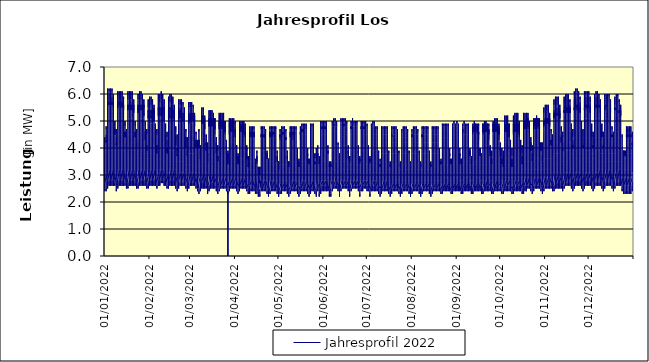
| Category | Jahresprofil 2022 |
|---|---|
| 01/01/2022 | 3 |
| 01/01/2022 | 2.9 |
| 01/01/2022 | 2.7 |
| 01/01/2022 | 2.5 |
| 01/01/2022 | 2.4 |
| 01/01/2022 | 2.4 |
| 01/01/2022 | 2.5 |
| 01/01/2022 | 2.6 |
| 01/01/2022 | 2.7 |
| 01/01/2022 | 2.8 |
| 01/01/2022 | 3.1 |
| 01/01/2022 | 3.4 |
| 01/01/2022 | 3.6 |
| 01/01/2022 | 3.6 |
| 01/01/2022 | 3.6 |
| 01/01/2022 | 3.8 |
| 01/01/2022 | 4 |
| 01/01/2022 | 4.3 |
| 01/01/2022 | 4.4 |
| 01/01/2022 | 4.3 |
| 01/01/2022 | 3.9 |
| 01/01/2022 | 3.6 |
| 01/01/2022 | 3.4 |
| 01/01/2022 | 3.2 |
| 02/01/2022 | 3 |
| 02/01/2022 | 2.7 |
| 02/01/2022 | 2.6 |
| 02/01/2022 | 2.5 |
| 02/01/2022 | 2.4 |
| 02/01/2022 | 2.5 |
| 02/01/2022 | 2.6 |
| 02/01/2022 | 2.8 |
| 02/01/2022 | 3.2 |
| 02/01/2022 | 3.6 |
| 02/01/2022 | 3.9 |
| 02/01/2022 | 4.2 |
| 02/01/2022 | 4.3 |
| 02/01/2022 | 4.2 |
| 02/01/2022 | 4.2 |
| 02/01/2022 | 4.2 |
| 02/01/2022 | 4.5 |
| 02/01/2022 | 4.8 |
| 02/01/2022 | 4.7 |
| 02/01/2022 | 4.6 |
| 02/01/2022 | 4.2 |
| 02/01/2022 | 3.9 |
| 02/01/2022 | 3.8 |
| 02/01/2022 | 3.4 |
| 03/01/2022 | 3 |
| 03/01/2022 | 2.7 |
| 03/01/2022 | 2.6 |
| 03/01/2022 | 2.5 |
| 03/01/2022 | 2.7 |
| 03/01/2022 | 3 |
| 03/01/2022 | 3.8 |
| 03/01/2022 | 4.6 |
| 03/01/2022 | 5 |
| 03/01/2022 | 5.3 |
| 03/01/2022 | 5.5 |
| 03/01/2022 | 5.6 |
| 03/01/2022 | 5.7 |
| 03/01/2022 | 5.6 |
| 03/01/2022 | 5.6 |
| 03/01/2022 | 5.6 |
| 03/01/2022 | 5.9 |
| 03/01/2022 | 6.2 |
| 03/01/2022 | 6.1 |
| 03/01/2022 | 5.8 |
| 03/01/2022 | 5.2 |
| 03/01/2022 | 4.5 |
| 03/01/2022 | 4.1 |
| 03/01/2022 | 3.7 |
| 04/01/2022 | 3.2 |
| 04/01/2022 | 2.8 |
| 04/01/2022 | 2.7 |
| 04/01/2022 | 2.6 |
| 04/01/2022 | 2.8 |
| 04/01/2022 | 3.1 |
| 04/01/2022 | 3.9 |
| 04/01/2022 | 4.7 |
| 04/01/2022 | 5.1 |
| 04/01/2022 | 5.4 |
| 04/01/2022 | 5.6 |
| 04/01/2022 | 5.7 |
| 04/01/2022 | 5.7 |
| 04/01/2022 | 5.7 |
| 04/01/2022 | 5.6 |
| 04/01/2022 | 5.6 |
| 04/01/2022 | 6 |
| 04/01/2022 | 6.2 |
| 04/01/2022 | 6.1 |
| 04/01/2022 | 5.9 |
| 04/01/2022 | 5.2 |
| 04/01/2022 | 4.5 |
| 04/01/2022 | 4.2 |
| 04/01/2022 | 3.7 |
| 05/01/2022 | 3.2 |
| 05/01/2022 | 2.8 |
| 05/01/2022 | 2.7 |
| 05/01/2022 | 2.6 |
| 05/01/2022 | 2.8 |
| 05/01/2022 | 3.1 |
| 05/01/2022 | 3.9 |
| 05/01/2022 | 4.7 |
| 05/01/2022 | 5.1 |
| 05/01/2022 | 5.4 |
| 05/01/2022 | 5.6 |
| 05/01/2022 | 5.7 |
| 05/01/2022 | 5.7 |
| 05/01/2022 | 5.7 |
| 05/01/2022 | 5.6 |
| 05/01/2022 | 5.6 |
| 05/01/2022 | 6 |
| 05/01/2022 | 6.2 |
| 05/01/2022 | 6.1 |
| 05/01/2022 | 5.9 |
| 05/01/2022 | 5.2 |
| 05/01/2022 | 4.5 |
| 05/01/2022 | 4.2 |
| 05/01/2022 | 3.7 |
| 06/01/2022 | 3.2 |
| 06/01/2022 | 2.8 |
| 06/01/2022 | 2.7 |
| 06/01/2022 | 2.6 |
| 06/01/2022 | 2.8 |
| 06/01/2022 | 3.1 |
| 06/01/2022 | 3.9 |
| 06/01/2022 | 4.7 |
| 06/01/2022 | 5.1 |
| 06/01/2022 | 5.4 |
| 06/01/2022 | 5.6 |
| 06/01/2022 | 5.7 |
| 06/01/2022 | 5.7 |
| 06/01/2022 | 5.7 |
| 06/01/2022 | 5.6 |
| 06/01/2022 | 5.6 |
| 06/01/2022 | 5.9 |
| 06/01/2022 | 6.2 |
| 06/01/2022 | 6.1 |
| 06/01/2022 | 5.8 |
| 06/01/2022 | 5.1 |
| 06/01/2022 | 4.5 |
| 06/01/2022 | 4.1 |
| 06/01/2022 | 3.7 |
| 07/01/2022 | 3.2 |
| 07/01/2022 | 2.8 |
| 07/01/2022 | 2.7 |
| 07/01/2022 | 2.6 |
| 07/01/2022 | 2.8 |
| 07/01/2022 | 3.1 |
| 07/01/2022 | 3.8 |
| 07/01/2022 | 4.6 |
| 07/01/2022 | 5.1 |
| 07/01/2022 | 5.4 |
| 07/01/2022 | 5.6 |
| 07/01/2022 | 5.6 |
| 07/01/2022 | 5.7 |
| 07/01/2022 | 5.5 |
| 07/01/2022 | 5.5 |
| 07/01/2022 | 5.5 |
| 07/01/2022 | 5.8 |
| 07/01/2022 | 6 |
| 07/01/2022 | 5.8 |
| 07/01/2022 | 5.5 |
| 07/01/2022 | 4.9 |
| 07/01/2022 | 4.3 |
| 07/01/2022 | 4 |
| 07/01/2022 | 3.6 |
| 08/01/2022 | 3.2 |
| 08/01/2022 | 2.8 |
| 08/01/2022 | 2.7 |
| 08/01/2022 | 2.6 |
| 08/01/2022 | 2.6 |
| 08/01/2022 | 2.7 |
| 08/01/2022 | 2.9 |
| 08/01/2022 | 3.3 |
| 08/01/2022 | 3.7 |
| 08/01/2022 | 4.2 |
| 08/01/2022 | 4.5 |
| 08/01/2022 | 4.7 |
| 08/01/2022 | 4.7 |
| 08/01/2022 | 4.6 |
| 08/01/2022 | 4.5 |
| 08/01/2022 | 4.5 |
| 08/01/2022 | 4.8 |
| 08/01/2022 | 5 |
| 08/01/2022 | 5 |
| 08/01/2022 | 4.8 |
| 08/01/2022 | 4.3 |
| 08/01/2022 | 3.9 |
| 08/01/2022 | 3.7 |
| 08/01/2022 | 3.4 |
| 09/01/2022 | 3 |
| 09/01/2022 | 2.7 |
| 09/01/2022 | 2.6 |
| 09/01/2022 | 2.5 |
| 09/01/2022 | 2.4 |
| 09/01/2022 | 2.5 |
| 09/01/2022 | 2.6 |
| 09/01/2022 | 2.9 |
| 09/01/2022 | 3.2 |
| 09/01/2022 | 3.6 |
| 09/01/2022 | 3.9 |
| 09/01/2022 | 4.1 |
| 09/01/2022 | 4.2 |
| 09/01/2022 | 4.2 |
| 09/01/2022 | 4.1 |
| 09/01/2022 | 4.1 |
| 09/01/2022 | 4.4 |
| 09/01/2022 | 4.7 |
| 09/01/2022 | 4.7 |
| 09/01/2022 | 4.5 |
| 09/01/2022 | 4.2 |
| 09/01/2022 | 3.9 |
| 09/01/2022 | 3.7 |
| 09/01/2022 | 3.4 |
| 10/01/2022 | 3 |
| 10/01/2022 | 2.7 |
| 10/01/2022 | 2.6 |
| 10/01/2022 | 2.5 |
| 10/01/2022 | 2.7 |
| 10/01/2022 | 3 |
| 10/01/2022 | 3.8 |
| 10/01/2022 | 4.6 |
| 10/01/2022 | 5 |
| 10/01/2022 | 5.3 |
| 10/01/2022 | 5.5 |
| 10/01/2022 | 5.6 |
| 10/01/2022 | 5.6 |
| 10/01/2022 | 5.6 |
| 10/01/2022 | 5.5 |
| 10/01/2022 | 5.5 |
| 10/01/2022 | 5.8 |
| 10/01/2022 | 6.1 |
| 10/01/2022 | 6.1 |
| 10/01/2022 | 5.8 |
| 10/01/2022 | 5.1 |
| 10/01/2022 | 4.5 |
| 10/01/2022 | 4.1 |
| 10/01/2022 | 3.6 |
| 11/01/2022 | 3.2 |
| 11/01/2022 | 2.8 |
| 11/01/2022 | 2.7 |
| 11/01/2022 | 2.6 |
| 11/01/2022 | 2.8 |
| 11/01/2022 | 3.1 |
| 11/01/2022 | 3.9 |
| 11/01/2022 | 4.7 |
| 11/01/2022 | 5.1 |
| 11/01/2022 | 5.4 |
| 11/01/2022 | 5.6 |
| 11/01/2022 | 5.7 |
| 11/01/2022 | 5.7 |
| 11/01/2022 | 5.6 |
| 11/01/2022 | 5.6 |
| 11/01/2022 | 5.6 |
| 11/01/2022 | 5.8 |
| 11/01/2022 | 6.1 |
| 11/01/2022 | 6.1 |
| 11/01/2022 | 5.8 |
| 11/01/2022 | 5.2 |
| 11/01/2022 | 4.5 |
| 11/01/2022 | 4.1 |
| 11/01/2022 | 3.7 |
| 12/01/2022 | 3.2 |
| 12/01/2022 | 2.8 |
| 12/01/2022 | 2.7 |
| 12/01/2022 | 2.6 |
| 12/01/2022 | 2.8 |
| 12/01/2022 | 3.1 |
| 12/01/2022 | 3.9 |
| 12/01/2022 | 4.7 |
| 12/01/2022 | 5.1 |
| 12/01/2022 | 5.4 |
| 12/01/2022 | 5.6 |
| 12/01/2022 | 5.6 |
| 12/01/2022 | 5.7 |
| 12/01/2022 | 5.6 |
| 12/01/2022 | 5.5 |
| 12/01/2022 | 5.5 |
| 12/01/2022 | 5.8 |
| 12/01/2022 | 6.1 |
| 12/01/2022 | 6.1 |
| 12/01/2022 | 5.8 |
| 12/01/2022 | 5.2 |
| 12/01/2022 | 4.5 |
| 12/01/2022 | 4.1 |
| 12/01/2022 | 3.7 |
| 13/01/2022 | 3.2 |
| 13/01/2022 | 2.8 |
| 13/01/2022 | 2.7 |
| 13/01/2022 | 2.6 |
| 13/01/2022 | 2.8 |
| 13/01/2022 | 3.1 |
| 13/01/2022 | 3.9 |
| 13/01/2022 | 4.7 |
| 13/01/2022 | 5.1 |
| 13/01/2022 | 5.4 |
| 13/01/2022 | 5.5 |
| 13/01/2022 | 5.6 |
| 13/01/2022 | 5.7 |
| 13/01/2022 | 5.6 |
| 13/01/2022 | 5.5 |
| 13/01/2022 | 5.5 |
| 13/01/2022 | 5.8 |
| 13/01/2022 | 6.1 |
| 13/01/2022 | 6.1 |
| 13/01/2022 | 5.8 |
| 13/01/2022 | 5.1 |
| 13/01/2022 | 4.5 |
| 13/01/2022 | 4.1 |
| 13/01/2022 | 3.7 |
| 14/01/2022 | 3.2 |
| 14/01/2022 | 2.8 |
| 14/01/2022 | 2.7 |
| 14/01/2022 | 2.6 |
| 14/01/2022 | 2.8 |
| 14/01/2022 | 3.1 |
| 14/01/2022 | 3.9 |
| 14/01/2022 | 4.6 |
| 14/01/2022 | 5.1 |
| 14/01/2022 | 5.4 |
| 14/01/2022 | 5.5 |
| 14/01/2022 | 5.6 |
| 14/01/2022 | 5.6 |
| 14/01/2022 | 5.5 |
| 14/01/2022 | 5.4 |
| 14/01/2022 | 5.4 |
| 14/01/2022 | 5.6 |
| 14/01/2022 | 5.9 |
| 14/01/2022 | 5.8 |
| 14/01/2022 | 5.5 |
| 14/01/2022 | 4.9 |
| 14/01/2022 | 4.3 |
| 14/01/2022 | 3.9 |
| 14/01/2022 | 3.6 |
| 15/01/2022 | 3.2 |
| 15/01/2022 | 2.8 |
| 15/01/2022 | 2.7 |
| 15/01/2022 | 2.6 |
| 15/01/2022 | 2.6 |
| 15/01/2022 | 2.7 |
| 15/01/2022 | 2.9 |
| 15/01/2022 | 3.3 |
| 15/01/2022 | 3.7 |
| 15/01/2022 | 4.2 |
| 15/01/2022 | 4.5 |
| 15/01/2022 | 4.6 |
| 15/01/2022 | 4.6 |
| 15/01/2022 | 4.5 |
| 15/01/2022 | 4.4 |
| 15/01/2022 | 4.4 |
| 15/01/2022 | 4.6 |
| 15/01/2022 | 4.9 |
| 15/01/2022 | 5 |
| 15/01/2022 | 4.8 |
| 15/01/2022 | 4.3 |
| 15/01/2022 | 3.9 |
| 15/01/2022 | 3.7 |
| 15/01/2022 | 3.4 |
| 16/01/2022 | 3 |
| 16/01/2022 | 2.7 |
| 16/01/2022 | 2.6 |
| 16/01/2022 | 2.5 |
| 16/01/2022 | 2.5 |
| 16/01/2022 | 2.5 |
| 16/01/2022 | 2.6 |
| 16/01/2022 | 2.9 |
| 16/01/2022 | 3.2 |
| 16/01/2022 | 3.6 |
| 16/01/2022 | 3.9 |
| 16/01/2022 | 4.1 |
| 16/01/2022 | 4.2 |
| 16/01/2022 | 4.1 |
| 16/01/2022 | 4 |
| 16/01/2022 | 4 |
| 16/01/2022 | 4.3 |
| 16/01/2022 | 4.6 |
| 16/01/2022 | 4.7 |
| 16/01/2022 | 4.5 |
| 16/01/2022 | 4.2 |
| 16/01/2022 | 3.8 |
| 16/01/2022 | 3.7 |
| 16/01/2022 | 3.4 |
| 17/01/2022 | 3 |
| 17/01/2022 | 2.7 |
| 17/01/2022 | 2.6 |
| 17/01/2022 | 2.5 |
| 17/01/2022 | 2.7 |
| 17/01/2022 | 3 |
| 17/01/2022 | 3.8 |
| 17/01/2022 | 4.6 |
| 17/01/2022 | 5 |
| 17/01/2022 | 5.3 |
| 17/01/2022 | 5.5 |
| 17/01/2022 | 5.6 |
| 17/01/2022 | 5.6 |
| 17/01/2022 | 5.5 |
| 17/01/2022 | 5.5 |
| 17/01/2022 | 5.4 |
| 17/01/2022 | 5.6 |
| 17/01/2022 | 6 |
| 17/01/2022 | 6.1 |
| 17/01/2022 | 5.8 |
| 17/01/2022 | 5.1 |
| 17/01/2022 | 4.5 |
| 17/01/2022 | 4.1 |
| 17/01/2022 | 3.6 |
| 18/01/2022 | 3.2 |
| 18/01/2022 | 2.8 |
| 18/01/2022 | 2.7 |
| 18/01/2022 | 2.6 |
| 18/01/2022 | 2.8 |
| 18/01/2022 | 3.1 |
| 18/01/2022 | 3.9 |
| 18/01/2022 | 4.7 |
| 18/01/2022 | 5.1 |
| 18/01/2022 | 5.4 |
| 18/01/2022 | 5.5 |
| 18/01/2022 | 5.6 |
| 18/01/2022 | 5.6 |
| 18/01/2022 | 5.6 |
| 18/01/2022 | 5.5 |
| 18/01/2022 | 5.5 |
| 18/01/2022 | 5.7 |
| 18/01/2022 | 6 |
| 18/01/2022 | 6.1 |
| 18/01/2022 | 5.8 |
| 18/01/2022 | 5.1 |
| 18/01/2022 | 4.5 |
| 18/01/2022 | 4.1 |
| 18/01/2022 | 3.7 |
| 19/01/2022 | 3.2 |
| 19/01/2022 | 2.8 |
| 19/01/2022 | 2.7 |
| 19/01/2022 | 2.6 |
| 19/01/2022 | 2.8 |
| 19/01/2022 | 3.1 |
| 19/01/2022 | 3.9 |
| 19/01/2022 | 4.7 |
| 19/01/2022 | 5.1 |
| 19/01/2022 | 5.4 |
| 19/01/2022 | 5.5 |
| 19/01/2022 | 5.6 |
| 19/01/2022 | 5.6 |
| 19/01/2022 | 5.5 |
| 19/01/2022 | 5.5 |
| 19/01/2022 | 5.4 |
| 19/01/2022 | 5.7 |
| 19/01/2022 | 6 |
| 19/01/2022 | 6.1 |
| 19/01/2022 | 5.8 |
| 19/01/2022 | 5.1 |
| 19/01/2022 | 4.5 |
| 19/01/2022 | 4.1 |
| 19/01/2022 | 3.7 |
| 20/01/2022 | 3.2 |
| 20/01/2022 | 2.8 |
| 20/01/2022 | 2.7 |
| 20/01/2022 | 2.6 |
| 20/01/2022 | 2.8 |
| 20/01/2022 | 3.1 |
| 20/01/2022 | 3.9 |
| 20/01/2022 | 4.7 |
| 20/01/2022 | 5.1 |
| 20/01/2022 | 5.4 |
| 20/01/2022 | 5.5 |
| 20/01/2022 | 5.6 |
| 20/01/2022 | 5.6 |
| 20/01/2022 | 5.5 |
| 20/01/2022 | 5.5 |
| 20/01/2022 | 5.4 |
| 20/01/2022 | 5.6 |
| 20/01/2022 | 6 |
| 20/01/2022 | 6.1 |
| 20/01/2022 | 5.8 |
| 20/01/2022 | 5.1 |
| 20/01/2022 | 4.5 |
| 20/01/2022 | 4 |
| 20/01/2022 | 3.6 |
| 21/01/2022 | 3.2 |
| 21/01/2022 | 2.8 |
| 21/01/2022 | 2.7 |
| 21/01/2022 | 2.6 |
| 21/01/2022 | 2.8 |
| 21/01/2022 | 3.1 |
| 21/01/2022 | 3.9 |
| 21/01/2022 | 4.6 |
| 21/01/2022 | 5.1 |
| 21/01/2022 | 5.4 |
| 21/01/2022 | 5.5 |
| 21/01/2022 | 5.6 |
| 21/01/2022 | 5.6 |
| 21/01/2022 | 5.4 |
| 21/01/2022 | 5.3 |
| 21/01/2022 | 5.3 |
| 21/01/2022 | 5.5 |
| 21/01/2022 | 5.8 |
| 21/01/2022 | 5.8 |
| 21/01/2022 | 5.5 |
| 21/01/2022 | 4.8 |
| 21/01/2022 | 4.2 |
| 21/01/2022 | 3.9 |
| 21/01/2022 | 3.5 |
| 22/01/2022 | 3.2 |
| 22/01/2022 | 2.8 |
| 22/01/2022 | 2.7 |
| 22/01/2022 | 2.6 |
| 22/01/2022 | 2.6 |
| 22/01/2022 | 2.7 |
| 22/01/2022 | 2.9 |
| 22/01/2022 | 3.3 |
| 22/01/2022 | 3.7 |
| 22/01/2022 | 4.2 |
| 22/01/2022 | 4.5 |
| 22/01/2022 | 4.6 |
| 22/01/2022 | 4.6 |
| 22/01/2022 | 4.5 |
| 22/01/2022 | 4.4 |
| 22/01/2022 | 4.4 |
| 22/01/2022 | 4.5 |
| 22/01/2022 | 4.9 |
| 22/01/2022 | 5 |
| 22/01/2022 | 4.8 |
| 22/01/2022 | 4.3 |
| 22/01/2022 | 3.9 |
| 22/01/2022 | 3.6 |
| 22/01/2022 | 3.4 |
| 23/01/2022 | 3 |
| 23/01/2022 | 2.7 |
| 23/01/2022 | 2.6 |
| 23/01/2022 | 2.5 |
| 23/01/2022 | 2.5 |
| 23/01/2022 | 2.5 |
| 23/01/2022 | 2.6 |
| 23/01/2022 | 2.9 |
| 23/01/2022 | 3.2 |
| 23/01/2022 | 3.6 |
| 23/01/2022 | 3.9 |
| 23/01/2022 | 4.1 |
| 23/01/2022 | 4.2 |
| 23/01/2022 | 4.1 |
| 23/01/2022 | 4 |
| 23/01/2022 | 4 |
| 23/01/2022 | 4.1 |
| 23/01/2022 | 4.5 |
| 23/01/2022 | 4.7 |
| 23/01/2022 | 4.5 |
| 23/01/2022 | 4.1 |
| 23/01/2022 | 3.8 |
| 23/01/2022 | 3.7 |
| 23/01/2022 | 3.4 |
| 24/01/2022 | 3 |
| 24/01/2022 | 2.7 |
| 24/01/2022 | 2.6 |
| 24/01/2022 | 2.5 |
| 24/01/2022 | 2.7 |
| 24/01/2022 | 3.1 |
| 24/01/2022 | 3.9 |
| 24/01/2022 | 4.6 |
| 24/01/2022 | 5 |
| 24/01/2022 | 5.3 |
| 24/01/2022 | 5.5 |
| 24/01/2022 | 5.5 |
| 24/01/2022 | 5.6 |
| 24/01/2022 | 5.5 |
| 24/01/2022 | 5.4 |
| 24/01/2022 | 5.3 |
| 24/01/2022 | 5.5 |
| 24/01/2022 | 5.9 |
| 24/01/2022 | 6 |
| 24/01/2022 | 5.8 |
| 24/01/2022 | 5.1 |
| 24/01/2022 | 4.4 |
| 24/01/2022 | 4 |
| 24/01/2022 | 3.6 |
| 25/01/2022 | 3.2 |
| 25/01/2022 | 2.8 |
| 25/01/2022 | 2.7 |
| 25/01/2022 | 2.6 |
| 25/01/2022 | 2.8 |
| 25/01/2022 | 3.1 |
| 25/01/2022 | 3.9 |
| 25/01/2022 | 4.7 |
| 25/01/2022 | 5.1 |
| 25/01/2022 | 5.4 |
| 25/01/2022 | 5.5 |
| 25/01/2022 | 5.6 |
| 25/01/2022 | 5.6 |
| 25/01/2022 | 5.5 |
| 25/01/2022 | 5.4 |
| 25/01/2022 | 5.4 |
| 25/01/2022 | 5.6 |
| 25/01/2022 | 6 |
| 25/01/2022 | 6.1 |
| 25/01/2022 | 5.8 |
| 25/01/2022 | 5.1 |
| 25/01/2022 | 4.5 |
| 25/01/2022 | 4 |
| 25/01/2022 | 3.6 |
| 26/01/2022 | 3.2 |
| 26/01/2022 | 2.8 |
| 26/01/2022 | 2.7 |
| 26/01/2022 | 2.6 |
| 26/01/2022 | 2.8 |
| 26/01/2022 | 3.2 |
| 26/01/2022 | 4 |
| 26/01/2022 | 4.7 |
| 26/01/2022 | 5.1 |
| 26/01/2022 | 5.4 |
| 26/01/2022 | 5.5 |
| 26/01/2022 | 5.6 |
| 26/01/2022 | 5.6 |
| 26/01/2022 | 5.5 |
| 26/01/2022 | 5.4 |
| 26/01/2022 | 5.4 |
| 26/01/2022 | 5.5 |
| 26/01/2022 | 6 |
| 26/01/2022 | 6.1 |
| 26/01/2022 | 5.8 |
| 26/01/2022 | 5.1 |
| 26/01/2022 | 4.4 |
| 26/01/2022 | 4 |
| 26/01/2022 | 3.6 |
| 27/01/2022 | 3.2 |
| 27/01/2022 | 2.8 |
| 27/01/2022 | 2.7 |
| 27/01/2022 | 2.6 |
| 27/01/2022 | 2.8 |
| 27/01/2022 | 3.2 |
| 27/01/2022 | 3.9 |
| 27/01/2022 | 4.7 |
| 27/01/2022 | 5.1 |
| 27/01/2022 | 5.4 |
| 27/01/2022 | 5.5 |
| 27/01/2022 | 5.6 |
| 27/01/2022 | 5.6 |
| 27/01/2022 | 5.5 |
| 27/01/2022 | 5.4 |
| 27/01/2022 | 5.4 |
| 27/01/2022 | 5.5 |
| 27/01/2022 | 5.9 |
| 27/01/2022 | 6 |
| 27/01/2022 | 5.7 |
| 27/01/2022 | 5.1 |
| 27/01/2022 | 4.4 |
| 27/01/2022 | 4 |
| 27/01/2022 | 3.6 |
| 28/01/2022 | 3.2 |
| 28/01/2022 | 2.8 |
| 28/01/2022 | 2.7 |
| 28/01/2022 | 2.6 |
| 28/01/2022 | 2.8 |
| 28/01/2022 | 3.1 |
| 28/01/2022 | 3.9 |
| 28/01/2022 | 4.6 |
| 28/01/2022 | 5.1 |
| 28/01/2022 | 5.4 |
| 28/01/2022 | 5.5 |
| 28/01/2022 | 5.6 |
| 28/01/2022 | 5.5 |
| 28/01/2022 | 5.4 |
| 28/01/2022 | 5.3 |
| 28/01/2022 | 5.2 |
| 28/01/2022 | 5.3 |
| 28/01/2022 | 5.7 |
| 28/01/2022 | 5.8 |
| 28/01/2022 | 5.5 |
| 28/01/2022 | 4.8 |
| 28/01/2022 | 4.2 |
| 28/01/2022 | 3.8 |
| 28/01/2022 | 3.5 |
| 29/01/2022 | 3.2 |
| 29/01/2022 | 2.9 |
| 29/01/2022 | 2.7 |
| 29/01/2022 | 2.6 |
| 29/01/2022 | 2.6 |
| 29/01/2022 | 2.7 |
| 29/01/2022 | 2.9 |
| 29/01/2022 | 3.3 |
| 29/01/2022 | 3.7 |
| 29/01/2022 | 4.2 |
| 29/01/2022 | 4.5 |
| 29/01/2022 | 4.6 |
| 29/01/2022 | 4.6 |
| 29/01/2022 | 4.4 |
| 29/01/2022 | 4.3 |
| 29/01/2022 | 4.3 |
| 29/01/2022 | 4.4 |
| 29/01/2022 | 4.8 |
| 29/01/2022 | 5 |
| 29/01/2022 | 4.8 |
| 29/01/2022 | 4.3 |
| 29/01/2022 | 3.8 |
| 29/01/2022 | 3.6 |
| 29/01/2022 | 3.3 |
| 30/01/2022 | 3 |
| 30/01/2022 | 2.7 |
| 30/01/2022 | 2.6 |
| 30/01/2022 | 2.5 |
| 30/01/2022 | 2.5 |
| 30/01/2022 | 2.5 |
| 30/01/2022 | 2.6 |
| 30/01/2022 | 2.9 |
| 30/01/2022 | 3.2 |
| 30/01/2022 | 3.6 |
| 30/01/2022 | 3.9 |
| 30/01/2022 | 4.1 |
| 30/01/2022 | 4.1 |
| 30/01/2022 | 4 |
| 30/01/2022 | 3.9 |
| 30/01/2022 | 3.9 |
| 30/01/2022 | 4 |
| 30/01/2022 | 4.5 |
| 30/01/2022 | 4.7 |
| 30/01/2022 | 4.5 |
| 30/01/2022 | 4.1 |
| 30/01/2022 | 3.8 |
| 30/01/2022 | 3.6 |
| 30/01/2022 | 3.4 |
| 31/01/2022 | 3 |
| 31/01/2022 | 2.7 |
| 31/01/2022 | 2.5 |
| 31/01/2022 | 2.5 |
| 31/01/2022 | 2.7 |
| 31/01/2022 | 3 |
| 31/01/2022 | 3.7 |
| 31/01/2022 | 4.4 |
| 31/01/2022 | 4.9 |
| 31/01/2022 | 5.1 |
| 31/01/2022 | 5.3 |
| 31/01/2022 | 5.4 |
| 31/01/2022 | 5.4 |
| 31/01/2022 | 5.3 |
| 31/01/2022 | 5.2 |
| 31/01/2022 | 5.1 |
| 31/01/2022 | 5.2 |
| 31/01/2022 | 5.7 |
| 31/01/2022 | 5.8 |
| 31/01/2022 | 5.5 |
| 31/01/2022 | 4.9 |
| 31/01/2022 | 4.3 |
| 31/01/2022 | 3.9 |
| 31/01/2022 | 3.6 |
| 01/02/2022 | 3.2 |
| 01/02/2022 | 2.8 |
| 01/02/2022 | 2.6 |
| 01/02/2022 | 2.6 |
| 01/02/2022 | 2.8 |
| 01/02/2022 | 3.1 |
| 01/02/2022 | 3.8 |
| 01/02/2022 | 4.5 |
| 01/02/2022 | 5 |
| 01/02/2022 | 5.2 |
| 01/02/2022 | 5.4 |
| 01/02/2022 | 5.4 |
| 01/02/2022 | 5.4 |
| 01/02/2022 | 5.3 |
| 01/02/2022 | 5.2 |
| 01/02/2022 | 5.1 |
| 01/02/2022 | 5.3 |
| 01/02/2022 | 5.7 |
| 01/02/2022 | 5.9 |
| 01/02/2022 | 5.5 |
| 01/02/2022 | 4.9 |
| 01/02/2022 | 4.3 |
| 01/02/2022 | 4 |
| 01/02/2022 | 3.6 |
| 02/02/2022 | 3.2 |
| 02/02/2022 | 2.8 |
| 02/02/2022 | 2.7 |
| 02/02/2022 | 2.6 |
| 02/02/2022 | 2.8 |
| 02/02/2022 | 3.1 |
| 02/02/2022 | 3.8 |
| 02/02/2022 | 4.5 |
| 02/02/2022 | 4.9 |
| 02/02/2022 | 5.2 |
| 02/02/2022 | 5.4 |
| 02/02/2022 | 5.4 |
| 02/02/2022 | 5.4 |
| 02/02/2022 | 5.3 |
| 02/02/2022 | 5.2 |
| 02/02/2022 | 5.1 |
| 02/02/2022 | 5.2 |
| 02/02/2022 | 5.7 |
| 02/02/2022 | 5.9 |
| 02/02/2022 | 5.6 |
| 02/02/2022 | 4.9 |
| 02/02/2022 | 4.3 |
| 02/02/2022 | 3.9 |
| 02/02/2022 | 3.6 |
| 03/02/2022 | 3.2 |
| 03/02/2022 | 2.8 |
| 03/02/2022 | 2.7 |
| 03/02/2022 | 2.6 |
| 03/02/2022 | 2.8 |
| 03/02/2022 | 3.1 |
| 03/02/2022 | 3.8 |
| 03/02/2022 | 4.5 |
| 03/02/2022 | 4.9 |
| 03/02/2022 | 5.2 |
| 03/02/2022 | 5.4 |
| 03/02/2022 | 5.4 |
| 03/02/2022 | 5.4 |
| 03/02/2022 | 5.3 |
| 03/02/2022 | 5.2 |
| 03/02/2022 | 5.1 |
| 03/02/2022 | 5.2 |
| 03/02/2022 | 5.7 |
| 03/02/2022 | 5.8 |
| 03/02/2022 | 5.5 |
| 03/02/2022 | 4.9 |
| 03/02/2022 | 4.3 |
| 03/02/2022 | 3.9 |
| 03/02/2022 | 3.6 |
| 04/02/2022 | 3.2 |
| 04/02/2022 | 2.8 |
| 04/02/2022 | 2.7 |
| 04/02/2022 | 2.6 |
| 04/02/2022 | 2.8 |
| 04/02/2022 | 3.1 |
| 04/02/2022 | 3.8 |
| 04/02/2022 | 4.4 |
| 04/02/2022 | 4.9 |
| 04/02/2022 | 5.2 |
| 04/02/2022 | 5.4 |
| 04/02/2022 | 5.4 |
| 04/02/2022 | 5.4 |
| 04/02/2022 | 5.2 |
| 04/02/2022 | 5.1 |
| 04/02/2022 | 5 |
| 04/02/2022 | 5 |
| 04/02/2022 | 5.5 |
| 04/02/2022 | 5.6 |
| 04/02/2022 | 5.2 |
| 04/02/2022 | 4.7 |
| 04/02/2022 | 4.1 |
| 04/02/2022 | 3.7 |
| 04/02/2022 | 3.5 |
| 05/02/2022 | 3.2 |
| 05/02/2022 | 2.9 |
| 05/02/2022 | 2.7 |
| 05/02/2022 | 2.6 |
| 05/02/2022 | 2.6 |
| 05/02/2022 | 2.7 |
| 05/02/2022 | 2.9 |
| 05/02/2022 | 3.3 |
| 05/02/2022 | 3.7 |
| 05/02/2022 | 4.2 |
| 05/02/2022 | 4.5 |
| 05/02/2022 | 4.6 |
| 05/02/2022 | 4.5 |
| 05/02/2022 | 4.4 |
| 05/02/2022 | 4.3 |
| 05/02/2022 | 4.2 |
| 05/02/2022 | 4.3 |
| 05/02/2022 | 4.7 |
| 05/02/2022 | 4.9 |
| 05/02/2022 | 4.7 |
| 05/02/2022 | 4.3 |
| 05/02/2022 | 3.8 |
| 05/02/2022 | 3.6 |
| 05/02/2022 | 3.3 |
| 06/02/2022 | 3 |
| 06/02/2022 | 2.7 |
| 06/02/2022 | 2.6 |
| 06/02/2022 | 2.5 |
| 06/02/2022 | 2.5 |
| 06/02/2022 | 2.5 |
| 06/02/2022 | 2.6 |
| 06/02/2022 | 2.9 |
| 06/02/2022 | 3.2 |
| 06/02/2022 | 3.6 |
| 06/02/2022 | 3.9 |
| 06/02/2022 | 4 |
| 06/02/2022 | 4.1 |
| 06/02/2022 | 4 |
| 06/02/2022 | 3.9 |
| 06/02/2022 | 3.8 |
| 06/02/2022 | 3.9 |
| 06/02/2022 | 4.4 |
| 06/02/2022 | 4.7 |
| 06/02/2022 | 4.5 |
| 06/02/2022 | 4.1 |
| 06/02/2022 | 3.8 |
| 06/02/2022 | 3.6 |
| 06/02/2022 | 3.4 |
| 07/02/2022 | 3 |
| 07/02/2022 | 2.7 |
| 07/02/2022 | 2.6 |
| 07/02/2022 | 2.6 |
| 07/02/2022 | 2.7 |
| 07/02/2022 | 3.1 |
| 07/02/2022 | 3.9 |
| 07/02/2022 | 4.6 |
| 07/02/2022 | 5.1 |
| 07/02/2022 | 5.3 |
| 07/02/2022 | 5.4 |
| 07/02/2022 | 5.5 |
| 07/02/2022 | 5.5 |
| 07/02/2022 | 5.4 |
| 07/02/2022 | 5.3 |
| 07/02/2022 | 5.2 |
| 07/02/2022 | 5.2 |
| 07/02/2022 | 5.7 |
| 07/02/2022 | 6 |
| 07/02/2022 | 5.7 |
| 07/02/2022 | 5 |
| 07/02/2022 | 4.4 |
| 07/02/2022 | 3.9 |
| 07/02/2022 | 3.6 |
| 08/02/2022 | 3.2 |
| 08/02/2022 | 2.8 |
| 08/02/2022 | 2.7 |
| 08/02/2022 | 2.6 |
| 08/02/2022 | 2.8 |
| 08/02/2022 | 3.2 |
| 08/02/2022 | 4 |
| 08/02/2022 | 4.7 |
| 08/02/2022 | 5.2 |
| 08/02/2022 | 5.4 |
| 08/02/2022 | 5.5 |
| 08/02/2022 | 5.5 |
| 08/02/2022 | 5.5 |
| 08/02/2022 | 5.4 |
| 08/02/2022 | 5.3 |
| 08/02/2022 | 5.2 |
| 08/02/2022 | 5.3 |
| 08/02/2022 | 5.8 |
| 08/02/2022 | 6 |
| 08/02/2022 | 5.7 |
| 08/02/2022 | 5.1 |
| 08/02/2022 | 4.4 |
| 08/02/2022 | 4 |
| 08/02/2022 | 3.6 |
| 09/02/2022 | 3.2 |
| 09/02/2022 | 2.8 |
| 09/02/2022 | 2.7 |
| 09/02/2022 | 2.7 |
| 09/02/2022 | 2.8 |
| 09/02/2022 | 3.2 |
| 09/02/2022 | 4 |
| 09/02/2022 | 4.7 |
| 09/02/2022 | 5.2 |
| 09/02/2022 | 5.4 |
| 09/02/2022 | 5.5 |
| 09/02/2022 | 5.5 |
| 09/02/2022 | 5.5 |
| 09/02/2022 | 5.4 |
| 09/02/2022 | 5.3 |
| 09/02/2022 | 5.2 |
| 09/02/2022 | 5.3 |
| 09/02/2022 | 5.8 |
| 09/02/2022 | 6.1 |
| 09/02/2022 | 5.8 |
| 09/02/2022 | 5.1 |
| 09/02/2022 | 4.4 |
| 09/02/2022 | 4 |
| 09/02/2022 | 3.6 |
| 10/02/2022 | 3.2 |
| 10/02/2022 | 2.8 |
| 10/02/2022 | 2.7 |
| 10/02/2022 | 2.7 |
| 10/02/2022 | 2.8 |
| 10/02/2022 | 3.2 |
| 10/02/2022 | 4 |
| 10/02/2022 | 4.7 |
| 10/02/2022 | 5.2 |
| 10/02/2022 | 5.4 |
| 10/02/2022 | 5.5 |
| 10/02/2022 | 5.5 |
| 10/02/2022 | 5.5 |
| 10/02/2022 | 5.4 |
| 10/02/2022 | 5.3 |
| 10/02/2022 | 5.2 |
| 10/02/2022 | 5.2 |
| 10/02/2022 | 5.7 |
| 10/02/2022 | 6 |
| 10/02/2022 | 5.7 |
| 10/02/2022 | 5 |
| 10/02/2022 | 4.4 |
| 10/02/2022 | 3.9 |
| 10/02/2022 | 3.6 |
| 11/02/2022 | 3.2 |
| 11/02/2022 | 2.8 |
| 11/02/2022 | 2.7 |
| 11/02/2022 | 2.6 |
| 11/02/2022 | 2.8 |
| 11/02/2022 | 3.1 |
| 11/02/2022 | 3.9 |
| 11/02/2022 | 4.7 |
| 11/02/2022 | 5.1 |
| 11/02/2022 | 5.3 |
| 11/02/2022 | 5.5 |
| 11/02/2022 | 5.5 |
| 11/02/2022 | 5.4 |
| 11/02/2022 | 5.3 |
| 11/02/2022 | 5.1 |
| 11/02/2022 | 5 |
| 11/02/2022 | 5.1 |
| 11/02/2022 | 5.5 |
| 11/02/2022 | 5.8 |
| 11/02/2022 | 5.4 |
| 11/02/2022 | 4.8 |
| 11/02/2022 | 4.2 |
| 11/02/2022 | 3.8 |
| 11/02/2022 | 3.5 |
| 12/02/2022 | 3.1 |
| 12/02/2022 | 2.8 |
| 12/02/2022 | 2.7 |
| 12/02/2022 | 2.6 |
| 12/02/2022 | 2.6 |
| 12/02/2022 | 2.7 |
| 12/02/2022 | 2.9 |
| 12/02/2022 | 3.3 |
| 12/02/2022 | 3.7 |
| 12/02/2022 | 4.2 |
| 12/02/2022 | 4.4 |
| 12/02/2022 | 4.5 |
| 12/02/2022 | 4.5 |
| 12/02/2022 | 4.3 |
| 12/02/2022 | 4.2 |
| 12/02/2022 | 4.1 |
| 12/02/2022 | 4.2 |
| 12/02/2022 | 4.6 |
| 12/02/2022 | 4.9 |
| 12/02/2022 | 4.7 |
| 12/02/2022 | 4.2 |
| 12/02/2022 | 3.8 |
| 12/02/2022 | 3.5 |
| 12/02/2022 | 3.3 |
| 13/02/2022 | 3 |
| 13/02/2022 | 2.7 |
| 13/02/2022 | 2.6 |
| 13/02/2022 | 2.5 |
| 13/02/2022 | 2.5 |
| 13/02/2022 | 2.5 |
| 13/02/2022 | 2.6 |
| 13/02/2022 | 2.9 |
| 13/02/2022 | 3.2 |
| 13/02/2022 | 3.6 |
| 13/02/2022 | 3.8 |
| 13/02/2022 | 4 |
| 13/02/2022 | 4 |
| 13/02/2022 | 3.9 |
| 13/02/2022 | 3.8 |
| 13/02/2022 | 3.8 |
| 13/02/2022 | 3.8 |
| 13/02/2022 | 4.3 |
| 13/02/2022 | 4.6 |
| 13/02/2022 | 4.4 |
| 13/02/2022 | 4.1 |
| 13/02/2022 | 3.7 |
| 13/02/2022 | 3.6 |
| 13/02/2022 | 3.3 |
| 14/02/2022 | 3 |
| 14/02/2022 | 2.7 |
| 14/02/2022 | 2.6 |
| 14/02/2022 | 2.5 |
| 14/02/2022 | 2.7 |
| 14/02/2022 | 3.1 |
| 14/02/2022 | 3.9 |
| 14/02/2022 | 4.6 |
| 14/02/2022 | 5 |
| 14/02/2022 | 5.3 |
| 14/02/2022 | 5.4 |
| 14/02/2022 | 5.4 |
| 14/02/2022 | 5.4 |
| 14/02/2022 | 5.3 |
| 14/02/2022 | 5.2 |
| 14/02/2022 | 5.1 |
| 14/02/2022 | 5.1 |
| 14/02/2022 | 5.6 |
| 14/02/2022 | 5.9 |
| 14/02/2022 | 5.7 |
| 14/02/2022 | 5 |
| 14/02/2022 | 4.3 |
| 14/02/2022 | 3.9 |
| 14/02/2022 | 3.5 |
| 15/02/2022 | 3.1 |
| 15/02/2022 | 2.8 |
| 15/02/2022 | 2.6 |
| 15/02/2022 | 2.6 |
| 15/02/2022 | 2.8 |
| 15/02/2022 | 3.1 |
| 15/02/2022 | 3.9 |
| 15/02/2022 | 4.7 |
| 15/02/2022 | 5.1 |
| 15/02/2022 | 5.3 |
| 15/02/2022 | 5.4 |
| 15/02/2022 | 5.5 |
| 15/02/2022 | 5.4 |
| 15/02/2022 | 5.3 |
| 15/02/2022 | 5.2 |
| 15/02/2022 | 5.1 |
| 15/02/2022 | 5.2 |
| 15/02/2022 | 5.6 |
| 15/02/2022 | 6 |
| 15/02/2022 | 5.7 |
| 15/02/2022 | 5 |
| 15/02/2022 | 4.4 |
| 15/02/2022 | 3.9 |
| 15/02/2022 | 3.6 |
| 16/02/2022 | 3.2 |
| 16/02/2022 | 2.8 |
| 16/02/2022 | 2.7 |
| 16/02/2022 | 2.6 |
| 16/02/2022 | 2.8 |
| 16/02/2022 | 3.1 |
| 16/02/2022 | 4 |
| 16/02/2022 | 4.7 |
| 16/02/2022 | 5.1 |
| 16/02/2022 | 5.3 |
| 16/02/2022 | 5.4 |
| 16/02/2022 | 5.4 |
| 16/02/2022 | 5.4 |
| 16/02/2022 | 5.3 |
| 16/02/2022 | 5.2 |
| 16/02/2022 | 5.1 |
| 16/02/2022 | 5.2 |
| 16/02/2022 | 5.6 |
| 16/02/2022 | 6 |
| 16/02/2022 | 5.7 |
| 16/02/2022 | 5 |
| 16/02/2022 | 4.3 |
| 16/02/2022 | 3.9 |
| 16/02/2022 | 3.5 |
| 17/02/2022 | 3.2 |
| 17/02/2022 | 2.8 |
| 17/02/2022 | 2.7 |
| 17/02/2022 | 2.6 |
| 17/02/2022 | 2.8 |
| 17/02/2022 | 3.1 |
| 17/02/2022 | 3.9 |
| 17/02/2022 | 4.7 |
| 17/02/2022 | 5.1 |
| 17/02/2022 | 5.3 |
| 17/02/2022 | 5.4 |
| 17/02/2022 | 5.4 |
| 17/02/2022 | 5.4 |
| 17/02/2022 | 5.3 |
| 17/02/2022 | 5.2 |
| 17/02/2022 | 5.1 |
| 17/02/2022 | 5.1 |
| 17/02/2022 | 5.6 |
| 17/02/2022 | 5.9 |
| 17/02/2022 | 5.6 |
| 17/02/2022 | 5 |
| 17/02/2022 | 4.3 |
| 17/02/2022 | 3.9 |
| 17/02/2022 | 3.5 |
| 18/02/2022 | 3.2 |
| 18/02/2022 | 2.8 |
| 18/02/2022 | 2.6 |
| 18/02/2022 | 2.6 |
| 18/02/2022 | 2.8 |
| 18/02/2022 | 3.1 |
| 18/02/2022 | 3.9 |
| 18/02/2022 | 4.6 |
| 18/02/2022 | 5 |
| 18/02/2022 | 5.3 |
| 18/02/2022 | 5.4 |
| 18/02/2022 | 5.4 |
| 18/02/2022 | 5.3 |
| 18/02/2022 | 5.2 |
| 18/02/2022 | 5.1 |
| 18/02/2022 | 5 |
| 18/02/2022 | 5 |
| 18/02/2022 | 5.4 |
| 18/02/2022 | 5.6 |
| 18/02/2022 | 5.4 |
| 18/02/2022 | 4.7 |
| 18/02/2022 | 4.1 |
| 18/02/2022 | 3.7 |
| 18/02/2022 | 3.4 |
| 19/02/2022 | 3.1 |
| 19/02/2022 | 2.8 |
| 19/02/2022 | 2.6 |
| 19/02/2022 | 2.6 |
| 19/02/2022 | 2.5 |
| 19/02/2022 | 2.6 |
| 19/02/2022 | 2.9 |
| 19/02/2022 | 3.2 |
| 19/02/2022 | 3.7 |
| 19/02/2022 | 4.1 |
| 19/02/2022 | 4.4 |
| 19/02/2022 | 4.4 |
| 19/02/2022 | 4.4 |
| 19/02/2022 | 4.3 |
| 19/02/2022 | 4.2 |
| 19/02/2022 | 4.1 |
| 19/02/2022 | 4.1 |
| 19/02/2022 | 4.5 |
| 19/02/2022 | 4.8 |
| 19/02/2022 | 4.6 |
| 19/02/2022 | 4.2 |
| 19/02/2022 | 3.7 |
| 19/02/2022 | 3.5 |
| 19/02/2022 | 3.2 |
| 20/02/2022 | 3 |
| 20/02/2022 | 2.7 |
| 20/02/2022 | 2.5 |
| 20/02/2022 | 2.5 |
| 20/02/2022 | 2.4 |
| 20/02/2022 | 2.5 |
| 20/02/2022 | 2.6 |
| 20/02/2022 | 2.8 |
| 20/02/2022 | 3.2 |
| 20/02/2022 | 3.5 |
| 20/02/2022 | 3.8 |
| 20/02/2022 | 3.9 |
| 20/02/2022 | 4 |
| 20/02/2022 | 3.9 |
| 20/02/2022 | 3.8 |
| 20/02/2022 | 3.7 |
| 20/02/2022 | 3.8 |
| 20/02/2022 | 4.2 |
| 20/02/2022 | 4.5 |
| 20/02/2022 | 4.4 |
| 20/02/2022 | 4 |
| 20/02/2022 | 3.7 |
| 20/02/2022 | 3.5 |
| 20/02/2022 | 3.3 |
| 21/02/2022 | 3 |
| 21/02/2022 | 2.6 |
| 21/02/2022 | 2.5 |
| 21/02/2022 | 2.5 |
| 21/02/2022 | 2.7 |
| 21/02/2022 | 3 |
| 21/02/2022 | 3.8 |
| 21/02/2022 | 4.5 |
| 21/02/2022 | 5 |
| 21/02/2022 | 5.2 |
| 21/02/2022 | 5.3 |
| 21/02/2022 | 5.3 |
| 21/02/2022 | 5.3 |
| 21/02/2022 | 5.2 |
| 21/02/2022 | 5.1 |
| 21/02/2022 | 5 |
| 21/02/2022 | 5 |
| 21/02/2022 | 5.5 |
| 21/02/2022 | 5.8 |
| 21/02/2022 | 5.6 |
| 21/02/2022 | 4.9 |
| 21/02/2022 | 4.3 |
| 21/02/2022 | 3.8 |
| 21/02/2022 | 3.5 |
| 22/02/2022 | 3.1 |
| 22/02/2022 | 2.8 |
| 22/02/2022 | 2.6 |
| 22/02/2022 | 2.6 |
| 22/02/2022 | 2.7 |
| 22/02/2022 | 3.1 |
| 22/02/2022 | 3.9 |
| 22/02/2022 | 4.6 |
| 22/02/2022 | 5 |
| 22/02/2022 | 5.2 |
| 22/02/2022 | 5.3 |
| 22/02/2022 | 5.4 |
| 22/02/2022 | 5.4 |
| 22/02/2022 | 5.3 |
| 22/02/2022 | 5.2 |
| 22/02/2022 | 5.1 |
| 22/02/2022 | 5.1 |
| 22/02/2022 | 5.5 |
| 22/02/2022 | 5.8 |
| 22/02/2022 | 5.6 |
| 22/02/2022 | 5 |
| 22/02/2022 | 4.3 |
| 22/02/2022 | 3.9 |
| 22/02/2022 | 3.5 |
| 23/02/2022 | 3.1 |
| 23/02/2022 | 2.8 |
| 23/02/2022 | 2.6 |
| 23/02/2022 | 2.6 |
| 23/02/2022 | 2.7 |
| 23/02/2022 | 3.1 |
| 23/02/2022 | 3.9 |
| 23/02/2022 | 4.6 |
| 23/02/2022 | 5 |
| 23/02/2022 | 5.2 |
| 23/02/2022 | 5.3 |
| 23/02/2022 | 5.4 |
| 23/02/2022 | 5.3 |
| 23/02/2022 | 5.2 |
| 23/02/2022 | 5.1 |
| 23/02/2022 | 5 |
| 23/02/2022 | 5.1 |
| 23/02/2022 | 5.5 |
| 23/02/2022 | 5.8 |
| 23/02/2022 | 5.6 |
| 23/02/2022 | 5 |
| 23/02/2022 | 4.3 |
| 23/02/2022 | 3.8 |
| 23/02/2022 | 3.5 |
| 24/02/2022 | 3.1 |
| 24/02/2022 | 2.8 |
| 24/02/2022 | 2.6 |
| 24/02/2022 | 2.6 |
| 24/02/2022 | 2.7 |
| 24/02/2022 | 3.1 |
| 24/02/2022 | 3.9 |
| 24/02/2022 | 4.6 |
| 24/02/2022 | 5 |
| 24/02/2022 | 5.2 |
| 24/02/2022 | 5.3 |
| 24/02/2022 | 5.3 |
| 24/02/2022 | 5.3 |
| 24/02/2022 | 5.2 |
| 24/02/2022 | 5.1 |
| 24/02/2022 | 5 |
| 24/02/2022 | 5.1 |
| 24/02/2022 | 5.4 |
| 24/02/2022 | 5.7 |
| 24/02/2022 | 5.6 |
| 24/02/2022 | 4.9 |
| 24/02/2022 | 4.3 |
| 24/02/2022 | 3.8 |
| 24/02/2022 | 3.5 |
| 25/02/2022 | 3.1 |
| 25/02/2022 | 2.8 |
| 25/02/2022 | 2.6 |
| 25/02/2022 | 2.6 |
| 25/02/2022 | 2.7 |
| 25/02/2022 | 3.1 |
| 25/02/2022 | 3.8 |
| 25/02/2022 | 4.5 |
| 25/02/2022 | 5 |
| 25/02/2022 | 5.2 |
| 25/02/2022 | 5.3 |
| 25/02/2022 | 5.3 |
| 25/02/2022 | 5.3 |
| 25/02/2022 | 5.1 |
| 25/02/2022 | 5 |
| 25/02/2022 | 4.9 |
| 25/02/2022 | 4.9 |
| 25/02/2022 | 5.2 |
| 25/02/2022 | 5.5 |
| 25/02/2022 | 5.3 |
| 25/02/2022 | 4.7 |
| 25/02/2022 | 4.1 |
| 25/02/2022 | 3.6 |
| 25/02/2022 | 3.4 |
| 26/02/2022 | 3.1 |
| 26/02/2022 | 2.8 |
| 26/02/2022 | 2.6 |
| 26/02/2022 | 2.5 |
| 26/02/2022 | 2.5 |
| 26/02/2022 | 2.6 |
| 26/02/2022 | 2.9 |
| 26/02/2022 | 3.2 |
| 26/02/2022 | 3.6 |
| 26/02/2022 | 4 |
| 26/02/2022 | 4.3 |
| 26/02/2022 | 4.4 |
| 26/02/2022 | 4.3 |
| 26/02/2022 | 4.2 |
| 26/02/2022 | 4.1 |
| 26/02/2022 | 4 |
| 26/02/2022 | 4 |
| 26/02/2022 | 4.3 |
| 26/02/2022 | 4.7 |
| 26/02/2022 | 4.6 |
| 26/02/2022 | 4.1 |
| 26/02/2022 | 3.7 |
| 26/02/2022 | 3.4 |
| 26/02/2022 | 3.2 |
| 27/02/2022 | 2.9 |
| 27/02/2022 | 2.7 |
| 27/02/2022 | 2.5 |
| 27/02/2022 | 2.4 |
| 27/02/2022 | 2.4 |
| 27/02/2022 | 2.4 |
| 27/02/2022 | 2.6 |
| 27/02/2022 | 2.8 |
| 27/02/2022 | 3.1 |
| 27/02/2022 | 3.5 |
| 27/02/2022 | 3.7 |
| 27/02/2022 | 3.9 |
| 27/02/2022 | 3.9 |
| 27/02/2022 | 3.8 |
| 27/02/2022 | 3.7 |
| 27/02/2022 | 3.7 |
| 27/02/2022 | 3.7 |
| 27/02/2022 | 4 |
| 27/02/2022 | 4.4 |
| 27/02/2022 | 4.3 |
| 27/02/2022 | 4 |
| 27/02/2022 | 3.6 |
| 27/02/2022 | 3.4 |
| 27/02/2022 | 3.2 |
| 28/02/2022 | 2.9 |
| 28/02/2022 | 2.6 |
| 28/02/2022 | 2.5 |
| 28/02/2022 | 2.5 |
| 28/02/2022 | 2.6 |
| 28/02/2022 | 3 |
| 28/02/2022 | 3.8 |
| 28/02/2022 | 4.5 |
| 28/02/2022 | 4.9 |
| 28/02/2022 | 5.1 |
| 28/02/2022 | 5.2 |
| 28/02/2022 | 5.2 |
| 28/02/2022 | 5.2 |
| 28/02/2022 | 5.2 |
| 28/02/2022 | 5.1 |
| 28/02/2022 | 4.9 |
| 28/02/2022 | 4.9 |
| 28/02/2022 | 5.3 |
| 28/02/2022 | 5.7 |
| 28/02/2022 | 5.5 |
| 28/02/2022 | 4.9 |
| 28/02/2022 | 4.2 |
| 28/02/2022 | 3.8 |
| 28/02/2022 | 3.4 |
| 01/03/2022 | 3.1 |
| 01/03/2022 | 2.7 |
| 01/03/2022 | 2.6 |
| 01/03/2022 | 2.6 |
| 01/03/2022 | 2.7 |
| 01/03/2022 | 3.1 |
| 01/03/2022 | 3.8 |
| 01/03/2022 | 4.5 |
| 01/03/2022 | 5 |
| 01/03/2022 | 5.2 |
| 01/03/2022 | 5.3 |
| 01/03/2022 | 5.3 |
| 01/03/2022 | 5.3 |
| 01/03/2022 | 5.2 |
| 01/03/2022 | 5.1 |
| 01/03/2022 | 5 |
| 01/03/2022 | 5 |
| 01/03/2022 | 5.3 |
| 01/03/2022 | 5.7 |
| 01/03/2022 | 5.5 |
| 01/03/2022 | 4.9 |
| 01/03/2022 | 4.3 |
| 01/03/2022 | 3.8 |
| 01/03/2022 | 3.4 |
| 02/03/2022 | 3.1 |
| 02/03/2022 | 2.7 |
| 02/03/2022 | 2.6 |
| 02/03/2022 | 2.6 |
| 02/03/2022 | 2.7 |
| 02/03/2022 | 3.1 |
| 02/03/2022 | 3.8 |
| 02/03/2022 | 4.5 |
| 02/03/2022 | 4.9 |
| 02/03/2022 | 5.1 |
| 02/03/2022 | 5.2 |
| 02/03/2022 | 5.3 |
| 02/03/2022 | 5.2 |
| 02/03/2022 | 5.2 |
| 02/03/2022 | 5.1 |
| 02/03/2022 | 5 |
| 02/03/2022 | 5 |
| 02/03/2022 | 5.3 |
| 02/03/2022 | 5.7 |
| 02/03/2022 | 5.6 |
| 02/03/2022 | 4.9 |
| 02/03/2022 | 4.2 |
| 02/03/2022 | 3.8 |
| 02/03/2022 | 3.4 |
| 03/03/2022 | 3.1 |
| 03/03/2022 | 2.7 |
| 03/03/2022 | 2.6 |
| 03/03/2022 | 2.6 |
| 03/03/2022 | 2.7 |
| 03/03/2022 | 3.1 |
| 03/03/2022 | 3.8 |
| 03/03/2022 | 4.5 |
| 03/03/2022 | 4.9 |
| 03/03/2022 | 5.1 |
| 03/03/2022 | 5.2 |
| 03/03/2022 | 5.3 |
| 03/03/2022 | 5.2 |
| 03/03/2022 | 5.2 |
| 03/03/2022 | 5.1 |
| 03/03/2022 | 5 |
| 03/03/2022 | 5 |
| 03/03/2022 | 5.3 |
| 03/03/2022 | 5.6 |
| 03/03/2022 | 5.5 |
| 03/03/2022 | 4.9 |
| 03/03/2022 | 4.2 |
| 03/03/2022 | 3.8 |
| 03/03/2022 | 3.4 |
| 04/03/2022 | 3.1 |
| 04/03/2022 | 2.7 |
| 04/03/2022 | 2.6 |
| 04/03/2022 | 2.6 |
| 04/03/2022 | 2.7 |
| 04/03/2022 | 3 |
| 04/03/2022 | 3.8 |
| 04/03/2022 | 4.4 |
| 04/03/2022 | 4.9 |
| 04/03/2022 | 5.1 |
| 04/03/2022 | 5.2 |
| 04/03/2022 | 5.2 |
| 04/03/2022 | 5.2 |
| 04/03/2022 | 5 |
| 04/03/2022 | 4.9 |
| 04/03/2022 | 4.8 |
| 04/03/2022 | 4.8 |
| 04/03/2022 | 5.1 |
| 04/03/2022 | 5.3 |
| 04/03/2022 | 5.2 |
| 04/03/2022 | 4.6 |
| 04/03/2022 | 4 |
| 04/03/2022 | 3.6 |
| 04/03/2022 | 3.3 |
| 05/03/2022 | 3 |
| 05/03/2022 | 2.7 |
| 05/03/2022 | 2.6 |
| 05/03/2022 | 2.5 |
| 05/03/2022 | 2.5 |
| 05/03/2022 | 2.6 |
| 05/03/2022 | 2.8 |
| 05/03/2022 | 3.1 |
| 05/03/2022 | 3.6 |
| 05/03/2022 | 4 |
| 05/03/2022 | 4.2 |
| 05/03/2022 | 4.3 |
| 05/03/2022 | 4.3 |
| 05/03/2022 | 4.1 |
| 05/03/2022 | 4 |
| 05/03/2022 | 4 |
| 05/03/2022 | 4 |
| 05/03/2022 | 4.2 |
| 05/03/2022 | 4.6 |
| 05/03/2022 | 4.5 |
| 05/03/2022 | 4.1 |
| 05/03/2022 | 3.7 |
| 05/03/2022 | 3.4 |
| 05/03/2022 | 3.1 |
| 06/03/2022 | 2.9 |
| 06/03/2022 | 2.6 |
| 06/03/2022 | 2.5 |
| 06/03/2022 | 2.4 |
| 06/03/2022 | 2.4 |
| 06/03/2022 | 2.4 |
| 06/03/2022 | 2.5 |
| 06/03/2022 | 2.7 |
| 06/03/2022 | 3.1 |
| 06/03/2022 | 3.4 |
| 06/03/2022 | 3.6 |
| 06/03/2022 | 3.8 |
| 06/03/2022 | 3.8 |
| 06/03/2022 | 3.8 |
| 06/03/2022 | 3.7 |
| 06/03/2022 | 3.6 |
| 06/03/2022 | 3.6 |
| 06/03/2022 | 3.9 |
| 06/03/2022 | 4.3 |
| 06/03/2022 | 4.3 |
| 06/03/2022 | 3.9 |
| 06/03/2022 | 3.6 |
| 06/03/2022 | 3.4 |
| 06/03/2022 | 3.2 |
| 07/03/2022 | 2.8 |
| 07/03/2022 | 2.5 |
| 07/03/2022 | 2.4 |
| 07/03/2022 | 2.3 |
| 07/03/2022 | 2.4 |
| 07/03/2022 | 2.6 |
| 07/03/2022 | 3 |
| 07/03/2022 | 3.3 |
| 07/03/2022 | 3.7 |
| 07/03/2022 | 4 |
| 07/03/2022 | 4.2 |
| 07/03/2022 | 4.3 |
| 07/03/2022 | 4.3 |
| 07/03/2022 | 4.2 |
| 07/03/2022 | 4.1 |
| 07/03/2022 | 4 |
| 07/03/2022 | 4 |
| 07/03/2022 | 4.3 |
| 07/03/2022 | 4.7 |
| 07/03/2022 | 4.6 |
| 07/03/2022 | 4.2 |
| 07/03/2022 | 3.7 |
| 07/03/2022 | 3.3 |
| 07/03/2022 | 3.1 |
| 08/03/2022 | 2.9 |
| 08/03/2022 | 2.7 |
| 08/03/2022 | 2.5 |
| 08/03/2022 | 2.4 |
| 08/03/2022 | 2.4 |
| 08/03/2022 | 2.5 |
| 08/03/2022 | 2.6 |
| 08/03/2022 | 2.9 |
| 08/03/2022 | 3.3 |
| 08/03/2022 | 3.6 |
| 08/03/2022 | 3.8 |
| 08/03/2022 | 3.9 |
| 08/03/2022 | 3.9 |
| 08/03/2022 | 3.8 |
| 08/03/2022 | 3.7 |
| 08/03/2022 | 3.6 |
| 08/03/2022 | 3.6 |
| 08/03/2022 | 3.8 |
| 08/03/2022 | 4.1 |
| 08/03/2022 | 4.1 |
| 08/03/2022 | 3.8 |
| 08/03/2022 | 3.5 |
| 08/03/2022 | 3.3 |
| 08/03/2022 | 3 |
| 09/03/2022 | 3 |
| 09/03/2022 | 2.7 |
| 09/03/2022 | 2.6 |
| 09/03/2022 | 2.5 |
| 09/03/2022 | 2.7 |
| 09/03/2022 | 3 |
| 09/03/2022 | 3.8 |
| 09/03/2022 | 4.4 |
| 09/03/2022 | 4.9 |
| 09/03/2022 | 5.1 |
| 09/03/2022 | 5.2 |
| 09/03/2022 | 5.2 |
| 09/03/2022 | 5.2 |
| 09/03/2022 | 5.1 |
| 09/03/2022 | 5 |
| 09/03/2022 | 4.9 |
| 09/03/2022 | 4.9 |
| 09/03/2022 | 5.2 |
| 09/03/2022 | 5.5 |
| 09/03/2022 | 5.5 |
| 09/03/2022 | 4.9 |
| 09/03/2022 | 4.2 |
| 09/03/2022 | 3.7 |
| 09/03/2022 | 3.4 |
| 10/03/2022 | 3 |
| 10/03/2022 | 2.7 |
| 10/03/2022 | 2.6 |
| 10/03/2022 | 2.5 |
| 10/03/2022 | 2.7 |
| 10/03/2022 | 3 |
| 10/03/2022 | 3.8 |
| 10/03/2022 | 4.4 |
| 10/03/2022 | 4.9 |
| 10/03/2022 | 5 |
| 10/03/2022 | 5.2 |
| 10/03/2022 | 5.2 |
| 10/03/2022 | 5.2 |
| 10/03/2022 | 5.1 |
| 10/03/2022 | 5 |
| 10/03/2022 | 4.9 |
| 10/03/2022 | 4.9 |
| 10/03/2022 | 5.1 |
| 10/03/2022 | 5.5 |
| 10/03/2022 | 5.4 |
| 10/03/2022 | 4.8 |
| 10/03/2022 | 4.2 |
| 10/03/2022 | 3.7 |
| 10/03/2022 | 3.4 |
| 11/03/2022 | 3 |
| 11/03/2022 | 2.7 |
| 11/03/2022 | 2.6 |
| 11/03/2022 | 2.5 |
| 11/03/2022 | 2.7 |
| 11/03/2022 | 3 |
| 11/03/2022 | 3.7 |
| 11/03/2022 | 4.4 |
| 11/03/2022 | 4.8 |
| 11/03/2022 | 5 |
| 11/03/2022 | 5.1 |
| 11/03/2022 | 5.1 |
| 11/03/2022 | 5.1 |
| 11/03/2022 | 5 |
| 11/03/2022 | 4.9 |
| 11/03/2022 | 4.8 |
| 11/03/2022 | 4.7 |
| 11/03/2022 | 4.9 |
| 11/03/2022 | 5.2 |
| 11/03/2022 | 5.1 |
| 11/03/2022 | 4.6 |
| 11/03/2022 | 4 |
| 11/03/2022 | 3.5 |
| 11/03/2022 | 3.3 |
| 12/03/2022 | 3 |
| 12/03/2022 | 2.7 |
| 12/03/2022 | 2.6 |
| 12/03/2022 | 2.5 |
| 12/03/2022 | 2.5 |
| 12/03/2022 | 2.6 |
| 12/03/2022 | 2.8 |
| 12/03/2022 | 3.1 |
| 12/03/2022 | 3.5 |
| 12/03/2022 | 3.9 |
| 12/03/2022 | 4.1 |
| 12/03/2022 | 4.2 |
| 12/03/2022 | 4.2 |
| 12/03/2022 | 4.1 |
| 12/03/2022 | 4 |
| 12/03/2022 | 3.9 |
| 12/03/2022 | 3.9 |
| 12/03/2022 | 4.1 |
| 12/03/2022 | 4.4 |
| 12/03/2022 | 4.5 |
| 12/03/2022 | 4.1 |
| 12/03/2022 | 3.6 |
| 12/03/2022 | 3.3 |
| 12/03/2022 | 3.1 |
| 13/03/2022 | 2.8 |
| 13/03/2022 | 2.6 |
| 13/03/2022 | 2.5 |
| 13/03/2022 | 2.4 |
| 13/03/2022 | 2.3 |
| 13/03/2022 | 2.4 |
| 13/03/2022 | 2.5 |
| 13/03/2022 | 2.7 |
| 13/03/2022 | 3 |
| 13/03/2022 | 3.3 |
| 13/03/2022 | 3.6 |
| 13/03/2022 | 3.7 |
| 13/03/2022 | 3.8 |
| 13/03/2022 | 3.7 |
| 13/03/2022 | 3.6 |
| 13/03/2022 | 3.5 |
| 13/03/2022 | 3.6 |
| 13/03/2022 | 3.8 |
| 13/03/2022 | 4.2 |
| 13/03/2022 | 4.2 |
| 13/03/2022 | 3.9 |
| 13/03/2022 | 3.6 |
| 13/03/2022 | 3.3 |
| 13/03/2022 | 3.1 |
| 14/03/2022 | 2.8 |
| 14/03/2022 | 2.6 |
| 14/03/2022 | 2.4 |
| 14/03/2022 | 2.4 |
| 14/03/2022 | 2.6 |
| 14/03/2022 | 2.9 |
| 14/03/2022 | 3.7 |
| 14/03/2022 | 4.3 |
| 14/03/2022 | 4.7 |
| 14/03/2022 | 4.9 |
| 14/03/2022 | 5.1 |
| 14/03/2022 | 5.1 |
| 14/03/2022 | 5.1 |
| 14/03/2022 | 5 |
| 14/03/2022 | 4.9 |
| 14/03/2022 | 4.8 |
| 14/03/2022 | 4.8 |
| 14/03/2022 | 5 |
| 14/03/2022 | 5.4 |
| 14/03/2022 | 5.4 |
| 14/03/2022 | 4.8 |
| 14/03/2022 | 4.1 |
| 14/03/2022 | 3.7 |
| 14/03/2022 | 3.3 |
| 15/03/2022 | 3 |
| 15/03/2022 | 2.7 |
| 15/03/2022 | 2.5 |
| 15/03/2022 | 2.5 |
| 15/03/2022 | 2.6 |
| 15/03/2022 | 3 |
| 15/03/2022 | 3.7 |
| 15/03/2022 | 4.4 |
| 15/03/2022 | 4.8 |
| 15/03/2022 | 5 |
| 15/03/2022 | 5.1 |
| 15/03/2022 | 5.1 |
| 15/03/2022 | 5.1 |
| 15/03/2022 | 5 |
| 15/03/2022 | 4.9 |
| 15/03/2022 | 4.9 |
| 15/03/2022 | 4.8 |
| 15/03/2022 | 5 |
| 15/03/2022 | 5.4 |
| 15/03/2022 | 5.4 |
| 15/03/2022 | 4.8 |
| 15/03/2022 | 4.2 |
| 15/03/2022 | 3.7 |
| 15/03/2022 | 3.3 |
| 16/03/2022 | 3 |
| 16/03/2022 | 2.7 |
| 16/03/2022 | 2.5 |
| 16/03/2022 | 2.5 |
| 16/03/2022 | 2.7 |
| 16/03/2022 | 3 |
| 16/03/2022 | 3.7 |
| 16/03/2022 | 4.4 |
| 16/03/2022 | 4.8 |
| 16/03/2022 | 5 |
| 16/03/2022 | 5.1 |
| 16/03/2022 | 5.1 |
| 16/03/2022 | 5.1 |
| 16/03/2022 | 5 |
| 16/03/2022 | 4.9 |
| 16/03/2022 | 4.8 |
| 16/03/2022 | 4.8 |
| 16/03/2022 | 5 |
| 16/03/2022 | 5.4 |
| 16/03/2022 | 5.4 |
| 16/03/2022 | 4.8 |
| 16/03/2022 | 4.2 |
| 16/03/2022 | 3.7 |
| 16/03/2022 | 3.3 |
| 17/03/2022 | 3 |
| 17/03/2022 | 2.7 |
| 17/03/2022 | 2.5 |
| 17/03/2022 | 2.5 |
| 17/03/2022 | 2.6 |
| 17/03/2022 | 3 |
| 17/03/2022 | 3.7 |
| 17/03/2022 | 4.4 |
| 17/03/2022 | 4.8 |
| 17/03/2022 | 5 |
| 17/03/2022 | 5.1 |
| 17/03/2022 | 5.1 |
| 17/03/2022 | 5.1 |
| 17/03/2022 | 5 |
| 17/03/2022 | 4.9 |
| 17/03/2022 | 4.8 |
| 17/03/2022 | 4.8 |
| 17/03/2022 | 5 |
| 17/03/2022 | 5.3 |
| 17/03/2022 | 5.3 |
| 17/03/2022 | 4.8 |
| 17/03/2022 | 4.1 |
| 17/03/2022 | 3.6 |
| 17/03/2022 | 3.3 |
| 18/03/2022 | 3 |
| 18/03/2022 | 2.7 |
| 18/03/2022 | 2.5 |
| 18/03/2022 | 2.5 |
| 18/03/2022 | 2.6 |
| 18/03/2022 | 3 |
| 18/03/2022 | 3.7 |
| 18/03/2022 | 4.3 |
| 18/03/2022 | 4.7 |
| 18/03/2022 | 4.9 |
| 18/03/2022 | 5.1 |
| 18/03/2022 | 5.1 |
| 18/03/2022 | 5 |
| 18/03/2022 | 4.9 |
| 18/03/2022 | 4.8 |
| 18/03/2022 | 4.7 |
| 18/03/2022 | 4.7 |
| 18/03/2022 | 4.8 |
| 18/03/2022 | 5.1 |
| 18/03/2022 | 5.1 |
| 18/03/2022 | 4.5 |
| 18/03/2022 | 3.9 |
| 18/03/2022 | 3.5 |
| 18/03/2022 | 3.2 |
| 19/03/2022 | 2.9 |
| 19/03/2022 | 2.7 |
| 19/03/2022 | 2.5 |
| 19/03/2022 | 2.4 |
| 19/03/2022 | 2.4 |
| 19/03/2022 | 2.5 |
| 19/03/2022 | 2.7 |
| 19/03/2022 | 3 |
| 19/03/2022 | 3.5 |
| 19/03/2022 | 3.8 |
| 19/03/2022 | 4.1 |
| 19/03/2022 | 4.2 |
| 19/03/2022 | 4.1 |
| 19/03/2022 | 4 |
| 19/03/2022 | 3.9 |
| 19/03/2022 | 3.8 |
| 19/03/2022 | 3.8 |
| 19/03/2022 | 4 |
| 19/03/2022 | 4.3 |
| 19/03/2022 | 4.4 |
| 19/03/2022 | 4 |
| 19/03/2022 | 3.6 |
| 19/03/2022 | 3.2 |
| 19/03/2022 | 3 |
| 20/03/2022 | 2.8 |
| 20/03/2022 | 2.6 |
| 20/03/2022 | 2.4 |
| 20/03/2022 | 2.3 |
| 20/03/2022 | 2.3 |
| 20/03/2022 | 2.4 |
| 20/03/2022 | 2.4 |
| 20/03/2022 | 2.6 |
| 20/03/2022 | 3 |
| 20/03/2022 | 3.3 |
| 20/03/2022 | 3.5 |
| 20/03/2022 | 3.7 |
| 20/03/2022 | 3.7 |
| 20/03/2022 | 3.6 |
| 20/03/2022 | 3.6 |
| 20/03/2022 | 3.5 |
| 20/03/2022 | 3.5 |
| 20/03/2022 | 3.7 |
| 20/03/2022 | 4.1 |
| 20/03/2022 | 4.1 |
| 20/03/2022 | 3.9 |
| 20/03/2022 | 3.5 |
| 20/03/2022 | 3.3 |
| 20/03/2022 | 3.1 |
| 21/03/2022 | 2.8 |
| 21/03/2022 | 2.5 |
| 21/03/2022 | 2.4 |
| 21/03/2022 | 2.4 |
| 21/03/2022 | 2.5 |
| 21/03/2022 | 2.9 |
| 21/03/2022 | 3.6 |
| 21/03/2022 | 4.2 |
| 21/03/2022 | 4.7 |
| 21/03/2022 | 4.9 |
| 21/03/2022 | 5 |
| 21/03/2022 | 5 |
| 21/03/2022 | 5 |
| 21/03/2022 | 4.9 |
| 21/03/2022 | 4.8 |
| 21/03/2022 | 4.7 |
| 21/03/2022 | 4.7 |
| 21/03/2022 | 4.9 |
| 21/03/2022 | 5.3 |
| 21/03/2022 | 5.3 |
| 21/03/2022 | 4.8 |
| 21/03/2022 | 4.1 |
| 21/03/2022 | 3.6 |
| 21/03/2022 | 3.3 |
| 22/03/2022 | 2.9 |
| 22/03/2022 | 2.6 |
| 22/03/2022 | 2.5 |
| 22/03/2022 | 2.5 |
| 22/03/2022 | 2.6 |
| 22/03/2022 | 3 |
| 22/03/2022 | 3.7 |
| 22/03/2022 | 4.3 |
| 22/03/2022 | 4.7 |
| 22/03/2022 | 4.9 |
| 22/03/2022 | 5 |
| 22/03/2022 | 5 |
| 22/03/2022 | 5 |
| 22/03/2022 | 5 |
| 22/03/2022 | 4.9 |
| 22/03/2022 | 4.8 |
| 22/03/2022 | 4.8 |
| 22/03/2022 | 4.9 |
| 22/03/2022 | 5.3 |
| 22/03/2022 | 5.3 |
| 22/03/2022 | 4.8 |
| 22/03/2022 | 4.1 |
| 22/03/2022 | 3.6 |
| 22/03/2022 | 3.3 |
| 23/03/2022 | 2.9 |
| 23/03/2022 | 2.6 |
| 23/03/2022 | 2.5 |
| 23/03/2022 | 2.5 |
| 23/03/2022 | 2.6 |
| 23/03/2022 | 3 |
| 23/03/2022 | 3.7 |
| 23/03/2022 | 4.3 |
| 23/03/2022 | 4.7 |
| 23/03/2022 | 4.9 |
| 23/03/2022 | 5 |
| 23/03/2022 | 5 |
| 23/03/2022 | 5 |
| 23/03/2022 | 4.9 |
| 23/03/2022 | 4.9 |
| 23/03/2022 | 4.8 |
| 23/03/2022 | 4.7 |
| 23/03/2022 | 4.9 |
| 23/03/2022 | 5.3 |
| 23/03/2022 | 5.3 |
| 23/03/2022 | 4.8 |
| 23/03/2022 | 4.1 |
| 23/03/2022 | 3.6 |
| 23/03/2022 | 3.3 |
| 24/03/2022 | 2.9 |
| 24/03/2022 | 2.6 |
| 24/03/2022 | 2.5 |
| 24/03/2022 | 2.5 |
| 24/03/2022 | 2.6 |
| 24/03/2022 | 3 |
| 24/03/2022 | 3.7 |
| 24/03/2022 | 4.3 |
| 24/03/2022 | 4.7 |
| 24/03/2022 | 4.9 |
| 24/03/2022 | 5 |
| 24/03/2022 | 5 |
| 24/03/2022 | 5 |
| 24/03/2022 | 4.9 |
| 24/03/2022 | 4.9 |
| 24/03/2022 | 4.8 |
| 24/03/2022 | 4.7 |
| 24/03/2022 | 4.8 |
| 24/03/2022 | 5.2 |
| 24/03/2022 | 5.3 |
| 24/03/2022 | 4.7 |
| 24/03/2022 | 4.1 |
| 24/03/2022 | 3.6 |
| 24/03/2022 | 3.2 |
| 25/03/2022 | 2.9 |
| 25/03/2022 | 2.6 |
| 25/03/2022 | 2.5 |
| 25/03/2022 | 2.5 |
| 25/03/2022 | 2.6 |
| 25/03/2022 | 2.9 |
| 25/03/2022 | 3.6 |
| 25/03/2022 | 4.2 |
| 25/03/2022 | 4.7 |
| 25/03/2022 | 4.9 |
| 25/03/2022 | 5 |
| 25/03/2022 | 5 |
| 25/03/2022 | 4.9 |
| 25/03/2022 | 4.8 |
| 25/03/2022 | 4.7 |
| 25/03/2022 | 4.6 |
| 25/03/2022 | 4.6 |
| 25/03/2022 | 4.7 |
| 25/03/2022 | 5 |
| 25/03/2022 | 5 |
| 25/03/2022 | 4.5 |
| 25/03/2022 | 3.9 |
| 25/03/2022 | 3.4 |
| 25/03/2022 | 3.1 |
| 26/03/2022 | 2.9 |
| 26/03/2022 | 2.7 |
| 26/03/2022 | 2.5 |
| 26/03/2022 | 2.4 |
| 26/03/2022 | 2.4 |
| 26/03/2022 | 2.5 |
| 26/03/2022 | 2.7 |
| 26/03/2022 | 3 |
| 26/03/2022 | 3.4 |
| 26/03/2022 | 3.8 |
| 26/03/2022 | 4 |
| 26/03/2022 | 4.1 |
| 26/03/2022 | 4.1 |
| 26/03/2022 | 4 |
| 26/03/2022 | 3.9 |
| 26/03/2022 | 3.8 |
| 26/03/2022 | 3.8 |
| 26/03/2022 | 3.9 |
| 26/03/2022 | 4.2 |
| 26/03/2022 | 4.3 |
| 26/03/2022 | 4 |
| 26/03/2022 | 3.5 |
| 26/03/2022 | 3.2 |
| 26/03/2022 | 3 |
| 27/03/2022 | 2.8 |
| 27/03/2022 | 2.6 |
| 27/03/2022 | 0 |
| 27/03/2022 | 2.4 |
| 27/03/2022 | 2.3 |
| 27/03/2022 | 2.4 |
| 27/03/2022 | 2.5 |
| 27/03/2022 | 2.6 |
| 27/03/2022 | 3 |
| 27/03/2022 | 3.3 |
| 27/03/2022 | 3.5 |
| 27/03/2022 | 3.7 |
| 27/03/2022 | 3.8 |
| 27/03/2022 | 3.7 |
| 27/03/2022 | 3.5 |
| 27/03/2022 | 3.5 |
| 27/03/2022 | 3.4 |
| 27/03/2022 | 3.4 |
| 27/03/2022 | 3.7 |
| 27/03/2022 | 3.9 |
| 27/03/2022 | 3.9 |
| 27/03/2022 | 3.6 |
| 27/03/2022 | 3.3 |
| 27/03/2022 | 3.1 |
| 28/03/2022 | 2.8 |
| 28/03/2022 | 2.5 |
| 28/03/2022 | 2.4 |
| 28/03/2022 | 2.4 |
| 28/03/2022 | 2.6 |
| 28/03/2022 | 2.9 |
| 28/03/2022 | 3.6 |
| 28/03/2022 | 4.3 |
| 28/03/2022 | 4.7 |
| 28/03/2022 | 4.9 |
| 28/03/2022 | 5 |
| 28/03/2022 | 5 |
| 28/03/2022 | 5.1 |
| 28/03/2022 | 5 |
| 28/03/2022 | 4.8 |
| 28/03/2022 | 4.7 |
| 28/03/2022 | 4.6 |
| 28/03/2022 | 4.5 |
| 28/03/2022 | 4.9 |
| 28/03/2022 | 5 |
| 28/03/2022 | 4.8 |
| 28/03/2022 | 4.2 |
| 28/03/2022 | 3.7 |
| 28/03/2022 | 3.3 |
| 29/03/2022 | 2.9 |
| 29/03/2022 | 2.6 |
| 29/03/2022 | 2.5 |
| 29/03/2022 | 2.5 |
| 29/03/2022 | 2.6 |
| 29/03/2022 | 3 |
| 29/03/2022 | 3.7 |
| 29/03/2022 | 4.3 |
| 29/03/2022 | 4.8 |
| 29/03/2022 | 4.9 |
| 29/03/2022 | 5 |
| 29/03/2022 | 5.1 |
| 29/03/2022 | 5.1 |
| 29/03/2022 | 5 |
| 29/03/2022 | 4.9 |
| 29/03/2022 | 4.7 |
| 29/03/2022 | 4.6 |
| 29/03/2022 | 4.6 |
| 29/03/2022 | 4.9 |
| 29/03/2022 | 5 |
| 29/03/2022 | 4.8 |
| 29/03/2022 | 4.2 |
| 29/03/2022 | 3.7 |
| 29/03/2022 | 3.3 |
| 30/03/2022 | 2.9 |
| 30/03/2022 | 2.6 |
| 30/03/2022 | 2.5 |
| 30/03/2022 | 2.5 |
| 30/03/2022 | 2.6 |
| 30/03/2022 | 3 |
| 30/03/2022 | 3.7 |
| 30/03/2022 | 4.3 |
| 30/03/2022 | 4.7 |
| 30/03/2022 | 4.9 |
| 30/03/2022 | 5 |
| 30/03/2022 | 5.1 |
| 30/03/2022 | 5.1 |
| 30/03/2022 | 5 |
| 30/03/2022 | 4.8 |
| 30/03/2022 | 4.7 |
| 30/03/2022 | 4.6 |
| 30/03/2022 | 4.6 |
| 30/03/2022 | 4.9 |
| 30/03/2022 | 5 |
| 30/03/2022 | 4.8 |
| 30/03/2022 | 4.2 |
| 30/03/2022 | 3.7 |
| 30/03/2022 | 3.3 |
| 31/03/2022 | 2.9 |
| 31/03/2022 | 2.6 |
| 31/03/2022 | 2.5 |
| 31/03/2022 | 2.5 |
| 31/03/2022 | 2.6 |
| 31/03/2022 | 3 |
| 31/03/2022 | 3.7 |
| 31/03/2022 | 4.3 |
| 31/03/2022 | 4.7 |
| 31/03/2022 | 4.9 |
| 31/03/2022 | 5 |
| 31/03/2022 | 5 |
| 31/03/2022 | 5.1 |
| 31/03/2022 | 5 |
| 31/03/2022 | 4.8 |
| 31/03/2022 | 4.7 |
| 31/03/2022 | 4.6 |
| 31/03/2022 | 4.6 |
| 31/03/2022 | 4.8 |
| 31/03/2022 | 5 |
| 31/03/2022 | 4.8 |
| 31/03/2022 | 4.2 |
| 31/03/2022 | 3.6 |
| 31/03/2022 | 3.3 |
| 01/04/2022 | 2.9 |
| 01/04/2022 | 2.6 |
| 01/04/2022 | 2.5 |
| 01/04/2022 | 2.5 |
| 01/04/2022 | 2.6 |
| 01/04/2022 | 3 |
| 01/04/2022 | 3.6 |
| 01/04/2022 | 4.2 |
| 01/04/2022 | 4.7 |
| 01/04/2022 | 4.9 |
| 01/04/2022 | 5 |
| 01/04/2022 | 5 |
| 01/04/2022 | 5 |
| 01/04/2022 | 4.9 |
| 01/04/2022 | 4.7 |
| 01/04/2022 | 4.6 |
| 01/04/2022 | 4.5 |
| 01/04/2022 | 4.4 |
| 01/04/2022 | 4.6 |
| 01/04/2022 | 4.7 |
| 01/04/2022 | 4.5 |
| 01/04/2022 | 4 |
| 01/04/2022 | 3.5 |
| 01/04/2022 | 3.2 |
| 02/04/2022 | 2.9 |
| 02/04/2022 | 2.7 |
| 02/04/2022 | 2.5 |
| 02/04/2022 | 2.4 |
| 02/04/2022 | 2.4 |
| 02/04/2022 | 2.5 |
| 02/04/2022 | 2.7 |
| 02/04/2022 | 3 |
| 02/04/2022 | 3.4 |
| 02/04/2022 | 3.8 |
| 02/04/2022 | 4 |
| 02/04/2022 | 4.1 |
| 02/04/2022 | 4.1 |
| 02/04/2022 | 4 |
| 02/04/2022 | 3.8 |
| 02/04/2022 | 3.8 |
| 02/04/2022 | 3.7 |
| 02/04/2022 | 3.6 |
| 02/04/2022 | 3.9 |
| 02/04/2022 | 4.1 |
| 02/04/2022 | 4 |
| 02/04/2022 | 3.6 |
| 02/04/2022 | 3.3 |
| 02/04/2022 | 3 |
| 03/04/2022 | 2.8 |
| 03/04/2022 | 2.6 |
| 03/04/2022 | 2.4 |
| 03/04/2022 | 2.3 |
| 03/04/2022 | 2.3 |
| 03/04/2022 | 2.3 |
| 03/04/2022 | 2.4 |
| 03/04/2022 | 2.6 |
| 03/04/2022 | 2.9 |
| 03/04/2022 | 3.2 |
| 03/04/2022 | 3.5 |
| 03/04/2022 | 3.6 |
| 03/04/2022 | 3.7 |
| 03/04/2022 | 3.6 |
| 03/04/2022 | 3.5 |
| 03/04/2022 | 3.4 |
| 03/04/2022 | 3.4 |
| 03/04/2022 | 3.4 |
| 03/04/2022 | 3.7 |
| 03/04/2022 | 3.8 |
| 03/04/2022 | 3.8 |
| 03/04/2022 | 3.5 |
| 03/04/2022 | 3.3 |
| 03/04/2022 | 3 |
| 04/04/2022 | 2.7 |
| 04/04/2022 | 2.5 |
| 04/04/2022 | 2.4 |
| 04/04/2022 | 2.4 |
| 04/04/2022 | 2.5 |
| 04/04/2022 | 2.9 |
| 04/04/2022 | 3.6 |
| 04/04/2022 | 4.2 |
| 04/04/2022 | 4.6 |
| 04/04/2022 | 4.8 |
| 04/04/2022 | 4.9 |
| 04/04/2022 | 5 |
| 04/04/2022 | 5 |
| 04/04/2022 | 4.9 |
| 04/04/2022 | 4.8 |
| 04/04/2022 | 4.6 |
| 04/04/2022 | 4.5 |
| 04/04/2022 | 4.5 |
| 04/04/2022 | 4.8 |
| 04/04/2022 | 4.9 |
| 04/04/2022 | 4.7 |
| 04/04/2022 | 4.1 |
| 04/04/2022 | 3.6 |
| 04/04/2022 | 3.2 |
| 05/04/2022 | 2.9 |
| 05/04/2022 | 2.6 |
| 05/04/2022 | 2.5 |
| 05/04/2022 | 2.5 |
| 05/04/2022 | 2.6 |
| 05/04/2022 | 3 |
| 05/04/2022 | 3.6 |
| 05/04/2022 | 4.3 |
| 05/04/2022 | 4.7 |
| 05/04/2022 | 4.9 |
| 05/04/2022 | 5 |
| 05/04/2022 | 5 |
| 05/04/2022 | 5 |
| 05/04/2022 | 4.9 |
| 05/04/2022 | 4.8 |
| 05/04/2022 | 4.7 |
| 05/04/2022 | 4.6 |
| 05/04/2022 | 4.6 |
| 05/04/2022 | 4.8 |
| 05/04/2022 | 4.9 |
| 05/04/2022 | 4.7 |
| 05/04/2022 | 4.2 |
| 05/04/2022 | 3.6 |
| 05/04/2022 | 3.3 |
| 06/04/2022 | 2.9 |
| 06/04/2022 | 2.6 |
| 06/04/2022 | 2.5 |
| 06/04/2022 | 2.5 |
| 06/04/2022 | 2.6 |
| 06/04/2022 | 3 |
| 06/04/2022 | 3.6 |
| 06/04/2022 | 4.3 |
| 06/04/2022 | 4.7 |
| 06/04/2022 | 4.9 |
| 06/04/2022 | 5 |
| 06/04/2022 | 5 |
| 06/04/2022 | 5 |
| 06/04/2022 | 4.9 |
| 06/04/2022 | 4.8 |
| 06/04/2022 | 4.7 |
| 06/04/2022 | 4.6 |
| 06/04/2022 | 4.6 |
| 06/04/2022 | 4.8 |
| 06/04/2022 | 4.9 |
| 06/04/2022 | 4.7 |
| 06/04/2022 | 4.1 |
| 06/04/2022 | 3.6 |
| 06/04/2022 | 3.3 |
| 07/04/2022 | 2.9 |
| 07/04/2022 | 2.6 |
| 07/04/2022 | 2.5 |
| 07/04/2022 | 2.5 |
| 07/04/2022 | 2.6 |
| 07/04/2022 | 2.9 |
| 07/04/2022 | 3.6 |
| 07/04/2022 | 4.2 |
| 07/04/2022 | 4.7 |
| 07/04/2022 | 4.8 |
| 07/04/2022 | 5 |
| 07/04/2022 | 5 |
| 07/04/2022 | 5 |
| 07/04/2022 | 4.9 |
| 07/04/2022 | 4.8 |
| 07/04/2022 | 4.7 |
| 07/04/2022 | 4.6 |
| 07/04/2022 | 4.5 |
| 07/04/2022 | 4.8 |
| 07/04/2022 | 4.9 |
| 07/04/2022 | 4.7 |
| 07/04/2022 | 4.1 |
| 07/04/2022 | 3.6 |
| 07/04/2022 | 3.2 |
| 08/04/2022 | 2.9 |
| 08/04/2022 | 2.6 |
| 08/04/2022 | 2.5 |
| 08/04/2022 | 2.5 |
| 08/04/2022 | 2.6 |
| 08/04/2022 | 2.9 |
| 08/04/2022 | 3.6 |
| 08/04/2022 | 4.2 |
| 08/04/2022 | 4.6 |
| 08/04/2022 | 4.8 |
| 08/04/2022 | 4.9 |
| 08/04/2022 | 4.9 |
| 08/04/2022 | 4.9 |
| 08/04/2022 | 4.8 |
| 08/04/2022 | 4.7 |
| 08/04/2022 | 4.5 |
| 08/04/2022 | 4.4 |
| 08/04/2022 | 4.4 |
| 08/04/2022 | 4.5 |
| 08/04/2022 | 4.6 |
| 08/04/2022 | 4.4 |
| 08/04/2022 | 3.9 |
| 08/04/2022 | 3.4 |
| 08/04/2022 | 3.1 |
| 09/04/2022 | 2.8 |
| 09/04/2022 | 2.6 |
| 09/04/2022 | 2.5 |
| 09/04/2022 | 2.4 |
| 09/04/2022 | 2.4 |
| 09/04/2022 | 2.5 |
| 09/04/2022 | 2.6 |
| 09/04/2022 | 2.9 |
| 09/04/2022 | 3.4 |
| 09/04/2022 | 3.7 |
| 09/04/2022 | 4 |
| 09/04/2022 | 4.1 |
| 09/04/2022 | 4.1 |
| 09/04/2022 | 3.9 |
| 09/04/2022 | 3.8 |
| 09/04/2022 | 3.7 |
| 09/04/2022 | 3.6 |
| 09/04/2022 | 3.6 |
| 09/04/2022 | 3.8 |
| 09/04/2022 | 4 |
| 09/04/2022 | 3.9 |
| 09/04/2022 | 3.6 |
| 09/04/2022 | 3.2 |
| 09/04/2022 | 3 |
| 10/04/2022 | 2.7 |
| 10/04/2022 | 2.5 |
| 10/04/2022 | 2.4 |
| 10/04/2022 | 2.3 |
| 10/04/2022 | 2.3 |
| 10/04/2022 | 2.3 |
| 10/04/2022 | 2.4 |
| 10/04/2022 | 2.6 |
| 10/04/2022 | 2.9 |
| 10/04/2022 | 3.2 |
| 10/04/2022 | 3.4 |
| 10/04/2022 | 3.6 |
| 10/04/2022 | 3.7 |
| 10/04/2022 | 3.6 |
| 10/04/2022 | 3.4 |
| 10/04/2022 | 3.4 |
| 10/04/2022 | 3.3 |
| 10/04/2022 | 3.4 |
| 10/04/2022 | 3.6 |
| 10/04/2022 | 3.7 |
| 10/04/2022 | 3.7 |
| 10/04/2022 | 3.5 |
| 10/04/2022 | 3.2 |
| 10/04/2022 | 3 |
| 10/04/2022 | 2.7 |
| 11/04/2022 | 2.5 |
| 11/04/2022 | 2.4 |
| 11/04/2022 | 2.3 |
| 11/04/2022 | 2.5 |
| 11/04/2022 | 2.8 |
| 11/04/2022 | 3.3 |
| 11/04/2022 | 3.9 |
| 11/04/2022 | 4.4 |
| 11/04/2022 | 4.6 |
| 11/04/2022 | 4.7 |
| 11/04/2022 | 4.8 |
| 11/04/2022 | 4.8 |
| 11/04/2022 | 4.7 |
| 11/04/2022 | 4.6 |
| 11/04/2022 | 4.5 |
| 11/04/2022 | 4.4 |
| 11/04/2022 | 4.4 |
| 11/04/2022 | 4.6 |
| 11/04/2022 | 4.6 |
| 11/04/2022 | 4.5 |
| 11/04/2022 | 4 |
| 11/04/2022 | 3.5 |
| 11/04/2022 | 3.2 |
| 11/04/2022 | 2.8 |
| 12/04/2022 | 2.6 |
| 12/04/2022 | 2.4 |
| 12/04/2022 | 2.4 |
| 12/04/2022 | 2.5 |
| 12/04/2022 | 2.9 |
| 12/04/2022 | 3.4 |
| 12/04/2022 | 4 |
| 12/04/2022 | 4.4 |
| 12/04/2022 | 4.6 |
| 12/04/2022 | 4.8 |
| 12/04/2022 | 4.8 |
| 12/04/2022 | 4.8 |
| 12/04/2022 | 4.8 |
| 12/04/2022 | 4.6 |
| 12/04/2022 | 4.5 |
| 12/04/2022 | 4.4 |
| 12/04/2022 | 4.4 |
| 12/04/2022 | 4.6 |
| 12/04/2022 | 4.6 |
| 12/04/2022 | 4.5 |
| 12/04/2022 | 4 |
| 12/04/2022 | 3.5 |
| 12/04/2022 | 3.2 |
| 12/04/2022 | 2.8 |
| 13/04/2022 | 2.6 |
| 13/04/2022 | 2.4 |
| 13/04/2022 | 2.4 |
| 13/04/2022 | 2.6 |
| 13/04/2022 | 2.9 |
| 13/04/2022 | 3.4 |
| 13/04/2022 | 4 |
| 13/04/2022 | 4.4 |
| 13/04/2022 | 4.6 |
| 13/04/2022 | 4.8 |
| 13/04/2022 | 4.8 |
| 13/04/2022 | 4.8 |
| 13/04/2022 | 4.7 |
| 13/04/2022 | 4.6 |
| 13/04/2022 | 4.5 |
| 13/04/2022 | 4.4 |
| 13/04/2022 | 4.4 |
| 13/04/2022 | 4.6 |
| 13/04/2022 | 4.6 |
| 13/04/2022 | 4.5 |
| 13/04/2022 | 4 |
| 13/04/2022 | 3.5 |
| 13/04/2022 | 3.2 |
| 13/04/2022 | 2.8 |
| 14/04/2022 | 2.6 |
| 14/04/2022 | 2.4 |
| 14/04/2022 | 2.4 |
| 14/04/2022 | 2.5 |
| 14/04/2022 | 2.9 |
| 14/04/2022 | 3.4 |
| 14/04/2022 | 4 |
| 14/04/2022 | 4.4 |
| 14/04/2022 | 4.6 |
| 14/04/2022 | 4.8 |
| 14/04/2022 | 4.8 |
| 14/04/2022 | 4.8 |
| 14/04/2022 | 4.7 |
| 14/04/2022 | 4.6 |
| 14/04/2022 | 4.5 |
| 14/04/2022 | 4.4 |
| 14/04/2022 | 4.4 |
| 14/04/2022 | 4.5 |
| 14/04/2022 | 4.6 |
| 14/04/2022 | 4.4 |
| 14/04/2022 | 4 |
| 14/04/2022 | 3.5 |
| 14/04/2022 | 3.2 |
| 14/04/2022 | 2.7 |
| 15/04/2022 | 2.5 |
| 15/04/2022 | 2.4 |
| 15/04/2022 | 2.3 |
| 15/04/2022 | 2.3 |
| 15/04/2022 | 2.3 |
| 15/04/2022 | 2.3 |
| 15/04/2022 | 2.5 |
| 15/04/2022 | 2.9 |
| 15/04/2022 | 3.3 |
| 15/04/2022 | 3.5 |
| 15/04/2022 | 3.6 |
| 15/04/2022 | 3.6 |
| 15/04/2022 | 3.5 |
| 15/04/2022 | 3.4 |
| 15/04/2022 | 3.2 |
| 15/04/2022 | 3.2 |
| 15/04/2022 | 3.2 |
| 15/04/2022 | 3.3 |
| 15/04/2022 | 3.4 |
| 15/04/2022 | 3.5 |
| 15/04/2022 | 3.3 |
| 15/04/2022 | 3.1 |
| 15/04/2022 | 2.8 |
| 15/04/2022 | 2.8 |
| 16/04/2022 | 2.6 |
| 16/04/2022 | 2.4 |
| 16/04/2022 | 2.4 |
| 16/04/2022 | 2.3 |
| 16/04/2022 | 2.4 |
| 16/04/2022 | 2.5 |
| 16/04/2022 | 2.7 |
| 16/04/2022 | 3.2 |
| 16/04/2022 | 3.6 |
| 16/04/2022 | 3.8 |
| 16/04/2022 | 3.9 |
| 16/04/2022 | 3.9 |
| 16/04/2022 | 3.8 |
| 16/04/2022 | 3.6 |
| 16/04/2022 | 3.6 |
| 16/04/2022 | 3.5 |
| 16/04/2022 | 3.5 |
| 16/04/2022 | 3.6 |
| 16/04/2022 | 3.7 |
| 16/04/2022 | 3.7 |
| 16/04/2022 | 3.4 |
| 16/04/2022 | 3.1 |
| 16/04/2022 | 2.9 |
| 16/04/2022 | 2.5 |
| 17/04/2022 | 2.4 |
| 17/04/2022 | 2.3 |
| 17/04/2022 | 2.2 |
| 17/04/2022 | 2.2 |
| 17/04/2022 | 2.2 |
| 17/04/2022 | 2.3 |
| 17/04/2022 | 2.5 |
| 17/04/2022 | 2.8 |
| 17/04/2022 | 3.1 |
| 17/04/2022 | 3.3 |
| 17/04/2022 | 3.3 |
| 17/04/2022 | 3.3 |
| 17/04/2022 | 3.2 |
| 17/04/2022 | 3.1 |
| 17/04/2022 | 3 |
| 17/04/2022 | 3 |
| 17/04/2022 | 3.1 |
| 17/04/2022 | 3.2 |
| 17/04/2022 | 3.2 |
| 17/04/2022 | 3.3 |
| 17/04/2022 | 3.2 |
| 17/04/2022 | 3 |
| 17/04/2022 | 2.7 |
| 17/04/2022 | 2.5 |
| 18/04/2022 | 2.4 |
| 18/04/2022 | 2.3 |
| 18/04/2022 | 2.2 |
| 18/04/2022 | 2.2 |
| 18/04/2022 | 2.2 |
| 18/04/2022 | 2.3 |
| 18/04/2022 | 2.5 |
| 18/04/2022 | 2.8 |
| 18/04/2022 | 3.1 |
| 18/04/2022 | 3.2 |
| 18/04/2022 | 3.3 |
| 18/04/2022 | 3.3 |
| 18/04/2022 | 3.2 |
| 18/04/2022 | 3.1 |
| 18/04/2022 | 3 |
| 18/04/2022 | 3 |
| 18/04/2022 | 3.1 |
| 18/04/2022 | 3.2 |
| 18/04/2022 | 3.2 |
| 18/04/2022 | 3.3 |
| 18/04/2022 | 3.2 |
| 18/04/2022 | 3 |
| 18/04/2022 | 2.7 |
| 18/04/2022 | 2.8 |
| 19/04/2022 | 2.5 |
| 19/04/2022 | 2.4 |
| 19/04/2022 | 2.4 |
| 19/04/2022 | 2.5 |
| 19/04/2022 | 2.8 |
| 19/04/2022 | 3.4 |
| 19/04/2022 | 3.9 |
| 19/04/2022 | 4.4 |
| 19/04/2022 | 4.6 |
| 19/04/2022 | 4.7 |
| 19/04/2022 | 4.8 |
| 19/04/2022 | 4.8 |
| 19/04/2022 | 4.7 |
| 19/04/2022 | 4.6 |
| 19/04/2022 | 4.4 |
| 19/04/2022 | 4.4 |
| 19/04/2022 | 4.4 |
| 19/04/2022 | 4.5 |
| 19/04/2022 | 4.5 |
| 19/04/2022 | 4.4 |
| 19/04/2022 | 4 |
| 19/04/2022 | 3.5 |
| 19/04/2022 | 3.1 |
| 19/04/2022 | 2.8 |
| 20/04/2022 | 2.5 |
| 20/04/2022 | 2.4 |
| 20/04/2022 | 2.4 |
| 20/04/2022 | 2.5 |
| 20/04/2022 | 2.8 |
| 20/04/2022 | 3.4 |
| 20/04/2022 | 3.9 |
| 20/04/2022 | 4.4 |
| 20/04/2022 | 4.6 |
| 20/04/2022 | 4.7 |
| 20/04/2022 | 4.7 |
| 20/04/2022 | 4.8 |
| 20/04/2022 | 4.7 |
| 20/04/2022 | 4.5 |
| 20/04/2022 | 4.4 |
| 20/04/2022 | 4.4 |
| 20/04/2022 | 4.4 |
| 20/04/2022 | 4.5 |
| 20/04/2022 | 4.5 |
| 20/04/2022 | 4.4 |
| 20/04/2022 | 3.9 |
| 20/04/2022 | 3.5 |
| 20/04/2022 | 3.1 |
| 20/04/2022 | 2.8 |
| 21/04/2022 | 2.5 |
| 21/04/2022 | 2.4 |
| 21/04/2022 | 2.4 |
| 21/04/2022 | 2.5 |
| 21/04/2022 | 2.8 |
| 21/04/2022 | 3.3 |
| 21/04/2022 | 3.9 |
| 21/04/2022 | 4.3 |
| 21/04/2022 | 4.6 |
| 21/04/2022 | 4.7 |
| 21/04/2022 | 4.7 |
| 21/04/2022 | 4.8 |
| 21/04/2022 | 4.7 |
| 21/04/2022 | 4.5 |
| 21/04/2022 | 4.4 |
| 21/04/2022 | 4.4 |
| 21/04/2022 | 4.4 |
| 21/04/2022 | 4.5 |
| 21/04/2022 | 4.4 |
| 21/04/2022 | 4.3 |
| 21/04/2022 | 3.9 |
| 21/04/2022 | 3.4 |
| 21/04/2022 | 3.1 |
| 21/04/2022 | 2.8 |
| 22/04/2022 | 2.5 |
| 22/04/2022 | 2.4 |
| 22/04/2022 | 2.4 |
| 22/04/2022 | 2.5 |
| 22/04/2022 | 2.8 |
| 22/04/2022 | 3.3 |
| 22/04/2022 | 3.9 |
| 22/04/2022 | 4.3 |
| 22/04/2022 | 4.5 |
| 22/04/2022 | 4.7 |
| 22/04/2022 | 4.7 |
| 22/04/2022 | 4.7 |
| 22/04/2022 | 4.6 |
| 22/04/2022 | 4.4 |
| 22/04/2022 | 4.3 |
| 22/04/2022 | 4.2 |
| 22/04/2022 | 4.2 |
| 22/04/2022 | 4.2 |
| 22/04/2022 | 4.2 |
| 22/04/2022 | 4.1 |
| 22/04/2022 | 3.7 |
| 22/04/2022 | 3.3 |
| 22/04/2022 | 3 |
| 22/04/2022 | 2.8 |
| 23/04/2022 | 2.6 |
| 23/04/2022 | 2.4 |
| 23/04/2022 | 2.3 |
| 23/04/2022 | 2.3 |
| 23/04/2022 | 2.4 |
| 23/04/2022 | 2.6 |
| 23/04/2022 | 2.8 |
| 23/04/2022 | 3.2 |
| 23/04/2022 | 3.6 |
| 23/04/2022 | 3.9 |
| 23/04/2022 | 3.9 |
| 23/04/2022 | 3.9 |
| 23/04/2022 | 3.8 |
| 23/04/2022 | 3.7 |
| 23/04/2022 | 3.6 |
| 23/04/2022 | 3.6 |
| 23/04/2022 | 3.6 |
| 23/04/2022 | 3.7 |
| 23/04/2022 | 3.8 |
| 23/04/2022 | 3.7 |
| 23/04/2022 | 3.5 |
| 23/04/2022 | 3.1 |
| 23/04/2022 | 2.9 |
| 23/04/2022 | 2.6 |
| 24/04/2022 | 2.5 |
| 24/04/2022 | 2.3 |
| 24/04/2022 | 2.3 |
| 24/04/2022 | 2.2 |
| 24/04/2022 | 2.2 |
| 24/04/2022 | 2.3 |
| 24/04/2022 | 2.5 |
| 24/04/2022 | 2.8 |
| 24/04/2022 | 3.1 |
| 24/04/2022 | 3.3 |
| 24/04/2022 | 3.5 |
| 24/04/2022 | 3.6 |
| 24/04/2022 | 3.5 |
| 24/04/2022 | 3.4 |
| 24/04/2022 | 3.3 |
| 24/04/2022 | 3.3 |
| 24/04/2022 | 3.4 |
| 24/04/2022 | 3.5 |
| 24/04/2022 | 3.5 |
| 24/04/2022 | 3.6 |
| 24/04/2022 | 3.4 |
| 24/04/2022 | 3.1 |
| 24/04/2022 | 2.9 |
| 24/04/2022 | 2.6 |
| 25/04/2022 | 2.4 |
| 25/04/2022 | 2.3 |
| 25/04/2022 | 2.3 |
| 25/04/2022 | 2.4 |
| 25/04/2022 | 2.7 |
| 25/04/2022 | 3.4 |
| 25/04/2022 | 4 |
| 25/04/2022 | 4.4 |
| 25/04/2022 | 4.6 |
| 25/04/2022 | 4.7 |
| 25/04/2022 | 4.8 |
| 25/04/2022 | 4.8 |
| 25/04/2022 | 4.7 |
| 25/04/2022 | 4.6 |
| 25/04/2022 | 4.5 |
| 25/04/2022 | 4.4 |
| 25/04/2022 | 4.5 |
| 25/04/2022 | 4.6 |
| 25/04/2022 | 4.6 |
| 25/04/2022 | 4.4 |
| 25/04/2022 | 4 |
| 25/04/2022 | 3.5 |
| 25/04/2022 | 3.1 |
| 25/04/2022 | 2.8 |
| 26/04/2022 | 2.5 |
| 26/04/2022 | 2.4 |
| 26/04/2022 | 2.4 |
| 26/04/2022 | 2.5 |
| 26/04/2022 | 2.8 |
| 26/04/2022 | 3.4 |
| 26/04/2022 | 4.1 |
| 26/04/2022 | 4.5 |
| 26/04/2022 | 4.7 |
| 26/04/2022 | 4.8 |
| 26/04/2022 | 4.8 |
| 26/04/2022 | 4.8 |
| 26/04/2022 | 4.7 |
| 26/04/2022 | 4.6 |
| 26/04/2022 | 4.5 |
| 26/04/2022 | 4.5 |
| 26/04/2022 | 4.5 |
| 26/04/2022 | 4.6 |
| 26/04/2022 | 4.6 |
| 26/04/2022 | 4.4 |
| 26/04/2022 | 4 |
| 26/04/2022 | 3.5 |
| 26/04/2022 | 3.1 |
| 26/04/2022 | 2.8 |
| 27/04/2022 | 2.5 |
| 27/04/2022 | 2.4 |
| 27/04/2022 | 2.4 |
| 27/04/2022 | 2.5 |
| 27/04/2022 | 2.8 |
| 27/04/2022 | 3.4 |
| 27/04/2022 | 4.1 |
| 27/04/2022 | 4.5 |
| 27/04/2022 | 4.7 |
| 27/04/2022 | 4.8 |
| 27/04/2022 | 4.8 |
| 27/04/2022 | 4.8 |
| 27/04/2022 | 4.7 |
| 27/04/2022 | 4.6 |
| 27/04/2022 | 4.5 |
| 27/04/2022 | 4.5 |
| 27/04/2022 | 4.5 |
| 27/04/2022 | 4.6 |
| 27/04/2022 | 4.6 |
| 27/04/2022 | 4.4 |
| 27/04/2022 | 4 |
| 27/04/2022 | 3.5 |
| 27/04/2022 | 3.1 |
| 27/04/2022 | 2.8 |
| 28/04/2022 | 2.5 |
| 28/04/2022 | 2.4 |
| 28/04/2022 | 2.4 |
| 28/04/2022 | 2.5 |
| 28/04/2022 | 2.8 |
| 28/04/2022 | 3.4 |
| 28/04/2022 | 4 |
| 28/04/2022 | 4.5 |
| 28/04/2022 | 4.6 |
| 28/04/2022 | 4.8 |
| 28/04/2022 | 4.8 |
| 28/04/2022 | 4.8 |
| 28/04/2022 | 4.7 |
| 28/04/2022 | 4.6 |
| 28/04/2022 | 4.5 |
| 28/04/2022 | 4.5 |
| 28/04/2022 | 4.5 |
| 28/04/2022 | 4.6 |
| 28/04/2022 | 4.5 |
| 28/04/2022 | 4.4 |
| 28/04/2022 | 4 |
| 28/04/2022 | 3.4 |
| 28/04/2022 | 3.1 |
| 28/04/2022 | 2.8 |
| 29/04/2022 | 2.5 |
| 29/04/2022 | 2.4 |
| 29/04/2022 | 2.4 |
| 29/04/2022 | 2.5 |
| 29/04/2022 | 2.8 |
| 29/04/2022 | 3.4 |
| 29/04/2022 | 4 |
| 29/04/2022 | 4.4 |
| 29/04/2022 | 4.6 |
| 29/04/2022 | 4.7 |
| 29/04/2022 | 4.8 |
| 29/04/2022 | 4.7 |
| 29/04/2022 | 4.6 |
| 29/04/2022 | 4.5 |
| 29/04/2022 | 4.4 |
| 29/04/2022 | 4.3 |
| 29/04/2022 | 4.3 |
| 29/04/2022 | 4.3 |
| 29/04/2022 | 4.3 |
| 29/04/2022 | 4.1 |
| 29/04/2022 | 3.8 |
| 29/04/2022 | 3.3 |
| 29/04/2022 | 3 |
| 29/04/2022 | 2.7 |
| 30/04/2022 | 2.5 |
| 30/04/2022 | 2.4 |
| 30/04/2022 | 2.3 |
| 30/04/2022 | 2.3 |
| 30/04/2022 | 2.4 |
| 30/04/2022 | 2.5 |
| 30/04/2022 | 2.8 |
| 30/04/2022 | 3.2 |
| 30/04/2022 | 3.6 |
| 30/04/2022 | 3.8 |
| 30/04/2022 | 3.9 |
| 30/04/2022 | 3.9 |
| 30/04/2022 | 3.8 |
| 30/04/2022 | 3.6 |
| 30/04/2022 | 3.6 |
| 30/04/2022 | 3.5 |
| 30/04/2022 | 3.6 |
| 30/04/2022 | 3.7 |
| 30/04/2022 | 3.7 |
| 30/04/2022 | 3.6 |
| 30/04/2022 | 3.4 |
| 30/04/2022 | 3.1 |
| 30/04/2022 | 2.8 |
| 30/04/2022 | 2.6 |
| 01/05/2022 | 2.4 |
| 01/05/2022 | 2.3 |
| 01/05/2022 | 2.2 |
| 01/05/2022 | 2.2 |
| 01/05/2022 | 2.2 |
| 01/05/2022 | 2.3 |
| 01/05/2022 | 2.4 |
| 01/05/2022 | 2.7 |
| 01/05/2022 | 3.1 |
| 01/05/2022 | 3.3 |
| 01/05/2022 | 3.4 |
| 01/05/2022 | 3.5 |
| 01/05/2022 | 3.4 |
| 01/05/2022 | 3.3 |
| 01/05/2022 | 3.2 |
| 01/05/2022 | 3.2 |
| 01/05/2022 | 3.4 |
| 01/05/2022 | 3.4 |
| 01/05/2022 | 3.4 |
| 01/05/2022 | 3.5 |
| 01/05/2022 | 3.4 |
| 01/05/2022 | 3.1 |
| 01/05/2022 | 2.8 |
| 01/05/2022 | 2.6 |
| 02/05/2022 | 2.4 |
| 02/05/2022 | 2.3 |
| 02/05/2022 | 2.3 |
| 02/05/2022 | 2.4 |
| 02/05/2022 | 2.7 |
| 02/05/2022 | 3.3 |
| 02/05/2022 | 3.9 |
| 02/05/2022 | 4.3 |
| 02/05/2022 | 4.5 |
| 02/05/2022 | 4.7 |
| 02/05/2022 | 4.7 |
| 02/05/2022 | 4.7 |
| 02/05/2022 | 4.6 |
| 02/05/2022 | 4.5 |
| 02/05/2022 | 4.4 |
| 02/05/2022 | 4.4 |
| 02/05/2022 | 4.5 |
| 02/05/2022 | 4.5 |
| 02/05/2022 | 4.5 |
| 02/05/2022 | 4.3 |
| 02/05/2022 | 4 |
| 02/05/2022 | 3.4 |
| 02/05/2022 | 3 |
| 02/05/2022 | 2.7 |
| 03/05/2022 | 2.5 |
| 03/05/2022 | 2.4 |
| 03/05/2022 | 2.3 |
| 03/05/2022 | 2.5 |
| 03/05/2022 | 2.8 |
| 03/05/2022 | 3.4 |
| 03/05/2022 | 4 |
| 03/05/2022 | 4.4 |
| 03/05/2022 | 4.6 |
| 03/05/2022 | 4.7 |
| 03/05/2022 | 4.7 |
| 03/05/2022 | 4.8 |
| 03/05/2022 | 4.7 |
| 03/05/2022 | 4.6 |
| 03/05/2022 | 4.5 |
| 03/05/2022 | 4.4 |
| 03/05/2022 | 4.5 |
| 03/05/2022 | 4.5 |
| 03/05/2022 | 4.5 |
| 03/05/2022 | 4.3 |
| 03/05/2022 | 4 |
| 03/05/2022 | 3.4 |
| 03/05/2022 | 3 |
| 03/05/2022 | 2.7 |
| 04/05/2022 | 2.5 |
| 04/05/2022 | 2.4 |
| 04/05/2022 | 2.4 |
| 04/05/2022 | 2.5 |
| 04/05/2022 | 2.8 |
| 04/05/2022 | 3.4 |
| 04/05/2022 | 4 |
| 04/05/2022 | 4.4 |
| 04/05/2022 | 4.6 |
| 04/05/2022 | 4.7 |
| 04/05/2022 | 4.7 |
| 04/05/2022 | 4.8 |
| 04/05/2022 | 4.7 |
| 04/05/2022 | 4.6 |
| 04/05/2022 | 4.5 |
| 04/05/2022 | 4.5 |
| 04/05/2022 | 4.5 |
| 04/05/2022 | 4.6 |
| 04/05/2022 | 4.5 |
| 04/05/2022 | 4.3 |
| 04/05/2022 | 4 |
| 04/05/2022 | 3.4 |
| 04/05/2022 | 3.1 |
| 04/05/2022 | 2.7 |
| 05/05/2022 | 2.5 |
| 05/05/2022 | 2.4 |
| 05/05/2022 | 2.4 |
| 05/05/2022 | 2.5 |
| 05/05/2022 | 2.8 |
| 05/05/2022 | 3.4 |
| 05/05/2022 | 4 |
| 05/05/2022 | 4.4 |
| 05/05/2022 | 4.6 |
| 05/05/2022 | 4.7 |
| 05/05/2022 | 4.8 |
| 05/05/2022 | 4.8 |
| 05/05/2022 | 4.7 |
| 05/05/2022 | 4.6 |
| 05/05/2022 | 4.5 |
| 05/05/2022 | 4.5 |
| 05/05/2022 | 4.5 |
| 05/05/2022 | 4.5 |
| 05/05/2022 | 4.5 |
| 05/05/2022 | 4.3 |
| 05/05/2022 | 4 |
| 05/05/2022 | 3.4 |
| 05/05/2022 | 3 |
| 05/05/2022 | 2.8 |
| 06/05/2022 | 2.5 |
| 06/05/2022 | 2.4 |
| 06/05/2022 | 2.4 |
| 06/05/2022 | 2.5 |
| 06/05/2022 | 2.8 |
| 06/05/2022 | 3.4 |
| 06/05/2022 | 4 |
| 06/05/2022 | 4.4 |
| 06/05/2022 | 4.6 |
| 06/05/2022 | 4.7 |
| 06/05/2022 | 4.7 |
| 06/05/2022 | 4.7 |
| 06/05/2022 | 4.6 |
| 06/05/2022 | 4.5 |
| 06/05/2022 | 4.4 |
| 06/05/2022 | 4.3 |
| 06/05/2022 | 4.4 |
| 06/05/2022 | 4.3 |
| 06/05/2022 | 4.3 |
| 06/05/2022 | 4.1 |
| 06/05/2022 | 3.8 |
| 06/05/2022 | 3.3 |
| 06/05/2022 | 3 |
| 06/05/2022 | 2.7 |
| 07/05/2022 | 2.5 |
| 07/05/2022 | 2.4 |
| 07/05/2022 | 2.3 |
| 07/05/2022 | 2.3 |
| 07/05/2022 | 2.4 |
| 07/05/2022 | 2.5 |
| 07/05/2022 | 2.8 |
| 07/05/2022 | 3.2 |
| 07/05/2022 | 3.6 |
| 07/05/2022 | 3.8 |
| 07/05/2022 | 3.9 |
| 07/05/2022 | 3.9 |
| 07/05/2022 | 3.8 |
| 07/05/2022 | 3.7 |
| 07/05/2022 | 3.6 |
| 07/05/2022 | 3.6 |
| 07/05/2022 | 3.6 |
| 07/05/2022 | 3.7 |
| 07/05/2022 | 3.7 |
| 07/05/2022 | 3.6 |
| 07/05/2022 | 3.4 |
| 07/05/2022 | 3.1 |
| 07/05/2022 | 2.8 |
| 07/05/2022 | 2.6 |
| 08/05/2022 | 2.4 |
| 08/05/2022 | 2.3 |
| 08/05/2022 | 2.2 |
| 08/05/2022 | 2.2 |
| 08/05/2022 | 2.2 |
| 08/05/2022 | 2.3 |
| 08/05/2022 | 2.4 |
| 08/05/2022 | 2.7 |
| 08/05/2022 | 3.1 |
| 08/05/2022 | 3.3 |
| 08/05/2022 | 3.4 |
| 08/05/2022 | 3.5 |
| 08/05/2022 | 3.4 |
| 08/05/2022 | 3.3 |
| 08/05/2022 | 3.3 |
| 08/05/2022 | 3.3 |
| 08/05/2022 | 3.4 |
| 08/05/2022 | 3.5 |
| 08/05/2022 | 3.5 |
| 08/05/2022 | 3.5 |
| 08/05/2022 | 3.4 |
| 08/05/2022 | 3.1 |
| 08/05/2022 | 2.9 |
| 08/05/2022 | 2.6 |
| 09/05/2022 | 2.4 |
| 09/05/2022 | 2.3 |
| 09/05/2022 | 2.3 |
| 09/05/2022 | 2.4 |
| 09/05/2022 | 2.7 |
| 09/05/2022 | 3.3 |
| 09/05/2022 | 3.9 |
| 09/05/2022 | 4.4 |
| 09/05/2022 | 4.6 |
| 09/05/2022 | 4.7 |
| 09/05/2022 | 4.7 |
| 09/05/2022 | 4.8 |
| 09/05/2022 | 4.7 |
| 09/05/2022 | 4.6 |
| 09/05/2022 | 4.5 |
| 09/05/2022 | 4.4 |
| 09/05/2022 | 4.5 |
| 09/05/2022 | 4.6 |
| 09/05/2022 | 4.5 |
| 09/05/2022 | 4.3 |
| 09/05/2022 | 3.9 |
| 09/05/2022 | 3.4 |
| 09/05/2022 | 3 |
| 09/05/2022 | 2.7 |
| 10/05/2022 | 2.5 |
| 10/05/2022 | 2.4 |
| 10/05/2022 | 2.4 |
| 10/05/2022 | 2.5 |
| 10/05/2022 | 2.8 |
| 10/05/2022 | 3.4 |
| 10/05/2022 | 4 |
| 10/05/2022 | 4.5 |
| 10/05/2022 | 4.6 |
| 10/05/2022 | 4.8 |
| 10/05/2022 | 4.8 |
| 10/05/2022 | 4.8 |
| 10/05/2022 | 4.8 |
| 10/05/2022 | 4.6 |
| 10/05/2022 | 4.6 |
| 10/05/2022 | 4.5 |
| 10/05/2022 | 4.6 |
| 10/05/2022 | 4.6 |
| 10/05/2022 | 4.6 |
| 10/05/2022 | 4.3 |
| 10/05/2022 | 4 |
| 10/05/2022 | 3.5 |
| 10/05/2022 | 3.1 |
| 10/05/2022 | 2.8 |
| 11/05/2022 | 2.5 |
| 11/05/2022 | 2.4 |
| 11/05/2022 | 2.4 |
| 11/05/2022 | 2.5 |
| 11/05/2022 | 2.8 |
| 11/05/2022 | 3.4 |
| 11/05/2022 | 4 |
| 11/05/2022 | 4.5 |
| 11/05/2022 | 4.6 |
| 11/05/2022 | 4.8 |
| 11/05/2022 | 4.8 |
| 11/05/2022 | 4.8 |
| 11/05/2022 | 4.7 |
| 11/05/2022 | 4.6 |
| 11/05/2022 | 4.6 |
| 11/05/2022 | 4.5 |
| 11/05/2022 | 4.6 |
| 11/05/2022 | 4.6 |
| 11/05/2022 | 4.6 |
| 11/05/2022 | 4.3 |
| 11/05/2022 | 4 |
| 11/05/2022 | 3.5 |
| 11/05/2022 | 3.1 |
| 11/05/2022 | 2.8 |
| 12/05/2022 | 2.5 |
| 12/05/2022 | 2.4 |
| 12/05/2022 | 2.4 |
| 12/05/2022 | 2.5 |
| 12/05/2022 | 2.8 |
| 12/05/2022 | 3.4 |
| 12/05/2022 | 4 |
| 12/05/2022 | 4.5 |
| 12/05/2022 | 4.7 |
| 12/05/2022 | 4.8 |
| 12/05/2022 | 4.8 |
| 12/05/2022 | 4.8 |
| 12/05/2022 | 4.8 |
| 12/05/2022 | 4.7 |
| 12/05/2022 | 4.6 |
| 12/05/2022 | 4.5 |
| 12/05/2022 | 4.6 |
| 12/05/2022 | 4.6 |
| 12/05/2022 | 4.5 |
| 12/05/2022 | 4.3 |
| 12/05/2022 | 4 |
| 12/05/2022 | 3.5 |
| 12/05/2022 | 3.1 |
| 12/05/2022 | 2.8 |
| 13/05/2022 | 2.5 |
| 13/05/2022 | 2.4 |
| 13/05/2022 | 2.4 |
| 13/05/2022 | 2.5 |
| 13/05/2022 | 2.8 |
| 13/05/2022 | 3.4 |
| 13/05/2022 | 4 |
| 13/05/2022 | 4.4 |
| 13/05/2022 | 4.6 |
| 13/05/2022 | 4.8 |
| 13/05/2022 | 4.8 |
| 13/05/2022 | 4.8 |
| 13/05/2022 | 4.7 |
| 13/05/2022 | 4.6 |
| 13/05/2022 | 4.5 |
| 13/05/2022 | 4.4 |
| 13/05/2022 | 4.4 |
| 13/05/2022 | 4.4 |
| 13/05/2022 | 4.3 |
| 13/05/2022 | 4.1 |
| 13/05/2022 | 3.8 |
| 13/05/2022 | 3.3 |
| 13/05/2022 | 3 |
| 13/05/2022 | 2.7 |
| 14/05/2022 | 2.6 |
| 14/05/2022 | 2.4 |
| 14/05/2022 | 2.3 |
| 14/05/2022 | 2.3 |
| 14/05/2022 | 2.4 |
| 14/05/2022 | 2.5 |
| 14/05/2022 | 2.8 |
| 14/05/2022 | 3.2 |
| 14/05/2022 | 3.6 |
| 14/05/2022 | 3.9 |
| 14/05/2022 | 3.9 |
| 14/05/2022 | 4 |
| 14/05/2022 | 3.8 |
| 14/05/2022 | 3.7 |
| 14/05/2022 | 3.7 |
| 14/05/2022 | 3.6 |
| 14/05/2022 | 3.7 |
| 14/05/2022 | 3.7 |
| 14/05/2022 | 3.7 |
| 14/05/2022 | 3.6 |
| 14/05/2022 | 3.4 |
| 14/05/2022 | 3.1 |
| 14/05/2022 | 2.8 |
| 14/05/2022 | 2.6 |
| 15/05/2022 | 2.5 |
| 15/05/2022 | 2.3 |
| 15/05/2022 | 2.3 |
| 15/05/2022 | 2.2 |
| 15/05/2022 | 2.2 |
| 15/05/2022 | 2.3 |
| 15/05/2022 | 2.5 |
| 15/05/2022 | 2.8 |
| 15/05/2022 | 3.1 |
| 15/05/2022 | 3.3 |
| 15/05/2022 | 3.5 |
| 15/05/2022 | 3.6 |
| 15/05/2022 | 3.5 |
| 15/05/2022 | 3.4 |
| 15/05/2022 | 3.3 |
| 15/05/2022 | 3.3 |
| 15/05/2022 | 3.4 |
| 15/05/2022 | 3.5 |
| 15/05/2022 | 3.5 |
| 15/05/2022 | 3.5 |
| 15/05/2022 | 3.4 |
| 15/05/2022 | 3.2 |
| 15/05/2022 | 2.9 |
| 15/05/2022 | 2.6 |
| 16/05/2022 | 2.4 |
| 16/05/2022 | 2.3 |
| 16/05/2022 | 2.3 |
| 16/05/2022 | 2.4 |
| 16/05/2022 | 2.7 |
| 16/05/2022 | 3.4 |
| 16/05/2022 | 4 |
| 16/05/2022 | 4.4 |
| 16/05/2022 | 4.6 |
| 16/05/2022 | 4.8 |
| 16/05/2022 | 4.8 |
| 16/05/2022 | 4.8 |
| 16/05/2022 | 4.8 |
| 16/05/2022 | 4.7 |
| 16/05/2022 | 4.6 |
| 16/05/2022 | 4.5 |
| 16/05/2022 | 4.6 |
| 16/05/2022 | 4.6 |
| 16/05/2022 | 4.6 |
| 16/05/2022 | 4.3 |
| 16/05/2022 | 3.9 |
| 16/05/2022 | 3.5 |
| 16/05/2022 | 3.1 |
| 16/05/2022 | 2.8 |
| 17/05/2022 | 2.5 |
| 17/05/2022 | 2.4 |
| 17/05/2022 | 2.4 |
| 17/05/2022 | 2.5 |
| 17/05/2022 | 2.8 |
| 17/05/2022 | 3.4 |
| 17/05/2022 | 4.1 |
| 17/05/2022 | 4.5 |
| 17/05/2022 | 4.7 |
| 17/05/2022 | 4.8 |
| 17/05/2022 | 4.9 |
| 17/05/2022 | 4.9 |
| 17/05/2022 | 4.8 |
| 17/05/2022 | 4.7 |
| 17/05/2022 | 4.6 |
| 17/05/2022 | 4.6 |
| 17/05/2022 | 4.6 |
| 17/05/2022 | 4.7 |
| 17/05/2022 | 4.6 |
| 17/05/2022 | 4.3 |
| 17/05/2022 | 4 |
| 17/05/2022 | 3.5 |
| 17/05/2022 | 3.1 |
| 17/05/2022 | 2.8 |
| 18/05/2022 | 2.5 |
| 18/05/2022 | 2.4 |
| 18/05/2022 | 2.4 |
| 18/05/2022 | 2.5 |
| 18/05/2022 | 2.8 |
| 18/05/2022 | 3.4 |
| 18/05/2022 | 4.1 |
| 18/05/2022 | 4.5 |
| 18/05/2022 | 4.7 |
| 18/05/2022 | 4.8 |
| 18/05/2022 | 4.9 |
| 18/05/2022 | 4.9 |
| 18/05/2022 | 4.8 |
| 18/05/2022 | 4.7 |
| 18/05/2022 | 4.6 |
| 18/05/2022 | 4.6 |
| 18/05/2022 | 4.7 |
| 18/05/2022 | 4.7 |
| 18/05/2022 | 4.6 |
| 18/05/2022 | 4.3 |
| 18/05/2022 | 4 |
| 18/05/2022 | 3.5 |
| 18/05/2022 | 3.1 |
| 18/05/2022 | 2.8 |
| 19/05/2022 | 2.5 |
| 19/05/2022 | 2.4 |
| 19/05/2022 | 2.4 |
| 19/05/2022 | 2.5 |
| 19/05/2022 | 2.8 |
| 19/05/2022 | 3.4 |
| 19/05/2022 | 4.1 |
| 19/05/2022 | 4.5 |
| 19/05/2022 | 4.7 |
| 19/05/2022 | 4.8 |
| 19/05/2022 | 4.9 |
| 19/05/2022 | 4.9 |
| 19/05/2022 | 4.8 |
| 19/05/2022 | 4.7 |
| 19/05/2022 | 4.7 |
| 19/05/2022 | 4.6 |
| 19/05/2022 | 4.6 |
| 19/05/2022 | 4.6 |
| 19/05/2022 | 4.6 |
| 19/05/2022 | 4.3 |
| 19/05/2022 | 4 |
| 19/05/2022 | 3.5 |
| 19/05/2022 | 3.1 |
| 19/05/2022 | 2.8 |
| 20/05/2022 | 2.5 |
| 20/05/2022 | 2.4 |
| 20/05/2022 | 2.4 |
| 20/05/2022 | 2.5 |
| 20/05/2022 | 2.8 |
| 20/05/2022 | 3.4 |
| 20/05/2022 | 4 |
| 20/05/2022 | 4.5 |
| 20/05/2022 | 4.7 |
| 20/05/2022 | 4.8 |
| 20/05/2022 | 4.9 |
| 20/05/2022 | 4.9 |
| 20/05/2022 | 4.7 |
| 20/05/2022 | 4.6 |
| 20/05/2022 | 4.5 |
| 20/05/2022 | 4.5 |
| 20/05/2022 | 4.5 |
| 20/05/2022 | 4.4 |
| 20/05/2022 | 4.4 |
| 20/05/2022 | 4.1 |
| 20/05/2022 | 3.8 |
| 20/05/2022 | 3.4 |
| 20/05/2022 | 3 |
| 20/05/2022 | 2.8 |
| 21/05/2022 | 2.6 |
| 21/05/2022 | 2.4 |
| 21/05/2022 | 2.4 |
| 21/05/2022 | 2.3 |
| 21/05/2022 | 2.4 |
| 21/05/2022 | 2.5 |
| 21/05/2022 | 2.8 |
| 21/05/2022 | 3.2 |
| 21/05/2022 | 3.6 |
| 21/05/2022 | 3.9 |
| 21/05/2022 | 4 |
| 21/05/2022 | 4 |
| 21/05/2022 | 3.9 |
| 21/05/2022 | 3.8 |
| 21/05/2022 | 3.7 |
| 21/05/2022 | 3.7 |
| 21/05/2022 | 3.7 |
| 21/05/2022 | 3.8 |
| 21/05/2022 | 3.8 |
| 21/05/2022 | 3.6 |
| 21/05/2022 | 3.4 |
| 21/05/2022 | 3.1 |
| 21/05/2022 | 2.9 |
| 21/05/2022 | 2.7 |
| 22/05/2022 | 2.5 |
| 22/05/2022 | 2.3 |
| 22/05/2022 | 2.3 |
| 22/05/2022 | 2.2 |
| 22/05/2022 | 2.2 |
| 22/05/2022 | 2.3 |
| 22/05/2022 | 2.5 |
| 22/05/2022 | 2.8 |
| 22/05/2022 | 3.1 |
| 22/05/2022 | 3.4 |
| 22/05/2022 | 3.5 |
| 22/05/2022 | 3.6 |
| 22/05/2022 | 3.5 |
| 22/05/2022 | 3.4 |
| 22/05/2022 | 3.4 |
| 22/05/2022 | 3.4 |
| 22/05/2022 | 3.5 |
| 22/05/2022 | 3.6 |
| 22/05/2022 | 3.5 |
| 22/05/2022 | 3.5 |
| 22/05/2022 | 3.4 |
| 22/05/2022 | 3.2 |
| 22/05/2022 | 2.9 |
| 22/05/2022 | 2.6 |
| 23/05/2022 | 2.4 |
| 23/05/2022 | 2.3 |
| 23/05/2022 | 2.3 |
| 23/05/2022 | 2.5 |
| 23/05/2022 | 2.7 |
| 23/05/2022 | 3.4 |
| 23/05/2022 | 4 |
| 23/05/2022 | 4.4 |
| 23/05/2022 | 4.7 |
| 23/05/2022 | 4.8 |
| 23/05/2022 | 4.8 |
| 23/05/2022 | 4.9 |
| 23/05/2022 | 4.8 |
| 23/05/2022 | 4.7 |
| 23/05/2022 | 4.6 |
| 23/05/2022 | 4.6 |
| 23/05/2022 | 4.7 |
| 23/05/2022 | 4.7 |
| 23/05/2022 | 4.6 |
| 23/05/2022 | 4.3 |
| 23/05/2022 | 3.9 |
| 23/05/2022 | 3.5 |
| 23/05/2022 | 3.1 |
| 23/05/2022 | 2.8 |
| 24/05/2022 | 2.5 |
| 24/05/2022 | 2.4 |
| 24/05/2022 | 2.4 |
| 24/05/2022 | 2.5 |
| 24/05/2022 | 2.8 |
| 24/05/2022 | 3.4 |
| 24/05/2022 | 4.1 |
| 24/05/2022 | 4.5 |
| 24/05/2022 | 4.7 |
| 24/05/2022 | 4.9 |
| 24/05/2022 | 4.9 |
| 24/05/2022 | 4.9 |
| 24/05/2022 | 4.9 |
| 24/05/2022 | 4.8 |
| 24/05/2022 | 4.7 |
| 24/05/2022 | 4.7 |
| 24/05/2022 | 4.7 |
| 24/05/2022 | 4.7 |
| 24/05/2022 | 4.7 |
| 24/05/2022 | 4.4 |
| 24/05/2022 | 4 |
| 24/05/2022 | 3.6 |
| 24/05/2022 | 3.1 |
| 24/05/2022 | 2.8 |
| 25/05/2022 | 2.5 |
| 25/05/2022 | 2.4 |
| 25/05/2022 | 2.4 |
| 25/05/2022 | 2.6 |
| 25/05/2022 | 2.8 |
| 25/05/2022 | 3.5 |
| 25/05/2022 | 4.1 |
| 25/05/2022 | 4.5 |
| 25/05/2022 | 4.7 |
| 25/05/2022 | 4.9 |
| 25/05/2022 | 4.9 |
| 25/05/2022 | 4.9 |
| 25/05/2022 | 4.9 |
| 25/05/2022 | 4.8 |
| 25/05/2022 | 4.7 |
| 25/05/2022 | 4.7 |
| 25/05/2022 | 4.7 |
| 25/05/2022 | 4.7 |
| 25/05/2022 | 4.7 |
| 25/05/2022 | 4.4 |
| 25/05/2022 | 4 |
| 25/05/2022 | 3.6 |
| 25/05/2022 | 3.1 |
| 25/05/2022 | 2.7 |
| 26/05/2022 | 2.5 |
| 26/05/2022 | 2.4 |
| 26/05/2022 | 2.3 |
| 26/05/2022 | 2.3 |
| 26/05/2022 | 2.3 |
| 26/05/2022 | 2.4 |
| 26/05/2022 | 2.6 |
| 26/05/2022 | 3 |
| 26/05/2022 | 3.3 |
| 26/05/2022 | 3.6 |
| 26/05/2022 | 3.7 |
| 26/05/2022 | 3.8 |
| 26/05/2022 | 3.6 |
| 26/05/2022 | 3.5 |
| 26/05/2022 | 3.4 |
| 26/05/2022 | 3.4 |
| 26/05/2022 | 3.4 |
| 26/05/2022 | 3.5 |
| 26/05/2022 | 3.5 |
| 26/05/2022 | 3.4 |
| 26/05/2022 | 3.3 |
| 26/05/2022 | 3.1 |
| 26/05/2022 | 2.8 |
| 26/05/2022 | 2.5 |
| 27/05/2022 | 2.4 |
| 27/05/2022 | 2.2 |
| 27/05/2022 | 2.2 |
| 27/05/2022 | 2.3 |
| 27/05/2022 | 2.4 |
| 27/05/2022 | 2.6 |
| 27/05/2022 | 2.9 |
| 27/05/2022 | 3.3 |
| 27/05/2022 | 3.6 |
| 27/05/2022 | 3.9 |
| 27/05/2022 | 4 |
| 27/05/2022 | 4 |
| 27/05/2022 | 3.9 |
| 27/05/2022 | 3.8 |
| 27/05/2022 | 3.8 |
| 27/05/2022 | 3.7 |
| 27/05/2022 | 3.8 |
| 27/05/2022 | 3.8 |
| 27/05/2022 | 3.8 |
| 27/05/2022 | 3.6 |
| 27/05/2022 | 3.4 |
| 27/05/2022 | 3.1 |
| 27/05/2022 | 2.8 |
| 27/05/2022 | 2.8 |
| 28/05/2022 | 2.6 |
| 28/05/2022 | 2.4 |
| 28/05/2022 | 2.4 |
| 28/05/2022 | 2.4 |
| 28/05/2022 | 2.4 |
| 28/05/2022 | 2.5 |
| 28/05/2022 | 2.8 |
| 28/05/2022 | 3.3 |
| 28/05/2022 | 3.7 |
| 28/05/2022 | 3.9 |
| 28/05/2022 | 4 |
| 28/05/2022 | 4.1 |
| 28/05/2022 | 4 |
| 28/05/2022 | 3.8 |
| 28/05/2022 | 3.8 |
| 28/05/2022 | 3.7 |
| 28/05/2022 | 3.8 |
| 28/05/2022 | 3.8 |
| 28/05/2022 | 3.8 |
| 28/05/2022 | 3.6 |
| 28/05/2022 | 3.4 |
| 28/05/2022 | 3.2 |
| 28/05/2022 | 2.9 |
| 28/05/2022 | 2.7 |
| 29/05/2022 | 2.5 |
| 29/05/2022 | 2.4 |
| 29/05/2022 | 2.3 |
| 29/05/2022 | 2.3 |
| 29/05/2022 | 2.2 |
| 29/05/2022 | 2.3 |
| 29/05/2022 | 2.5 |
| 29/05/2022 | 2.8 |
| 29/05/2022 | 3.1 |
| 29/05/2022 | 3.4 |
| 29/05/2022 | 3.6 |
| 29/05/2022 | 3.7 |
| 29/05/2022 | 3.6 |
| 29/05/2022 | 3.5 |
| 29/05/2022 | 3.5 |
| 29/05/2022 | 3.4 |
| 29/05/2022 | 3.5 |
| 29/05/2022 | 3.6 |
| 29/05/2022 | 3.6 |
| 29/05/2022 | 3.5 |
| 29/05/2022 | 3.4 |
| 29/05/2022 | 3.2 |
| 29/05/2022 | 2.9 |
| 29/05/2022 | 2.7 |
| 30/05/2022 | 2.4 |
| 30/05/2022 | 2.4 |
| 30/05/2022 | 2.3 |
| 30/05/2022 | 2.5 |
| 30/05/2022 | 2.7 |
| 30/05/2022 | 3.4 |
| 30/05/2022 | 4 |
| 30/05/2022 | 4.5 |
| 30/05/2022 | 4.7 |
| 30/05/2022 | 4.9 |
| 30/05/2022 | 4.9 |
| 30/05/2022 | 5 |
| 30/05/2022 | 4.9 |
| 30/05/2022 | 4.8 |
| 30/05/2022 | 4.7 |
| 30/05/2022 | 4.7 |
| 30/05/2022 | 4.7 |
| 30/05/2022 | 4.7 |
| 30/05/2022 | 4.7 |
| 30/05/2022 | 4.3 |
| 30/05/2022 | 3.9 |
| 30/05/2022 | 3.6 |
| 30/05/2022 | 3.1 |
| 30/05/2022 | 2.8 |
| 31/05/2022 | 2.6 |
| 31/05/2022 | 2.5 |
| 31/05/2022 | 2.4 |
| 31/05/2022 | 2.6 |
| 31/05/2022 | 2.8 |
| 31/05/2022 | 3.5 |
| 31/05/2022 | 4.1 |
| 31/05/2022 | 4.5 |
| 31/05/2022 | 4.8 |
| 31/05/2022 | 4.9 |
| 31/05/2022 | 5 |
| 31/05/2022 | 5 |
| 31/05/2022 | 5 |
| 31/05/2022 | 4.9 |
| 31/05/2022 | 4.8 |
| 31/05/2022 | 4.7 |
| 31/05/2022 | 4.8 |
| 31/05/2022 | 4.8 |
| 31/05/2022 | 4.7 |
| 31/05/2022 | 4.4 |
| 31/05/2022 | 4 |
| 31/05/2022 | 3.6 |
| 31/05/2022 | 3.2 |
| 31/05/2022 | 2.8 |
| 01/06/2022 | 2.6 |
| 01/06/2022 | 2.5 |
| 01/06/2022 | 2.4 |
| 01/06/2022 | 2.6 |
| 01/06/2022 | 2.8 |
| 01/06/2022 | 3.5 |
| 01/06/2022 | 4.1 |
| 01/06/2022 | 4.5 |
| 01/06/2022 | 4.8 |
| 01/06/2022 | 4.9 |
| 01/06/2022 | 5 |
| 01/06/2022 | 5 |
| 01/06/2022 | 4.9 |
| 01/06/2022 | 4.9 |
| 01/06/2022 | 4.8 |
| 01/06/2022 | 4.7 |
| 01/06/2022 | 4.8 |
| 01/06/2022 | 4.8 |
| 01/06/2022 | 4.7 |
| 01/06/2022 | 4.4 |
| 01/06/2022 | 4 |
| 01/06/2022 | 3.6 |
| 01/06/2022 | 3.2 |
| 01/06/2022 | 2.8 |
| 02/06/2022 | 2.6 |
| 02/06/2022 | 2.5 |
| 02/06/2022 | 2.4 |
| 02/06/2022 | 2.6 |
| 02/06/2022 | 2.8 |
| 02/06/2022 | 3.5 |
| 02/06/2022 | 4.1 |
| 02/06/2022 | 4.5 |
| 02/06/2022 | 4.8 |
| 02/06/2022 | 4.9 |
| 02/06/2022 | 5 |
| 02/06/2022 | 5 |
| 02/06/2022 | 5 |
| 02/06/2022 | 4.9 |
| 02/06/2022 | 4.8 |
| 02/06/2022 | 4.7 |
| 02/06/2022 | 4.8 |
| 02/06/2022 | 4.8 |
| 02/06/2022 | 4.7 |
| 02/06/2022 | 4.3 |
| 02/06/2022 | 4 |
| 02/06/2022 | 3.6 |
| 02/06/2022 | 3.2 |
| 02/06/2022 | 2.8 |
| 03/06/2022 | 2.6 |
| 03/06/2022 | 2.5 |
| 03/06/2022 | 2.4 |
| 03/06/2022 | 2.6 |
| 03/06/2022 | 2.8 |
| 03/06/2022 | 3.4 |
| 03/06/2022 | 4.1 |
| 03/06/2022 | 4.5 |
| 03/06/2022 | 4.8 |
| 03/06/2022 | 4.9 |
| 03/06/2022 | 5 |
| 03/06/2022 | 5 |
| 03/06/2022 | 4.9 |
| 03/06/2022 | 4.8 |
| 03/06/2022 | 4.7 |
| 03/06/2022 | 4.6 |
| 03/06/2022 | 4.6 |
| 03/06/2022 | 4.6 |
| 03/06/2022 | 4.5 |
| 03/06/2022 | 4.1 |
| 03/06/2022 | 3.8 |
| 03/06/2022 | 3.4 |
| 03/06/2022 | 3.1 |
| 03/06/2022 | 2.8 |
| 04/06/2022 | 2.6 |
| 04/06/2022 | 2.5 |
| 04/06/2022 | 2.4 |
| 04/06/2022 | 2.4 |
| 04/06/2022 | 2.4 |
| 04/06/2022 | 2.6 |
| 04/06/2022 | 2.9 |
| 04/06/2022 | 3.3 |
| 04/06/2022 | 3.7 |
| 04/06/2022 | 4 |
| 04/06/2022 | 4.1 |
| 04/06/2022 | 4.1 |
| 04/06/2022 | 4 |
| 04/06/2022 | 3.9 |
| 04/06/2022 | 3.9 |
| 04/06/2022 | 3.8 |
| 04/06/2022 | 3.8 |
| 04/06/2022 | 3.9 |
| 04/06/2022 | 3.8 |
| 04/06/2022 | 3.6 |
| 04/06/2022 | 3.4 |
| 04/06/2022 | 3.2 |
| 04/06/2022 | 2.9 |
| 04/06/2022 | 2.6 |
| 05/06/2022 | 2.4 |
| 05/06/2022 | 2.3 |
| 05/06/2022 | 2.2 |
| 05/06/2022 | 2.2 |
| 05/06/2022 | 2.2 |
| 05/06/2022 | 2.3 |
| 05/06/2022 | 2.5 |
| 05/06/2022 | 2.8 |
| 05/06/2022 | 3.1 |
| 05/06/2022 | 3.3 |
| 05/06/2022 | 3.4 |
| 05/06/2022 | 3.5 |
| 05/06/2022 | 3.4 |
| 05/06/2022 | 3.3 |
| 05/06/2022 | 3.3 |
| 05/06/2022 | 3.3 |
| 05/06/2022 | 3.3 |
| 05/06/2022 | 3.4 |
| 05/06/2022 | 3.4 |
| 05/06/2022 | 3.3 |
| 05/06/2022 | 3.3 |
| 05/06/2022 | 3.1 |
| 05/06/2022 | 2.9 |
| 05/06/2022 | 2.6 |
| 06/06/2022 | 2.4 |
| 06/06/2022 | 2.3 |
| 06/06/2022 | 2.3 |
| 06/06/2022 | 2.2 |
| 06/06/2022 | 2.2 |
| 06/06/2022 | 2.3 |
| 06/06/2022 | 2.5 |
| 06/06/2022 | 2.8 |
| 06/06/2022 | 3.1 |
| 06/06/2022 | 3.3 |
| 06/06/2022 | 3.4 |
| 06/06/2022 | 3.5 |
| 06/06/2022 | 3.4 |
| 06/06/2022 | 3.3 |
| 06/06/2022 | 3.3 |
| 06/06/2022 | 3.3 |
| 06/06/2022 | 3.3 |
| 06/06/2022 | 3.4 |
| 06/06/2022 | 3.4 |
| 06/06/2022 | 3.3 |
| 06/06/2022 | 3.3 |
| 06/06/2022 | 3.1 |
| 06/06/2022 | 2.9 |
| 06/06/2022 | 2.8 |
| 07/06/2022 | 2.6 |
| 07/06/2022 | 2.5 |
| 07/06/2022 | 2.4 |
| 07/06/2022 | 2.5 |
| 07/06/2022 | 2.8 |
| 07/06/2022 | 3.3 |
| 07/06/2022 | 3.9 |
| 07/06/2022 | 4.4 |
| 07/06/2022 | 4.6 |
| 07/06/2022 | 4.8 |
| 07/06/2022 | 4.9 |
| 07/06/2022 | 5 |
| 07/06/2022 | 4.9 |
| 07/06/2022 | 4.8 |
| 07/06/2022 | 4.7 |
| 07/06/2022 | 4.7 |
| 07/06/2022 | 4.7 |
| 07/06/2022 | 4.7 |
| 07/06/2022 | 4.6 |
| 07/06/2022 | 4.2 |
| 07/06/2022 | 3.9 |
| 07/06/2022 | 3.6 |
| 07/06/2022 | 3.2 |
| 07/06/2022 | 2.8 |
| 08/06/2022 | 2.6 |
| 08/06/2022 | 2.5 |
| 08/06/2022 | 2.5 |
| 08/06/2022 | 2.6 |
| 08/06/2022 | 2.8 |
| 08/06/2022 | 3.5 |
| 08/06/2022 | 4.1 |
| 08/06/2022 | 4.6 |
| 08/06/2022 | 4.8 |
| 08/06/2022 | 5 |
| 08/06/2022 | 5 |
| 08/06/2022 | 5.1 |
| 08/06/2022 | 5 |
| 08/06/2022 | 4.9 |
| 08/06/2022 | 4.9 |
| 08/06/2022 | 4.8 |
| 08/06/2022 | 4.8 |
| 08/06/2022 | 4.9 |
| 08/06/2022 | 4.8 |
| 08/06/2022 | 4.4 |
| 08/06/2022 | 4 |
| 08/06/2022 | 3.6 |
| 08/06/2022 | 3.2 |
| 08/06/2022 | 2.8 |
| 09/06/2022 | 2.6 |
| 09/06/2022 | 2.5 |
| 09/06/2022 | 2.5 |
| 09/06/2022 | 2.6 |
| 09/06/2022 | 2.8 |
| 09/06/2022 | 3.5 |
| 09/06/2022 | 4.1 |
| 09/06/2022 | 4.6 |
| 09/06/2022 | 4.8 |
| 09/06/2022 | 5 |
| 09/06/2022 | 5 |
| 09/06/2022 | 5.1 |
| 09/06/2022 | 5 |
| 09/06/2022 | 5 |
| 09/06/2022 | 4.9 |
| 09/06/2022 | 4.8 |
| 09/06/2022 | 4.8 |
| 09/06/2022 | 4.8 |
| 09/06/2022 | 4.7 |
| 09/06/2022 | 4.3 |
| 09/06/2022 | 4 |
| 09/06/2022 | 3.6 |
| 09/06/2022 | 3.2 |
| 09/06/2022 | 2.9 |
| 10/06/2022 | 2.6 |
| 10/06/2022 | 2.5 |
| 10/06/2022 | 2.5 |
| 10/06/2022 | 2.6 |
| 10/06/2022 | 2.8 |
| 10/06/2022 | 3.5 |
| 10/06/2022 | 4.1 |
| 10/06/2022 | 4.6 |
| 10/06/2022 | 4.8 |
| 10/06/2022 | 5 |
| 10/06/2022 | 5 |
| 10/06/2022 | 5 |
| 10/06/2022 | 5 |
| 10/06/2022 | 4.8 |
| 10/06/2022 | 4.8 |
| 10/06/2022 | 4.7 |
| 10/06/2022 | 4.6 |
| 10/06/2022 | 4.6 |
| 10/06/2022 | 4.5 |
| 10/06/2022 | 4.1 |
| 10/06/2022 | 3.8 |
| 10/06/2022 | 3.5 |
| 10/06/2022 | 3.1 |
| 10/06/2022 | 2.8 |
| 11/06/2022 | 2.6 |
| 11/06/2022 | 2.5 |
| 11/06/2022 | 2.4 |
| 11/06/2022 | 2.4 |
| 11/06/2022 | 2.4 |
| 11/06/2022 | 2.6 |
| 11/06/2022 | 2.9 |
| 11/06/2022 | 3.3 |
| 11/06/2022 | 3.7 |
| 11/06/2022 | 4 |
| 11/06/2022 | 4.1 |
| 11/06/2022 | 4.2 |
| 11/06/2022 | 4.1 |
| 11/06/2022 | 4 |
| 11/06/2022 | 3.9 |
| 11/06/2022 | 3.9 |
| 11/06/2022 | 3.9 |
| 11/06/2022 | 3.9 |
| 11/06/2022 | 3.9 |
| 11/06/2022 | 3.6 |
| 11/06/2022 | 3.4 |
| 11/06/2022 | 3.3 |
| 11/06/2022 | 2.9 |
| 11/06/2022 | 2.7 |
| 12/06/2022 | 2.5 |
| 12/06/2022 | 2.4 |
| 12/06/2022 | 2.3 |
| 12/06/2022 | 2.3 |
| 12/06/2022 | 2.2 |
| 12/06/2022 | 2.3 |
| 12/06/2022 | 2.5 |
| 12/06/2022 | 2.8 |
| 12/06/2022 | 3.2 |
| 12/06/2022 | 3.5 |
| 12/06/2022 | 3.7 |
| 12/06/2022 | 3.8 |
| 12/06/2022 | 3.7 |
| 12/06/2022 | 3.6 |
| 12/06/2022 | 3.6 |
| 12/06/2022 | 3.6 |
| 12/06/2022 | 3.6 |
| 12/06/2022 | 3.7 |
| 12/06/2022 | 3.7 |
| 12/06/2022 | 3.5 |
| 12/06/2022 | 3.4 |
| 12/06/2022 | 3.3 |
| 12/06/2022 | 3 |
| 12/06/2022 | 2.7 |
| 13/06/2022 | 2.5 |
| 13/06/2022 | 2.4 |
| 13/06/2022 | 2.4 |
| 13/06/2022 | 2.5 |
| 13/06/2022 | 2.8 |
| 13/06/2022 | 3.4 |
| 13/06/2022 | 4.1 |
| 13/06/2022 | 4.5 |
| 13/06/2022 | 4.8 |
| 13/06/2022 | 4.9 |
| 13/06/2022 | 5 |
| 13/06/2022 | 5.1 |
| 13/06/2022 | 5 |
| 13/06/2022 | 4.9 |
| 13/06/2022 | 4.9 |
| 13/06/2022 | 4.8 |
| 13/06/2022 | 4.8 |
| 13/06/2022 | 4.8 |
| 13/06/2022 | 4.8 |
| 13/06/2022 | 4.3 |
| 13/06/2022 | 3.9 |
| 13/06/2022 | 3.6 |
| 13/06/2022 | 3.2 |
| 13/06/2022 | 2.8 |
| 14/06/2022 | 2.6 |
| 14/06/2022 | 2.5 |
| 14/06/2022 | 2.5 |
| 14/06/2022 | 2.6 |
| 14/06/2022 | 2.8 |
| 14/06/2022 | 3.5 |
| 14/06/2022 | 4.1 |
| 14/06/2022 | 4.6 |
| 14/06/2022 | 4.8 |
| 14/06/2022 | 5 |
| 14/06/2022 | 5.1 |
| 14/06/2022 | 5.1 |
| 14/06/2022 | 5.1 |
| 14/06/2022 | 5 |
| 14/06/2022 | 4.9 |
| 14/06/2022 | 4.8 |
| 14/06/2022 | 4.8 |
| 14/06/2022 | 4.9 |
| 14/06/2022 | 4.8 |
| 14/06/2022 | 4.4 |
| 14/06/2022 | 4 |
| 14/06/2022 | 3.7 |
| 14/06/2022 | 3.2 |
| 14/06/2022 | 2.8 |
| 15/06/2022 | 2.6 |
| 15/06/2022 | 2.5 |
| 15/06/2022 | 2.5 |
| 15/06/2022 | 2.6 |
| 15/06/2022 | 2.8 |
| 15/06/2022 | 3.5 |
| 15/06/2022 | 4.1 |
| 15/06/2022 | 4.6 |
| 15/06/2022 | 4.8 |
| 15/06/2022 | 5 |
| 15/06/2022 | 5 |
| 15/06/2022 | 5.1 |
| 15/06/2022 | 5 |
| 15/06/2022 | 5 |
| 15/06/2022 | 4.9 |
| 15/06/2022 | 4.8 |
| 15/06/2022 | 4.8 |
| 15/06/2022 | 4.9 |
| 15/06/2022 | 4.8 |
| 15/06/2022 | 4.4 |
| 15/06/2022 | 4 |
| 15/06/2022 | 3.6 |
| 15/06/2022 | 3.2 |
| 15/06/2022 | 2.8 |
| 16/06/2022 | 2.6 |
| 16/06/2022 | 2.5 |
| 16/06/2022 | 2.5 |
| 16/06/2022 | 2.6 |
| 16/06/2022 | 2.8 |
| 16/06/2022 | 3.5 |
| 16/06/2022 | 4.1 |
| 16/06/2022 | 4.6 |
| 16/06/2022 | 4.8 |
| 16/06/2022 | 5 |
| 16/06/2022 | 5 |
| 16/06/2022 | 5.1 |
| 16/06/2022 | 5 |
| 16/06/2022 | 5 |
| 16/06/2022 | 4.9 |
| 16/06/2022 | 4.8 |
| 16/06/2022 | 4.8 |
| 16/06/2022 | 4.8 |
| 16/06/2022 | 4.7 |
| 16/06/2022 | 4.3 |
| 16/06/2022 | 3.9 |
| 16/06/2022 | 3.6 |
| 16/06/2022 | 3.2 |
| 16/06/2022 | 2.8 |
| 17/06/2022 | 2.6 |
| 17/06/2022 | 2.5 |
| 17/06/2022 | 2.5 |
| 17/06/2022 | 2.6 |
| 17/06/2022 | 2.8 |
| 17/06/2022 | 3.4 |
| 17/06/2022 | 4.1 |
| 17/06/2022 | 4.5 |
| 17/06/2022 | 4.8 |
| 17/06/2022 | 5 |
| 17/06/2022 | 5 |
| 17/06/2022 | 5 |
| 17/06/2022 | 4.9 |
| 17/06/2022 | 4.8 |
| 17/06/2022 | 4.8 |
| 17/06/2022 | 4.7 |
| 17/06/2022 | 4.6 |
| 17/06/2022 | 4.6 |
| 17/06/2022 | 4.5 |
| 17/06/2022 | 4.1 |
| 17/06/2022 | 3.8 |
| 17/06/2022 | 3.5 |
| 17/06/2022 | 3.1 |
| 17/06/2022 | 2.8 |
| 18/06/2022 | 2.6 |
| 18/06/2022 | 2.5 |
| 18/06/2022 | 2.4 |
| 18/06/2022 | 2.4 |
| 18/06/2022 | 2.4 |
| 18/06/2022 | 2.6 |
| 18/06/2022 | 2.9 |
| 18/06/2022 | 3.3 |
| 18/06/2022 | 3.7 |
| 18/06/2022 | 4 |
| 18/06/2022 | 4.1 |
| 18/06/2022 | 4.1 |
| 18/06/2022 | 4.1 |
| 18/06/2022 | 4 |
| 18/06/2022 | 3.9 |
| 18/06/2022 | 3.8 |
| 18/06/2022 | 3.8 |
| 18/06/2022 | 3.9 |
| 18/06/2022 | 3.9 |
| 18/06/2022 | 3.6 |
| 18/06/2022 | 3.4 |
| 18/06/2022 | 3.2 |
| 18/06/2022 | 2.9 |
| 18/06/2022 | 2.7 |
| 19/06/2022 | 2.5 |
| 19/06/2022 | 2.4 |
| 19/06/2022 | 2.3 |
| 19/06/2022 | 2.3 |
| 19/06/2022 | 2.2 |
| 19/06/2022 | 2.3 |
| 19/06/2022 | 2.5 |
| 19/06/2022 | 2.8 |
| 19/06/2022 | 3.2 |
| 19/06/2022 | 3.4 |
| 19/06/2022 | 3.6 |
| 19/06/2022 | 3.7 |
| 19/06/2022 | 3.7 |
| 19/06/2022 | 3.6 |
| 19/06/2022 | 3.5 |
| 19/06/2022 | 3.5 |
| 19/06/2022 | 3.6 |
| 19/06/2022 | 3.7 |
| 19/06/2022 | 3.6 |
| 19/06/2022 | 3.5 |
| 19/06/2022 | 3.4 |
| 19/06/2022 | 3.3 |
| 19/06/2022 | 3 |
| 19/06/2022 | 2.7 |
| 20/06/2022 | 2.5 |
| 20/06/2022 | 2.4 |
| 20/06/2022 | 2.4 |
| 20/06/2022 | 2.5 |
| 20/06/2022 | 2.8 |
| 20/06/2022 | 3.4 |
| 20/06/2022 | 4 |
| 20/06/2022 | 4.5 |
| 20/06/2022 | 4.7 |
| 20/06/2022 | 4.9 |
| 20/06/2022 | 5 |
| 20/06/2022 | 5 |
| 20/06/2022 | 5 |
| 20/06/2022 | 4.9 |
| 20/06/2022 | 4.8 |
| 20/06/2022 | 4.7 |
| 20/06/2022 | 4.8 |
| 20/06/2022 | 4.8 |
| 20/06/2022 | 4.7 |
| 20/06/2022 | 4.3 |
| 20/06/2022 | 3.9 |
| 20/06/2022 | 3.6 |
| 20/06/2022 | 3.2 |
| 20/06/2022 | 2.8 |
| 21/06/2022 | 2.6 |
| 21/06/2022 | 2.5 |
| 21/06/2022 | 2.5 |
| 21/06/2022 | 2.6 |
| 21/06/2022 | 2.8 |
| 21/06/2022 | 3.5 |
| 21/06/2022 | 4.1 |
| 21/06/2022 | 4.5 |
| 21/06/2022 | 4.8 |
| 21/06/2022 | 4.9 |
| 21/06/2022 | 5 |
| 21/06/2022 | 5.1 |
| 21/06/2022 | 5 |
| 21/06/2022 | 4.9 |
| 21/06/2022 | 4.9 |
| 21/06/2022 | 4.8 |
| 21/06/2022 | 4.8 |
| 21/06/2022 | 4.8 |
| 21/06/2022 | 4.7 |
| 21/06/2022 | 4.3 |
| 21/06/2022 | 4 |
| 21/06/2022 | 3.6 |
| 21/06/2022 | 3.2 |
| 21/06/2022 | 2.8 |
| 22/06/2022 | 2.6 |
| 22/06/2022 | 2.5 |
| 22/06/2022 | 2.5 |
| 22/06/2022 | 2.6 |
| 22/06/2022 | 2.8 |
| 22/06/2022 | 3.5 |
| 22/06/2022 | 4.1 |
| 22/06/2022 | 4.5 |
| 22/06/2022 | 4.8 |
| 22/06/2022 | 4.9 |
| 22/06/2022 | 5 |
| 22/06/2022 | 5 |
| 22/06/2022 | 5 |
| 22/06/2022 | 4.9 |
| 22/06/2022 | 4.8 |
| 22/06/2022 | 4.8 |
| 22/06/2022 | 4.8 |
| 22/06/2022 | 4.8 |
| 22/06/2022 | 4.7 |
| 22/06/2022 | 4.3 |
| 22/06/2022 | 3.9 |
| 22/06/2022 | 3.6 |
| 22/06/2022 | 3.2 |
| 22/06/2022 | 2.8 |
| 23/06/2022 | 2.6 |
| 23/06/2022 | 2.5 |
| 23/06/2022 | 2.5 |
| 23/06/2022 | 2.6 |
| 23/06/2022 | 2.8 |
| 23/06/2022 | 3.5 |
| 23/06/2022 | 4.1 |
| 23/06/2022 | 4.5 |
| 23/06/2022 | 4.8 |
| 23/06/2022 | 4.9 |
| 23/06/2022 | 5 |
| 23/06/2022 | 5 |
| 23/06/2022 | 5 |
| 23/06/2022 | 4.9 |
| 23/06/2022 | 4.8 |
| 23/06/2022 | 4.8 |
| 23/06/2022 | 4.8 |
| 23/06/2022 | 4.8 |
| 23/06/2022 | 4.7 |
| 23/06/2022 | 4.3 |
| 23/06/2022 | 3.9 |
| 23/06/2022 | 3.6 |
| 23/06/2022 | 3.2 |
| 23/06/2022 | 2.8 |
| 24/06/2022 | 2.6 |
| 24/06/2022 | 2.5 |
| 24/06/2022 | 2.5 |
| 24/06/2022 | 2.6 |
| 24/06/2022 | 2.8 |
| 24/06/2022 | 3.4 |
| 24/06/2022 | 4 |
| 24/06/2022 | 4.5 |
| 24/06/2022 | 4.7 |
| 24/06/2022 | 4.9 |
| 24/06/2022 | 5 |
| 24/06/2022 | 5 |
| 24/06/2022 | 4.9 |
| 24/06/2022 | 4.8 |
| 24/06/2022 | 4.7 |
| 24/06/2022 | 4.6 |
| 24/06/2022 | 4.6 |
| 24/06/2022 | 4.6 |
| 24/06/2022 | 4.4 |
| 24/06/2022 | 4.1 |
| 24/06/2022 | 3.7 |
| 24/06/2022 | 3.4 |
| 24/06/2022 | 3.1 |
| 24/06/2022 | 2.8 |
| 25/06/2022 | 2.6 |
| 25/06/2022 | 2.5 |
| 25/06/2022 | 2.4 |
| 25/06/2022 | 2.4 |
| 25/06/2022 | 2.4 |
| 25/06/2022 | 2.6 |
| 25/06/2022 | 2.8 |
| 25/06/2022 | 3.3 |
| 25/06/2022 | 3.7 |
| 25/06/2022 | 4 |
| 25/06/2022 | 4.1 |
| 25/06/2022 | 4.1 |
| 25/06/2022 | 4 |
| 25/06/2022 | 3.9 |
| 25/06/2022 | 3.9 |
| 25/06/2022 | 3.8 |
| 25/06/2022 | 3.8 |
| 25/06/2022 | 3.9 |
| 25/06/2022 | 3.8 |
| 25/06/2022 | 3.6 |
| 25/06/2022 | 3.4 |
| 25/06/2022 | 3.2 |
| 25/06/2022 | 2.9 |
| 25/06/2022 | 2.7 |
| 26/06/2022 | 2.5 |
| 26/06/2022 | 2.4 |
| 26/06/2022 | 2.3 |
| 26/06/2022 | 2.3 |
| 26/06/2022 | 2.2 |
| 26/06/2022 | 2.3 |
| 26/06/2022 | 2.5 |
| 26/06/2022 | 2.8 |
| 26/06/2022 | 3.1 |
| 26/06/2022 | 3.4 |
| 26/06/2022 | 3.6 |
| 26/06/2022 | 3.7 |
| 26/06/2022 | 3.6 |
| 26/06/2022 | 3.6 |
| 26/06/2022 | 3.5 |
| 26/06/2022 | 3.5 |
| 26/06/2022 | 3.5 |
| 26/06/2022 | 3.6 |
| 26/06/2022 | 3.6 |
| 26/06/2022 | 3.4 |
| 26/06/2022 | 3.4 |
| 26/06/2022 | 3.2 |
| 26/06/2022 | 2.9 |
| 26/06/2022 | 2.7 |
| 27/06/2022 | 2.5 |
| 27/06/2022 | 2.4 |
| 27/06/2022 | 2.4 |
| 27/06/2022 | 2.5 |
| 27/06/2022 | 2.7 |
| 27/06/2022 | 3.4 |
| 27/06/2022 | 4 |
| 27/06/2022 | 4.4 |
| 27/06/2022 | 4.7 |
| 27/06/2022 | 4.9 |
| 27/06/2022 | 4.9 |
| 27/06/2022 | 5 |
| 27/06/2022 | 4.9 |
| 27/06/2022 | 4.9 |
| 27/06/2022 | 4.8 |
| 27/06/2022 | 4.7 |
| 27/06/2022 | 4.7 |
| 27/06/2022 | 4.8 |
| 27/06/2022 | 4.7 |
| 27/06/2022 | 4.3 |
| 27/06/2022 | 3.9 |
| 27/06/2022 | 3.6 |
| 27/06/2022 | 3.1 |
| 27/06/2022 | 2.8 |
| 28/06/2022 | 2.6 |
| 28/06/2022 | 2.5 |
| 28/06/2022 | 2.4 |
| 28/06/2022 | 2.6 |
| 28/06/2022 | 2.8 |
| 28/06/2022 | 3.5 |
| 28/06/2022 | 4.1 |
| 28/06/2022 | 4.5 |
| 28/06/2022 | 4.7 |
| 28/06/2022 | 4.9 |
| 28/06/2022 | 5 |
| 28/06/2022 | 5 |
| 28/06/2022 | 5 |
| 28/06/2022 | 4.9 |
| 28/06/2022 | 4.8 |
| 28/06/2022 | 4.8 |
| 28/06/2022 | 4.8 |
| 28/06/2022 | 4.8 |
| 28/06/2022 | 4.7 |
| 28/06/2022 | 4.3 |
| 28/06/2022 | 3.9 |
| 28/06/2022 | 3.6 |
| 28/06/2022 | 3.1 |
| 28/06/2022 | 2.8 |
| 29/06/2022 | 2.6 |
| 29/06/2022 | 2.5 |
| 29/06/2022 | 2.5 |
| 29/06/2022 | 2.6 |
| 29/06/2022 | 2.8 |
| 29/06/2022 | 3.5 |
| 29/06/2022 | 4.1 |
| 29/06/2022 | 4.5 |
| 29/06/2022 | 4.7 |
| 29/06/2022 | 4.9 |
| 29/06/2022 | 5 |
| 29/06/2022 | 5 |
| 29/06/2022 | 5 |
| 29/06/2022 | 4.9 |
| 29/06/2022 | 4.8 |
| 29/06/2022 | 4.7 |
| 29/06/2022 | 4.8 |
| 29/06/2022 | 4.8 |
| 29/06/2022 | 4.7 |
| 29/06/2022 | 4.3 |
| 29/06/2022 | 3.9 |
| 29/06/2022 | 3.6 |
| 29/06/2022 | 3.1 |
| 29/06/2022 | 2.8 |
| 30/06/2022 | 2.6 |
| 30/06/2022 | 2.5 |
| 30/06/2022 | 2.5 |
| 30/06/2022 | 2.6 |
| 30/06/2022 | 2.8 |
| 30/06/2022 | 3.4 |
| 30/06/2022 | 4.1 |
| 30/06/2022 | 4.5 |
| 30/06/2022 | 4.7 |
| 30/06/2022 | 4.9 |
| 30/06/2022 | 5 |
| 30/06/2022 | 5 |
| 30/06/2022 | 5 |
| 30/06/2022 | 4.9 |
| 30/06/2022 | 4.8 |
| 30/06/2022 | 4.7 |
| 30/06/2022 | 4.7 |
| 30/06/2022 | 4.7 |
| 30/06/2022 | 4.6 |
| 30/06/2022 | 4.2 |
| 30/06/2022 | 3.9 |
| 30/06/2022 | 3.6 |
| 30/06/2022 | 3.1 |
| 30/06/2022 | 2.8 |
| 01/07/2022 | 2.6 |
| 01/07/2022 | 2.5 |
| 01/07/2022 | 2.4 |
| 01/07/2022 | 2.6 |
| 01/07/2022 | 2.8 |
| 01/07/2022 | 3.4 |
| 01/07/2022 | 4 |
| 01/07/2022 | 4.5 |
| 01/07/2022 | 4.7 |
| 01/07/2022 | 4.9 |
| 01/07/2022 | 4.9 |
| 01/07/2022 | 4.9 |
| 01/07/2022 | 4.9 |
| 01/07/2022 | 4.8 |
| 01/07/2022 | 4.7 |
| 01/07/2022 | 4.6 |
| 01/07/2022 | 4.5 |
| 01/07/2022 | 4.5 |
| 01/07/2022 | 4.4 |
| 01/07/2022 | 4 |
| 01/07/2022 | 3.7 |
| 01/07/2022 | 3.4 |
| 01/07/2022 | 3 |
| 01/07/2022 | 2.8 |
| 02/07/2022 | 2.6 |
| 02/07/2022 | 2.5 |
| 02/07/2022 | 2.4 |
| 02/07/2022 | 2.4 |
| 02/07/2022 | 2.4 |
| 02/07/2022 | 2.5 |
| 02/07/2022 | 2.8 |
| 02/07/2022 | 3.2 |
| 02/07/2022 | 3.6 |
| 02/07/2022 | 3.9 |
| 02/07/2022 | 4 |
| 02/07/2022 | 4.1 |
| 02/07/2022 | 4 |
| 02/07/2022 | 3.9 |
| 02/07/2022 | 3.8 |
| 02/07/2022 | 3.8 |
| 02/07/2022 | 3.8 |
| 02/07/2022 | 3.8 |
| 02/07/2022 | 3.8 |
| 02/07/2022 | 3.5 |
| 02/07/2022 | 3.4 |
| 02/07/2022 | 3.2 |
| 02/07/2022 | 2.9 |
| 02/07/2022 | 2.7 |
| 03/07/2022 | 2.5 |
| 03/07/2022 | 2.4 |
| 03/07/2022 | 2.3 |
| 03/07/2022 | 2.3 |
| 03/07/2022 | 2.2 |
| 03/07/2022 | 2.3 |
| 03/07/2022 | 2.5 |
| 03/07/2022 | 2.8 |
| 03/07/2022 | 3.1 |
| 03/07/2022 | 3.4 |
| 03/07/2022 | 3.6 |
| 03/07/2022 | 3.7 |
| 03/07/2022 | 3.6 |
| 03/07/2022 | 3.5 |
| 03/07/2022 | 3.5 |
| 03/07/2022 | 3.5 |
| 03/07/2022 | 3.5 |
| 03/07/2022 | 3.6 |
| 03/07/2022 | 3.6 |
| 03/07/2022 | 3.4 |
| 03/07/2022 | 3.3 |
| 03/07/2022 | 3.2 |
| 03/07/2022 | 2.9 |
| 03/07/2022 | 2.6 |
| 04/07/2022 | 2.4 |
| 04/07/2022 | 2.4 |
| 04/07/2022 | 2.4 |
| 04/07/2022 | 2.5 |
| 04/07/2022 | 2.7 |
| 04/07/2022 | 3.4 |
| 04/07/2022 | 4 |
| 04/07/2022 | 4.4 |
| 04/07/2022 | 4.6 |
| 04/07/2022 | 4.8 |
| 04/07/2022 | 4.9 |
| 04/07/2022 | 4.9 |
| 04/07/2022 | 4.9 |
| 04/07/2022 | 4.8 |
| 04/07/2022 | 4.7 |
| 04/07/2022 | 4.7 |
| 04/07/2022 | 4.7 |
| 04/07/2022 | 4.7 |
| 04/07/2022 | 4.6 |
| 04/07/2022 | 4.2 |
| 04/07/2022 | 3.9 |
| 04/07/2022 | 3.5 |
| 04/07/2022 | 3.1 |
| 04/07/2022 | 2.8 |
| 05/07/2022 | 2.5 |
| 05/07/2022 | 2.4 |
| 05/07/2022 | 2.4 |
| 05/07/2022 | 2.6 |
| 05/07/2022 | 2.8 |
| 05/07/2022 | 3.4 |
| 05/07/2022 | 4 |
| 05/07/2022 | 4.5 |
| 05/07/2022 | 4.7 |
| 05/07/2022 | 4.9 |
| 05/07/2022 | 4.9 |
| 05/07/2022 | 5 |
| 05/07/2022 | 4.9 |
| 05/07/2022 | 4.8 |
| 05/07/2022 | 4.8 |
| 05/07/2022 | 4.7 |
| 05/07/2022 | 4.7 |
| 05/07/2022 | 4.7 |
| 05/07/2022 | 4.7 |
| 05/07/2022 | 4.2 |
| 05/07/2022 | 3.9 |
| 05/07/2022 | 3.6 |
| 05/07/2022 | 3.1 |
| 05/07/2022 | 2.8 |
| 06/07/2022 | 2.6 |
| 06/07/2022 | 2.5 |
| 06/07/2022 | 2.4 |
| 06/07/2022 | 2.6 |
| 06/07/2022 | 2.8 |
| 06/07/2022 | 3.4 |
| 06/07/2022 | 4.1 |
| 06/07/2022 | 4.5 |
| 06/07/2022 | 4.7 |
| 06/07/2022 | 4.8 |
| 06/07/2022 | 4.9 |
| 06/07/2022 | 5 |
| 06/07/2022 | 4.9 |
| 06/07/2022 | 4.8 |
| 06/07/2022 | 4.8 |
| 06/07/2022 | 4.7 |
| 06/07/2022 | 4.7 |
| 06/07/2022 | 4.7 |
| 06/07/2022 | 4.7 |
| 06/07/2022 | 4.2 |
| 06/07/2022 | 3.9 |
| 06/07/2022 | 3.5 |
| 06/07/2022 | 3.1 |
| 06/07/2022 | 2.8 |
| 07/07/2022 | 2.5 |
| 07/07/2022 | 2.4 |
| 07/07/2022 | 2.4 |
| 07/07/2022 | 2.5 |
| 07/07/2022 | 2.8 |
| 07/07/2022 | 3.3 |
| 07/07/2022 | 3.9 |
| 07/07/2022 | 4.3 |
| 07/07/2022 | 4.5 |
| 07/07/2022 | 4.7 |
| 07/07/2022 | 4.8 |
| 07/07/2022 | 4.8 |
| 07/07/2022 | 4.8 |
| 07/07/2022 | 4.7 |
| 07/07/2022 | 4.6 |
| 07/07/2022 | 4.6 |
| 07/07/2022 | 4.5 |
| 07/07/2022 | 4.5 |
| 07/07/2022 | 4.4 |
| 07/07/2022 | 4.1 |
| 07/07/2022 | 3.8 |
| 07/07/2022 | 3.5 |
| 07/07/2022 | 3.1 |
| 07/07/2022 | 2.8 |
| 08/07/2022 | 2.5 |
| 08/07/2022 | 2.4 |
| 08/07/2022 | 2.4 |
| 08/07/2022 | 2.5 |
| 08/07/2022 | 2.7 |
| 08/07/2022 | 3.2 |
| 08/07/2022 | 3.8 |
| 08/07/2022 | 4.2 |
| 08/07/2022 | 4.5 |
| 08/07/2022 | 4.7 |
| 08/07/2022 | 4.8 |
| 08/07/2022 | 4.8 |
| 08/07/2022 | 4.7 |
| 08/07/2022 | 4.6 |
| 08/07/2022 | 4.5 |
| 08/07/2022 | 4.4 |
| 08/07/2022 | 4.4 |
| 08/07/2022 | 4.3 |
| 08/07/2022 | 4.2 |
| 08/07/2022 | 3.9 |
| 08/07/2022 | 3.6 |
| 08/07/2022 | 3.3 |
| 08/07/2022 | 3 |
| 08/07/2022 | 2.7 |
| 09/07/2022 | 2.6 |
| 09/07/2022 | 2.4 |
| 09/07/2022 | 2.4 |
| 09/07/2022 | 2.3 |
| 09/07/2022 | 2.3 |
| 09/07/2022 | 2.4 |
| 09/07/2022 | 2.7 |
| 09/07/2022 | 3.1 |
| 09/07/2022 | 3.5 |
| 09/07/2022 | 3.8 |
| 09/07/2022 | 3.9 |
| 09/07/2022 | 3.9 |
| 09/07/2022 | 3.8 |
| 09/07/2022 | 3.7 |
| 09/07/2022 | 3.7 |
| 09/07/2022 | 3.6 |
| 09/07/2022 | 3.6 |
| 09/07/2022 | 3.6 |
| 09/07/2022 | 3.6 |
| 09/07/2022 | 3.4 |
| 09/07/2022 | 3.3 |
| 09/07/2022 | 3.1 |
| 09/07/2022 | 2.8 |
| 09/07/2022 | 2.6 |
| 10/07/2022 | 2.5 |
| 10/07/2022 | 2.3 |
| 10/07/2022 | 2.3 |
| 10/07/2022 | 2.2 |
| 10/07/2022 | 2.2 |
| 10/07/2022 | 2.2 |
| 10/07/2022 | 2.3 |
| 10/07/2022 | 2.6 |
| 10/07/2022 | 3 |
| 10/07/2022 | 3.3 |
| 10/07/2022 | 3.4 |
| 10/07/2022 | 3.6 |
| 10/07/2022 | 3.5 |
| 10/07/2022 | 3.4 |
| 10/07/2022 | 3.3 |
| 10/07/2022 | 3.3 |
| 10/07/2022 | 3.4 |
| 10/07/2022 | 3.4 |
| 10/07/2022 | 3.4 |
| 10/07/2022 | 3.3 |
| 10/07/2022 | 3.2 |
| 10/07/2022 | 3.1 |
| 10/07/2022 | 2.9 |
| 10/07/2022 | 2.6 |
| 11/07/2022 | 2.4 |
| 11/07/2022 | 2.3 |
| 11/07/2022 | 2.3 |
| 11/07/2022 | 2.5 |
| 11/07/2022 | 2.7 |
| 11/07/2022 | 3.2 |
| 11/07/2022 | 3.8 |
| 11/07/2022 | 4.2 |
| 11/07/2022 | 4.4 |
| 11/07/2022 | 4.6 |
| 11/07/2022 | 4.7 |
| 11/07/2022 | 4.8 |
| 11/07/2022 | 4.7 |
| 11/07/2022 | 4.6 |
| 11/07/2022 | 4.6 |
| 11/07/2022 | 4.5 |
| 11/07/2022 | 4.5 |
| 11/07/2022 | 4.5 |
| 11/07/2022 | 4.4 |
| 11/07/2022 | 4.1 |
| 11/07/2022 | 3.8 |
| 11/07/2022 | 3.4 |
| 11/07/2022 | 3 |
| 11/07/2022 | 2.7 |
| 12/07/2022 | 2.5 |
| 12/07/2022 | 2.4 |
| 12/07/2022 | 2.4 |
| 12/07/2022 | 2.5 |
| 12/07/2022 | 2.8 |
| 12/07/2022 | 3.3 |
| 12/07/2022 | 3.8 |
| 12/07/2022 | 4.3 |
| 12/07/2022 | 4.5 |
| 12/07/2022 | 4.7 |
| 12/07/2022 | 4.8 |
| 12/07/2022 | 4.8 |
| 12/07/2022 | 4.8 |
| 12/07/2022 | 4.7 |
| 12/07/2022 | 4.6 |
| 12/07/2022 | 4.5 |
| 12/07/2022 | 4.5 |
| 12/07/2022 | 4.5 |
| 12/07/2022 | 4.4 |
| 12/07/2022 | 4.1 |
| 12/07/2022 | 3.8 |
| 12/07/2022 | 3.5 |
| 12/07/2022 | 3.1 |
| 12/07/2022 | 2.8 |
| 13/07/2022 | 2.5 |
| 13/07/2022 | 2.4 |
| 13/07/2022 | 2.4 |
| 13/07/2022 | 2.5 |
| 13/07/2022 | 2.8 |
| 13/07/2022 | 3.3 |
| 13/07/2022 | 3.8 |
| 13/07/2022 | 4.2 |
| 13/07/2022 | 4.5 |
| 13/07/2022 | 4.7 |
| 13/07/2022 | 4.8 |
| 13/07/2022 | 4.8 |
| 13/07/2022 | 4.8 |
| 13/07/2022 | 4.7 |
| 13/07/2022 | 4.6 |
| 13/07/2022 | 4.5 |
| 13/07/2022 | 4.5 |
| 13/07/2022 | 4.5 |
| 13/07/2022 | 4.4 |
| 13/07/2022 | 4.1 |
| 13/07/2022 | 3.8 |
| 13/07/2022 | 3.5 |
| 13/07/2022 | 3.1 |
| 13/07/2022 | 2.8 |
| 14/07/2022 | 2.5 |
| 14/07/2022 | 2.4 |
| 14/07/2022 | 2.4 |
| 14/07/2022 | 2.5 |
| 14/07/2022 | 2.8 |
| 14/07/2022 | 3.3 |
| 14/07/2022 | 3.8 |
| 14/07/2022 | 4.2 |
| 14/07/2022 | 4.5 |
| 14/07/2022 | 4.7 |
| 14/07/2022 | 4.8 |
| 14/07/2022 | 4.8 |
| 14/07/2022 | 4.8 |
| 14/07/2022 | 4.7 |
| 14/07/2022 | 4.6 |
| 14/07/2022 | 4.5 |
| 14/07/2022 | 4.5 |
| 14/07/2022 | 4.5 |
| 14/07/2022 | 4.4 |
| 14/07/2022 | 4 |
| 14/07/2022 | 3.8 |
| 14/07/2022 | 3.4 |
| 14/07/2022 | 3 |
| 14/07/2022 | 2.8 |
| 15/07/2022 | 2.5 |
| 15/07/2022 | 2.4 |
| 15/07/2022 | 2.4 |
| 15/07/2022 | 2.5 |
| 15/07/2022 | 2.7 |
| 15/07/2022 | 3.2 |
| 15/07/2022 | 3.8 |
| 15/07/2022 | 4.2 |
| 15/07/2022 | 4.5 |
| 15/07/2022 | 4.7 |
| 15/07/2022 | 4.7 |
| 15/07/2022 | 4.8 |
| 15/07/2022 | 4.7 |
| 15/07/2022 | 4.5 |
| 15/07/2022 | 4.4 |
| 15/07/2022 | 4.4 |
| 15/07/2022 | 4.3 |
| 15/07/2022 | 4.3 |
| 15/07/2022 | 4.1 |
| 15/07/2022 | 3.8 |
| 15/07/2022 | 3.6 |
| 15/07/2022 | 3.3 |
| 15/07/2022 | 3 |
| 15/07/2022 | 2.7 |
| 16/07/2022 | 2.5 |
| 16/07/2022 | 2.4 |
| 16/07/2022 | 2.4 |
| 16/07/2022 | 2.3 |
| 16/07/2022 | 2.3 |
| 16/07/2022 | 2.4 |
| 16/07/2022 | 2.6 |
| 16/07/2022 | 3 |
| 16/07/2022 | 3.4 |
| 16/07/2022 | 3.8 |
| 16/07/2022 | 3.9 |
| 16/07/2022 | 3.9 |
| 16/07/2022 | 3.8 |
| 16/07/2022 | 3.7 |
| 16/07/2022 | 3.6 |
| 16/07/2022 | 3.6 |
| 16/07/2022 | 3.6 |
| 16/07/2022 | 3.6 |
| 16/07/2022 | 3.6 |
| 16/07/2022 | 3.4 |
| 16/07/2022 | 3.3 |
| 16/07/2022 | 3.1 |
| 16/07/2022 | 2.8 |
| 16/07/2022 | 2.6 |
| 17/07/2022 | 2.4 |
| 17/07/2022 | 2.3 |
| 17/07/2022 | 2.3 |
| 17/07/2022 | 2.2 |
| 17/07/2022 | 2.2 |
| 17/07/2022 | 2.2 |
| 17/07/2022 | 2.3 |
| 17/07/2022 | 2.6 |
| 17/07/2022 | 3 |
| 17/07/2022 | 3.2 |
| 17/07/2022 | 3.4 |
| 17/07/2022 | 3.5 |
| 17/07/2022 | 3.5 |
| 17/07/2022 | 3.4 |
| 17/07/2022 | 3.3 |
| 17/07/2022 | 3.3 |
| 17/07/2022 | 3.3 |
| 17/07/2022 | 3.4 |
| 17/07/2022 | 3.3 |
| 17/07/2022 | 3.2 |
| 17/07/2022 | 3.2 |
| 17/07/2022 | 3.1 |
| 17/07/2022 | 2.8 |
| 17/07/2022 | 2.6 |
| 18/07/2022 | 2.4 |
| 18/07/2022 | 2.3 |
| 18/07/2022 | 2.3 |
| 18/07/2022 | 2.5 |
| 18/07/2022 | 2.7 |
| 18/07/2022 | 3.2 |
| 18/07/2022 | 3.7 |
| 18/07/2022 | 4.1 |
| 18/07/2022 | 4.4 |
| 18/07/2022 | 4.6 |
| 18/07/2022 | 4.7 |
| 18/07/2022 | 4.8 |
| 18/07/2022 | 4.7 |
| 18/07/2022 | 4.6 |
| 18/07/2022 | 4.5 |
| 18/07/2022 | 4.4 |
| 18/07/2022 | 4.5 |
| 18/07/2022 | 4.5 |
| 18/07/2022 | 4.4 |
| 18/07/2022 | 4 |
| 18/07/2022 | 3.8 |
| 18/07/2022 | 3.4 |
| 18/07/2022 | 3 |
| 18/07/2022 | 2.7 |
| 19/07/2022 | 2.5 |
| 19/07/2022 | 2.4 |
| 19/07/2022 | 2.4 |
| 19/07/2022 | 2.5 |
| 19/07/2022 | 2.7 |
| 19/07/2022 | 3.3 |
| 19/07/2022 | 3.8 |
| 19/07/2022 | 4.2 |
| 19/07/2022 | 4.5 |
| 19/07/2022 | 4.7 |
| 19/07/2022 | 4.7 |
| 19/07/2022 | 4.8 |
| 19/07/2022 | 4.7 |
| 19/07/2022 | 4.6 |
| 19/07/2022 | 4.5 |
| 19/07/2022 | 4.5 |
| 19/07/2022 | 4.5 |
| 19/07/2022 | 4.5 |
| 19/07/2022 | 4.4 |
| 19/07/2022 | 4 |
| 19/07/2022 | 3.8 |
| 19/07/2022 | 3.4 |
| 19/07/2022 | 3 |
| 19/07/2022 | 2.7 |
| 20/07/2022 | 2.5 |
| 20/07/2022 | 2.4 |
| 20/07/2022 | 2.4 |
| 20/07/2022 | 2.5 |
| 20/07/2022 | 2.8 |
| 20/07/2022 | 3.3 |
| 20/07/2022 | 3.8 |
| 20/07/2022 | 4.2 |
| 20/07/2022 | 4.5 |
| 20/07/2022 | 4.6 |
| 20/07/2022 | 4.7 |
| 20/07/2022 | 4.8 |
| 20/07/2022 | 4.7 |
| 20/07/2022 | 4.6 |
| 20/07/2022 | 4.5 |
| 20/07/2022 | 4.5 |
| 20/07/2022 | 4.5 |
| 20/07/2022 | 4.5 |
| 20/07/2022 | 4.4 |
| 20/07/2022 | 4 |
| 20/07/2022 | 3.8 |
| 20/07/2022 | 3.4 |
| 20/07/2022 | 3 |
| 20/07/2022 | 2.7 |
| 21/07/2022 | 2.5 |
| 21/07/2022 | 2.4 |
| 21/07/2022 | 2.4 |
| 21/07/2022 | 2.5 |
| 21/07/2022 | 2.8 |
| 21/07/2022 | 3.3 |
| 21/07/2022 | 3.8 |
| 21/07/2022 | 4.2 |
| 21/07/2022 | 4.4 |
| 21/07/2022 | 4.6 |
| 21/07/2022 | 4.7 |
| 21/07/2022 | 4.8 |
| 21/07/2022 | 4.7 |
| 21/07/2022 | 4.6 |
| 21/07/2022 | 4.5 |
| 21/07/2022 | 4.5 |
| 21/07/2022 | 4.5 |
| 21/07/2022 | 4.4 |
| 21/07/2022 | 4.3 |
| 21/07/2022 | 4 |
| 21/07/2022 | 3.8 |
| 21/07/2022 | 3.4 |
| 21/07/2022 | 3 |
| 21/07/2022 | 2.7 |
| 22/07/2022 | 2.5 |
| 22/07/2022 | 2.4 |
| 22/07/2022 | 2.4 |
| 22/07/2022 | 2.5 |
| 22/07/2022 | 2.7 |
| 22/07/2022 | 3.2 |
| 22/07/2022 | 3.7 |
| 22/07/2022 | 4.2 |
| 22/07/2022 | 4.4 |
| 22/07/2022 | 4.6 |
| 22/07/2022 | 4.7 |
| 22/07/2022 | 4.7 |
| 22/07/2022 | 4.6 |
| 22/07/2022 | 4.5 |
| 22/07/2022 | 4.4 |
| 22/07/2022 | 4.3 |
| 22/07/2022 | 4.3 |
| 22/07/2022 | 4.2 |
| 22/07/2022 | 4.1 |
| 22/07/2022 | 3.8 |
| 22/07/2022 | 3.6 |
| 22/07/2022 | 3.3 |
| 22/07/2022 | 2.9 |
| 22/07/2022 | 2.7 |
| 23/07/2022 | 2.5 |
| 23/07/2022 | 2.4 |
| 23/07/2022 | 2.4 |
| 23/07/2022 | 2.3 |
| 23/07/2022 | 2.3 |
| 23/07/2022 | 2.4 |
| 23/07/2022 | 2.6 |
| 23/07/2022 | 3 |
| 23/07/2022 | 3.4 |
| 23/07/2022 | 3.7 |
| 23/07/2022 | 3.9 |
| 23/07/2022 | 3.9 |
| 23/07/2022 | 3.8 |
| 23/07/2022 | 3.7 |
| 23/07/2022 | 3.6 |
| 23/07/2022 | 3.6 |
| 23/07/2022 | 3.6 |
| 23/07/2022 | 3.6 |
| 23/07/2022 | 3.5 |
| 23/07/2022 | 3.3 |
| 23/07/2022 | 3.3 |
| 23/07/2022 | 3 |
| 23/07/2022 | 2.8 |
| 23/07/2022 | 2.6 |
| 24/07/2022 | 2.4 |
| 24/07/2022 | 2.3 |
| 24/07/2022 | 2.3 |
| 24/07/2022 | 2.2 |
| 24/07/2022 | 2.2 |
| 24/07/2022 | 2.2 |
| 24/07/2022 | 2.3 |
| 24/07/2022 | 2.6 |
| 24/07/2022 | 2.9 |
| 24/07/2022 | 3.2 |
| 24/07/2022 | 3.4 |
| 24/07/2022 | 3.5 |
| 24/07/2022 | 3.4 |
| 24/07/2022 | 3.3 |
| 24/07/2022 | 3.3 |
| 24/07/2022 | 3.3 |
| 24/07/2022 | 3.3 |
| 24/07/2022 | 3.4 |
| 24/07/2022 | 3.3 |
| 24/07/2022 | 3.2 |
| 24/07/2022 | 3.2 |
| 24/07/2022 | 3.1 |
| 24/07/2022 | 2.8 |
| 24/07/2022 | 2.6 |
| 25/07/2022 | 2.4 |
| 25/07/2022 | 2.3 |
| 25/07/2022 | 2.3 |
| 25/07/2022 | 2.5 |
| 25/07/2022 | 2.7 |
| 25/07/2022 | 3.2 |
| 25/07/2022 | 3.7 |
| 25/07/2022 | 4.1 |
| 25/07/2022 | 4.4 |
| 25/07/2022 | 4.6 |
| 25/07/2022 | 4.7 |
| 25/07/2022 | 4.7 |
| 25/07/2022 | 4.7 |
| 25/07/2022 | 4.6 |
| 25/07/2022 | 4.5 |
| 25/07/2022 | 4.4 |
| 25/07/2022 | 4.4 |
| 25/07/2022 | 4.4 |
| 25/07/2022 | 4.3 |
| 25/07/2022 | 4 |
| 25/07/2022 | 3.8 |
| 25/07/2022 | 3.4 |
| 25/07/2022 | 3 |
| 25/07/2022 | 2.7 |
| 26/07/2022 | 2.5 |
| 26/07/2022 | 2.4 |
| 26/07/2022 | 2.4 |
| 26/07/2022 | 2.5 |
| 26/07/2022 | 2.8 |
| 26/07/2022 | 3.3 |
| 26/07/2022 | 3.8 |
| 26/07/2022 | 4.2 |
| 26/07/2022 | 4.4 |
| 26/07/2022 | 4.6 |
| 26/07/2022 | 4.7 |
| 26/07/2022 | 4.8 |
| 26/07/2022 | 4.7 |
| 26/07/2022 | 4.6 |
| 26/07/2022 | 4.5 |
| 26/07/2022 | 4.5 |
| 26/07/2022 | 4.5 |
| 26/07/2022 | 4.5 |
| 26/07/2022 | 4.4 |
| 26/07/2022 | 4 |
| 26/07/2022 | 3.8 |
| 26/07/2022 | 3.4 |
| 26/07/2022 | 3 |
| 26/07/2022 | 2.7 |
| 27/07/2022 | 2.5 |
| 27/07/2022 | 2.4 |
| 27/07/2022 | 2.4 |
| 27/07/2022 | 2.5 |
| 27/07/2022 | 2.8 |
| 27/07/2022 | 3.3 |
| 27/07/2022 | 3.8 |
| 27/07/2022 | 4.2 |
| 27/07/2022 | 4.4 |
| 27/07/2022 | 4.6 |
| 27/07/2022 | 4.7 |
| 27/07/2022 | 4.8 |
| 27/07/2022 | 4.7 |
| 27/07/2022 | 4.6 |
| 27/07/2022 | 4.5 |
| 27/07/2022 | 4.5 |
| 27/07/2022 | 4.5 |
| 27/07/2022 | 4.5 |
| 27/07/2022 | 4.4 |
| 27/07/2022 | 4 |
| 27/07/2022 | 3.8 |
| 27/07/2022 | 3.4 |
| 27/07/2022 | 3 |
| 27/07/2022 | 2.7 |
| 28/07/2022 | 2.5 |
| 28/07/2022 | 2.4 |
| 28/07/2022 | 2.4 |
| 28/07/2022 | 2.5 |
| 28/07/2022 | 2.8 |
| 28/07/2022 | 3.3 |
| 28/07/2022 | 3.8 |
| 28/07/2022 | 4.2 |
| 28/07/2022 | 4.4 |
| 28/07/2022 | 4.6 |
| 28/07/2022 | 4.7 |
| 28/07/2022 | 4.8 |
| 28/07/2022 | 4.7 |
| 28/07/2022 | 4.6 |
| 28/07/2022 | 4.5 |
| 28/07/2022 | 4.5 |
| 28/07/2022 | 4.5 |
| 28/07/2022 | 4.4 |
| 28/07/2022 | 4.3 |
| 28/07/2022 | 4 |
| 28/07/2022 | 3.8 |
| 28/07/2022 | 3.4 |
| 28/07/2022 | 3 |
| 28/07/2022 | 2.7 |
| 29/07/2022 | 2.5 |
| 29/07/2022 | 2.4 |
| 29/07/2022 | 2.4 |
| 29/07/2022 | 2.5 |
| 29/07/2022 | 2.7 |
| 29/07/2022 | 3.2 |
| 29/07/2022 | 3.7 |
| 29/07/2022 | 4.2 |
| 29/07/2022 | 4.4 |
| 29/07/2022 | 4.6 |
| 29/07/2022 | 4.7 |
| 29/07/2022 | 4.7 |
| 29/07/2022 | 4.6 |
| 29/07/2022 | 4.5 |
| 29/07/2022 | 4.4 |
| 29/07/2022 | 4.3 |
| 29/07/2022 | 4.3 |
| 29/07/2022 | 4.2 |
| 29/07/2022 | 4.1 |
| 29/07/2022 | 3.8 |
| 29/07/2022 | 3.6 |
| 29/07/2022 | 3.2 |
| 29/07/2022 | 2.9 |
| 29/07/2022 | 2.7 |
| 30/07/2022 | 2.5 |
| 30/07/2022 | 2.4 |
| 30/07/2022 | 2.4 |
| 30/07/2022 | 2.3 |
| 30/07/2022 | 2.3 |
| 30/07/2022 | 2.4 |
| 30/07/2022 | 2.6 |
| 30/07/2022 | 3 |
| 30/07/2022 | 3.4 |
| 30/07/2022 | 3.7 |
| 30/07/2022 | 3.9 |
| 30/07/2022 | 3.9 |
| 30/07/2022 | 3.8 |
| 30/07/2022 | 3.7 |
| 30/07/2022 | 3.6 |
| 30/07/2022 | 3.6 |
| 30/07/2022 | 3.6 |
| 30/07/2022 | 3.6 |
| 30/07/2022 | 3.5 |
| 30/07/2022 | 3.4 |
| 30/07/2022 | 3.3 |
| 30/07/2022 | 3 |
| 30/07/2022 | 2.8 |
| 30/07/2022 | 2.6 |
| 31/07/2022 | 2.4 |
| 31/07/2022 | 2.3 |
| 31/07/2022 | 2.3 |
| 31/07/2022 | 2.2 |
| 31/07/2022 | 2.2 |
| 31/07/2022 | 2.2 |
| 31/07/2022 | 2.3 |
| 31/07/2022 | 2.6 |
| 31/07/2022 | 2.9 |
| 31/07/2022 | 3.2 |
| 31/07/2022 | 3.4 |
| 31/07/2022 | 3.5 |
| 31/07/2022 | 3.4 |
| 31/07/2022 | 3.3 |
| 31/07/2022 | 3.3 |
| 31/07/2022 | 3.3 |
| 31/07/2022 | 3.3 |
| 31/07/2022 | 3.4 |
| 31/07/2022 | 3.3 |
| 31/07/2022 | 3.3 |
| 31/07/2022 | 3.2 |
| 31/07/2022 | 3.1 |
| 31/07/2022 | 2.8 |
| 31/07/2022 | 2.6 |
| 01/08/2022 | 2.4 |
| 01/08/2022 | 2.3 |
| 01/08/2022 | 2.3 |
| 01/08/2022 | 2.5 |
| 01/08/2022 | 2.7 |
| 01/08/2022 | 3.2 |
| 01/08/2022 | 3.7 |
| 01/08/2022 | 4.1 |
| 01/08/2022 | 4.4 |
| 01/08/2022 | 4.6 |
| 01/08/2022 | 4.7 |
| 01/08/2022 | 4.7 |
| 01/08/2022 | 4.7 |
| 01/08/2022 | 4.6 |
| 01/08/2022 | 4.5 |
| 01/08/2022 | 4.4 |
| 01/08/2022 | 4.5 |
| 01/08/2022 | 4.4 |
| 01/08/2022 | 4.4 |
| 01/08/2022 | 4.1 |
| 01/08/2022 | 3.8 |
| 01/08/2022 | 3.4 |
| 01/08/2022 | 3 |
| 01/08/2022 | 2.7 |
| 02/08/2022 | 2.5 |
| 02/08/2022 | 2.4 |
| 02/08/2022 | 2.4 |
| 02/08/2022 | 2.5 |
| 02/08/2022 | 2.8 |
| 02/08/2022 | 3.3 |
| 02/08/2022 | 3.8 |
| 02/08/2022 | 4.2 |
| 02/08/2022 | 4.5 |
| 02/08/2022 | 4.7 |
| 02/08/2022 | 4.7 |
| 02/08/2022 | 4.8 |
| 02/08/2022 | 4.7 |
| 02/08/2022 | 4.6 |
| 02/08/2022 | 4.5 |
| 02/08/2022 | 4.5 |
| 02/08/2022 | 4.5 |
| 02/08/2022 | 4.5 |
| 02/08/2022 | 4.4 |
| 02/08/2022 | 4.1 |
| 02/08/2022 | 3.8 |
| 02/08/2022 | 3.4 |
| 02/08/2022 | 3 |
| 02/08/2022 | 2.7 |
| 03/08/2022 | 2.5 |
| 03/08/2022 | 2.4 |
| 03/08/2022 | 2.4 |
| 03/08/2022 | 2.5 |
| 03/08/2022 | 2.8 |
| 03/08/2022 | 3.3 |
| 03/08/2022 | 3.8 |
| 03/08/2022 | 4.2 |
| 03/08/2022 | 4.5 |
| 03/08/2022 | 4.7 |
| 03/08/2022 | 4.7 |
| 03/08/2022 | 4.8 |
| 03/08/2022 | 4.7 |
| 03/08/2022 | 4.6 |
| 03/08/2022 | 4.5 |
| 03/08/2022 | 4.5 |
| 03/08/2022 | 4.5 |
| 03/08/2022 | 4.5 |
| 03/08/2022 | 4.4 |
| 03/08/2022 | 4.1 |
| 03/08/2022 | 3.8 |
| 03/08/2022 | 3.4 |
| 03/08/2022 | 3 |
| 03/08/2022 | 2.7 |
| 04/08/2022 | 2.5 |
| 04/08/2022 | 2.4 |
| 04/08/2022 | 2.4 |
| 04/08/2022 | 2.5 |
| 04/08/2022 | 2.8 |
| 04/08/2022 | 3.3 |
| 04/08/2022 | 3.8 |
| 04/08/2022 | 4.2 |
| 04/08/2022 | 4.5 |
| 04/08/2022 | 4.7 |
| 04/08/2022 | 4.7 |
| 04/08/2022 | 4.8 |
| 04/08/2022 | 4.7 |
| 04/08/2022 | 4.6 |
| 04/08/2022 | 4.6 |
| 04/08/2022 | 4.5 |
| 04/08/2022 | 4.5 |
| 04/08/2022 | 4.4 |
| 04/08/2022 | 4.4 |
| 04/08/2022 | 4.1 |
| 04/08/2022 | 3.8 |
| 04/08/2022 | 3.4 |
| 04/08/2022 | 3 |
| 04/08/2022 | 2.7 |
| 05/08/2022 | 2.5 |
| 05/08/2022 | 2.4 |
| 05/08/2022 | 2.4 |
| 05/08/2022 | 2.5 |
| 05/08/2022 | 2.8 |
| 05/08/2022 | 3.2 |
| 05/08/2022 | 3.7 |
| 05/08/2022 | 4.2 |
| 05/08/2022 | 4.5 |
| 05/08/2022 | 4.7 |
| 05/08/2022 | 4.7 |
| 05/08/2022 | 4.7 |
| 05/08/2022 | 4.6 |
| 05/08/2022 | 4.5 |
| 05/08/2022 | 4.4 |
| 05/08/2022 | 4.4 |
| 05/08/2022 | 4.3 |
| 05/08/2022 | 4.2 |
| 05/08/2022 | 4.1 |
| 05/08/2022 | 3.9 |
| 05/08/2022 | 3.6 |
| 05/08/2022 | 3.2 |
| 05/08/2022 | 2.9 |
| 05/08/2022 | 2.7 |
| 06/08/2022 | 2.5 |
| 06/08/2022 | 2.4 |
| 06/08/2022 | 2.4 |
| 06/08/2022 | 2.3 |
| 06/08/2022 | 2.4 |
| 06/08/2022 | 2.4 |
| 06/08/2022 | 2.6 |
| 06/08/2022 | 3 |
| 06/08/2022 | 3.4 |
| 06/08/2022 | 3.7 |
| 06/08/2022 | 3.9 |
| 06/08/2022 | 3.9 |
| 06/08/2022 | 3.8 |
| 06/08/2022 | 3.7 |
| 06/08/2022 | 3.6 |
| 06/08/2022 | 3.6 |
| 06/08/2022 | 3.6 |
| 06/08/2022 | 3.6 |
| 06/08/2022 | 3.6 |
| 06/08/2022 | 3.4 |
| 06/08/2022 | 3.3 |
| 06/08/2022 | 3 |
| 06/08/2022 | 2.8 |
| 06/08/2022 | 2.6 |
| 07/08/2022 | 2.4 |
| 07/08/2022 | 2.3 |
| 07/08/2022 | 2.3 |
| 07/08/2022 | 2.2 |
| 07/08/2022 | 2.2 |
| 07/08/2022 | 2.2 |
| 07/08/2022 | 2.3 |
| 07/08/2022 | 2.6 |
| 07/08/2022 | 3 |
| 07/08/2022 | 3.2 |
| 07/08/2022 | 3.4 |
| 07/08/2022 | 3.5 |
| 07/08/2022 | 3.5 |
| 07/08/2022 | 3.4 |
| 07/08/2022 | 3.3 |
| 07/08/2022 | 3.3 |
| 07/08/2022 | 3.3 |
| 07/08/2022 | 3.4 |
| 07/08/2022 | 3.4 |
| 07/08/2022 | 3.3 |
| 07/08/2022 | 3.2 |
| 07/08/2022 | 3.1 |
| 07/08/2022 | 2.8 |
| 07/08/2022 | 2.6 |
| 08/08/2022 | 2.4 |
| 08/08/2022 | 2.3 |
| 08/08/2022 | 2.3 |
| 08/08/2022 | 2.5 |
| 08/08/2022 | 2.7 |
| 08/08/2022 | 3.2 |
| 08/08/2022 | 3.7 |
| 08/08/2022 | 4.1 |
| 08/08/2022 | 4.4 |
| 08/08/2022 | 4.6 |
| 08/08/2022 | 4.7 |
| 08/08/2022 | 4.8 |
| 08/08/2022 | 4.7 |
| 08/08/2022 | 4.6 |
| 08/08/2022 | 4.5 |
| 08/08/2022 | 4.4 |
| 08/08/2022 | 4.5 |
| 08/08/2022 | 4.4 |
| 08/08/2022 | 4.4 |
| 08/08/2022 | 4.1 |
| 08/08/2022 | 3.8 |
| 08/08/2022 | 3.4 |
| 08/08/2022 | 3 |
| 08/08/2022 | 2.7 |
| 09/08/2022 | 2.5 |
| 09/08/2022 | 2.4 |
| 09/08/2022 | 2.4 |
| 09/08/2022 | 2.5 |
| 09/08/2022 | 2.8 |
| 09/08/2022 | 3.3 |
| 09/08/2022 | 3.8 |
| 09/08/2022 | 4.2 |
| 09/08/2022 | 4.5 |
| 09/08/2022 | 4.7 |
| 09/08/2022 | 4.8 |
| 09/08/2022 | 4.8 |
| 09/08/2022 | 4.7 |
| 09/08/2022 | 4.6 |
| 09/08/2022 | 4.6 |
| 09/08/2022 | 4.5 |
| 09/08/2022 | 4.5 |
| 09/08/2022 | 4.5 |
| 09/08/2022 | 4.4 |
| 09/08/2022 | 4.2 |
| 09/08/2022 | 3.8 |
| 09/08/2022 | 3.4 |
| 09/08/2022 | 3 |
| 09/08/2022 | 2.7 |
| 10/08/2022 | 2.5 |
| 10/08/2022 | 2.4 |
| 10/08/2022 | 2.4 |
| 10/08/2022 | 2.5 |
| 10/08/2022 | 2.8 |
| 10/08/2022 | 3.3 |
| 10/08/2022 | 3.8 |
| 10/08/2022 | 4.2 |
| 10/08/2022 | 4.5 |
| 10/08/2022 | 4.7 |
| 10/08/2022 | 4.7 |
| 10/08/2022 | 4.8 |
| 10/08/2022 | 4.7 |
| 10/08/2022 | 4.6 |
| 10/08/2022 | 4.6 |
| 10/08/2022 | 4.5 |
| 10/08/2022 | 4.5 |
| 10/08/2022 | 4.5 |
| 10/08/2022 | 4.4 |
| 10/08/2022 | 4.2 |
| 10/08/2022 | 3.8 |
| 10/08/2022 | 3.4 |
| 10/08/2022 | 3 |
| 10/08/2022 | 2.7 |
| 11/08/2022 | 2.5 |
| 11/08/2022 | 2.4 |
| 11/08/2022 | 2.4 |
| 11/08/2022 | 2.5 |
| 11/08/2022 | 2.8 |
| 11/08/2022 | 3.3 |
| 11/08/2022 | 3.8 |
| 11/08/2022 | 4.2 |
| 11/08/2022 | 4.5 |
| 11/08/2022 | 4.7 |
| 11/08/2022 | 4.8 |
| 11/08/2022 | 4.8 |
| 11/08/2022 | 4.7 |
| 11/08/2022 | 4.6 |
| 11/08/2022 | 4.6 |
| 11/08/2022 | 4.5 |
| 11/08/2022 | 4.5 |
| 11/08/2022 | 4.4 |
| 11/08/2022 | 4.4 |
| 11/08/2022 | 4.2 |
| 11/08/2022 | 3.8 |
| 11/08/2022 | 3.4 |
| 11/08/2022 | 3 |
| 11/08/2022 | 2.7 |
| 12/08/2022 | 2.5 |
| 12/08/2022 | 2.4 |
| 12/08/2022 | 2.4 |
| 12/08/2022 | 2.5 |
| 12/08/2022 | 2.8 |
| 12/08/2022 | 3.2 |
| 12/08/2022 | 3.8 |
| 12/08/2022 | 4.2 |
| 12/08/2022 | 4.5 |
| 12/08/2022 | 4.7 |
| 12/08/2022 | 4.7 |
| 12/08/2022 | 4.8 |
| 12/08/2022 | 4.7 |
| 12/08/2022 | 4.5 |
| 12/08/2022 | 4.4 |
| 12/08/2022 | 4.4 |
| 12/08/2022 | 4.3 |
| 12/08/2022 | 4.2 |
| 12/08/2022 | 4.2 |
| 12/08/2022 | 4 |
| 12/08/2022 | 3.6 |
| 12/08/2022 | 3.2 |
| 12/08/2022 | 2.9 |
| 12/08/2022 | 2.7 |
| 13/08/2022 | 2.5 |
| 13/08/2022 | 2.4 |
| 13/08/2022 | 2.4 |
| 13/08/2022 | 2.3 |
| 13/08/2022 | 2.4 |
| 13/08/2022 | 2.4 |
| 13/08/2022 | 2.6 |
| 13/08/2022 | 3 |
| 13/08/2022 | 3.5 |
| 13/08/2022 | 3.8 |
| 13/08/2022 | 3.9 |
| 13/08/2022 | 3.9 |
| 13/08/2022 | 3.8 |
| 13/08/2022 | 3.7 |
| 13/08/2022 | 3.6 |
| 13/08/2022 | 3.6 |
| 13/08/2022 | 3.6 |
| 13/08/2022 | 3.6 |
| 13/08/2022 | 3.6 |
| 13/08/2022 | 3.5 |
| 13/08/2022 | 3.3 |
| 13/08/2022 | 3 |
| 13/08/2022 | 2.8 |
| 13/08/2022 | 2.6 |
| 14/08/2022 | 2.4 |
| 14/08/2022 | 2.3 |
| 14/08/2022 | 2.3 |
| 14/08/2022 | 2.2 |
| 14/08/2022 | 2.2 |
| 14/08/2022 | 2.2 |
| 14/08/2022 | 2.3 |
| 14/08/2022 | 2.6 |
| 14/08/2022 | 3 |
| 14/08/2022 | 3.2 |
| 14/08/2022 | 3.4 |
| 14/08/2022 | 3.5 |
| 14/08/2022 | 3.5 |
| 14/08/2022 | 3.4 |
| 14/08/2022 | 3.3 |
| 14/08/2022 | 3.3 |
| 14/08/2022 | 3.4 |
| 14/08/2022 | 3.4 |
| 14/08/2022 | 3.4 |
| 14/08/2022 | 3.4 |
| 14/08/2022 | 3.3 |
| 14/08/2022 | 3.1 |
| 14/08/2022 | 2.8 |
| 14/08/2022 | 2.6 |
| 15/08/2022 | 2.4 |
| 15/08/2022 | 2.3 |
| 15/08/2022 | 2.3 |
| 15/08/2022 | 2.5 |
| 15/08/2022 | 2.7 |
| 15/08/2022 | 3.2 |
| 15/08/2022 | 3.7 |
| 15/08/2022 | 4.2 |
| 15/08/2022 | 4.4 |
| 15/08/2022 | 4.6 |
| 15/08/2022 | 4.7 |
| 15/08/2022 | 4.8 |
| 15/08/2022 | 4.7 |
| 15/08/2022 | 4.6 |
| 15/08/2022 | 4.5 |
| 15/08/2022 | 4.5 |
| 15/08/2022 | 4.5 |
| 15/08/2022 | 4.5 |
| 15/08/2022 | 4.4 |
| 15/08/2022 | 4.2 |
| 15/08/2022 | 3.8 |
| 15/08/2022 | 3.4 |
| 15/08/2022 | 3 |
| 15/08/2022 | 2.7 |
| 16/08/2022 | 2.5 |
| 16/08/2022 | 2.4 |
| 16/08/2022 | 2.4 |
| 16/08/2022 | 2.5 |
| 16/08/2022 | 2.8 |
| 16/08/2022 | 3.3 |
| 16/08/2022 | 3.8 |
| 16/08/2022 | 4.2 |
| 16/08/2022 | 4.5 |
| 16/08/2022 | 4.7 |
| 16/08/2022 | 4.8 |
| 16/08/2022 | 4.8 |
| 16/08/2022 | 4.8 |
| 16/08/2022 | 4.7 |
| 16/08/2022 | 4.6 |
| 16/08/2022 | 4.5 |
| 16/08/2022 | 4.5 |
| 16/08/2022 | 4.5 |
| 16/08/2022 | 4.4 |
| 16/08/2022 | 4.2 |
| 16/08/2022 | 3.8 |
| 16/08/2022 | 3.4 |
| 16/08/2022 | 3 |
| 16/08/2022 | 2.7 |
| 17/08/2022 | 2.5 |
| 17/08/2022 | 2.4 |
| 17/08/2022 | 2.4 |
| 17/08/2022 | 2.5 |
| 17/08/2022 | 2.8 |
| 17/08/2022 | 3.3 |
| 17/08/2022 | 3.8 |
| 17/08/2022 | 4.2 |
| 17/08/2022 | 4.5 |
| 17/08/2022 | 4.7 |
| 17/08/2022 | 4.8 |
| 17/08/2022 | 4.8 |
| 17/08/2022 | 4.7 |
| 17/08/2022 | 4.6 |
| 17/08/2022 | 4.6 |
| 17/08/2022 | 4.5 |
| 17/08/2022 | 4.5 |
| 17/08/2022 | 4.5 |
| 17/08/2022 | 4.4 |
| 17/08/2022 | 4.2 |
| 17/08/2022 | 3.8 |
| 17/08/2022 | 3.4 |
| 17/08/2022 | 3 |
| 17/08/2022 | 2.7 |
| 18/08/2022 | 2.5 |
| 18/08/2022 | 2.4 |
| 18/08/2022 | 2.4 |
| 18/08/2022 | 2.5 |
| 18/08/2022 | 2.8 |
| 18/08/2022 | 3.3 |
| 18/08/2022 | 3.8 |
| 18/08/2022 | 4.2 |
| 18/08/2022 | 4.5 |
| 18/08/2022 | 4.7 |
| 18/08/2022 | 4.8 |
| 18/08/2022 | 4.8 |
| 18/08/2022 | 4.8 |
| 18/08/2022 | 4.7 |
| 18/08/2022 | 4.6 |
| 18/08/2022 | 4.5 |
| 18/08/2022 | 4.5 |
| 18/08/2022 | 4.5 |
| 18/08/2022 | 4.4 |
| 18/08/2022 | 4.2 |
| 18/08/2022 | 3.8 |
| 18/08/2022 | 3.4 |
| 18/08/2022 | 3 |
| 18/08/2022 | 2.7 |
| 19/08/2022 | 2.5 |
| 19/08/2022 | 2.4 |
| 19/08/2022 | 2.4 |
| 19/08/2022 | 2.5 |
| 19/08/2022 | 2.8 |
| 19/08/2022 | 3.3 |
| 19/08/2022 | 3.8 |
| 19/08/2022 | 4.2 |
| 19/08/2022 | 4.5 |
| 19/08/2022 | 4.7 |
| 19/08/2022 | 4.8 |
| 19/08/2022 | 4.8 |
| 19/08/2022 | 4.7 |
| 19/08/2022 | 4.6 |
| 19/08/2022 | 4.5 |
| 19/08/2022 | 4.4 |
| 19/08/2022 | 4.3 |
| 19/08/2022 | 4.3 |
| 19/08/2022 | 4.2 |
| 19/08/2022 | 4 |
| 19/08/2022 | 3.6 |
| 19/08/2022 | 3.2 |
| 19/08/2022 | 2.9 |
| 19/08/2022 | 2.7 |
| 20/08/2022 | 2.5 |
| 20/08/2022 | 2.4 |
| 20/08/2022 | 2.4 |
| 20/08/2022 | 2.4 |
| 20/08/2022 | 2.4 |
| 20/08/2022 | 2.5 |
| 20/08/2022 | 2.8 |
| 20/08/2022 | 3.2 |
| 20/08/2022 | 3.6 |
| 20/08/2022 | 3.9 |
| 20/08/2022 | 4 |
| 20/08/2022 | 4 |
| 20/08/2022 | 3.9 |
| 20/08/2022 | 3.8 |
| 20/08/2022 | 3.8 |
| 20/08/2022 | 3.7 |
| 20/08/2022 | 3.7 |
| 20/08/2022 | 3.7 |
| 20/08/2022 | 3.8 |
| 20/08/2022 | 3.7 |
| 20/08/2022 | 3.4 |
| 20/08/2022 | 3.1 |
| 20/08/2022 | 2.8 |
| 20/08/2022 | 2.6 |
| 21/08/2022 | 2.4 |
| 21/08/2022 | 2.3 |
| 21/08/2022 | 2.3 |
| 21/08/2022 | 2.3 |
| 21/08/2022 | 2.3 |
| 21/08/2022 | 2.3 |
| 21/08/2022 | 2.4 |
| 21/08/2022 | 2.7 |
| 21/08/2022 | 3.1 |
| 21/08/2022 | 3.3 |
| 21/08/2022 | 3.5 |
| 21/08/2022 | 3.6 |
| 21/08/2022 | 3.6 |
| 21/08/2022 | 3.5 |
| 21/08/2022 | 3.4 |
| 21/08/2022 | 3.4 |
| 21/08/2022 | 3.5 |
| 21/08/2022 | 3.5 |
| 21/08/2022 | 3.5 |
| 21/08/2022 | 3.5 |
| 21/08/2022 | 3.4 |
| 21/08/2022 | 3.1 |
| 21/08/2022 | 2.8 |
| 21/08/2022 | 2.6 |
| 22/08/2022 | 2.4 |
| 22/08/2022 | 2.3 |
| 22/08/2022 | 2.3 |
| 22/08/2022 | 2.5 |
| 22/08/2022 | 2.8 |
| 22/08/2022 | 3.4 |
| 22/08/2022 | 3.9 |
| 22/08/2022 | 4.3 |
| 22/08/2022 | 4.6 |
| 22/08/2022 | 4.8 |
| 22/08/2022 | 4.8 |
| 22/08/2022 | 4.9 |
| 22/08/2022 | 4.9 |
| 22/08/2022 | 4.8 |
| 22/08/2022 | 4.7 |
| 22/08/2022 | 4.6 |
| 22/08/2022 | 4.6 |
| 22/08/2022 | 4.6 |
| 22/08/2022 | 4.6 |
| 22/08/2022 | 4.4 |
| 22/08/2022 | 3.9 |
| 22/08/2022 | 3.4 |
| 22/08/2022 | 3 |
| 22/08/2022 | 2.7 |
| 23/08/2022 | 2.5 |
| 23/08/2022 | 2.4 |
| 23/08/2022 | 2.4 |
| 23/08/2022 | 2.6 |
| 23/08/2022 | 2.9 |
| 23/08/2022 | 3.4 |
| 23/08/2022 | 4 |
| 23/08/2022 | 4.4 |
| 23/08/2022 | 4.7 |
| 23/08/2022 | 4.8 |
| 23/08/2022 | 4.9 |
| 23/08/2022 | 4.9 |
| 23/08/2022 | 4.9 |
| 23/08/2022 | 4.8 |
| 23/08/2022 | 4.7 |
| 23/08/2022 | 4.7 |
| 23/08/2022 | 4.7 |
| 23/08/2022 | 4.7 |
| 23/08/2022 | 4.6 |
| 23/08/2022 | 4.4 |
| 23/08/2022 | 4 |
| 23/08/2022 | 3.4 |
| 23/08/2022 | 3 |
| 23/08/2022 | 2.7 |
| 24/08/2022 | 2.5 |
| 24/08/2022 | 2.4 |
| 24/08/2022 | 2.4 |
| 24/08/2022 | 2.6 |
| 24/08/2022 | 2.9 |
| 24/08/2022 | 3.5 |
| 24/08/2022 | 4 |
| 24/08/2022 | 4.4 |
| 24/08/2022 | 4.7 |
| 24/08/2022 | 4.8 |
| 24/08/2022 | 4.9 |
| 24/08/2022 | 4.9 |
| 24/08/2022 | 4.9 |
| 24/08/2022 | 4.8 |
| 24/08/2022 | 4.7 |
| 24/08/2022 | 4.7 |
| 24/08/2022 | 4.7 |
| 24/08/2022 | 4.7 |
| 24/08/2022 | 4.7 |
| 24/08/2022 | 4.4 |
| 24/08/2022 | 4 |
| 24/08/2022 | 3.4 |
| 24/08/2022 | 3 |
| 24/08/2022 | 2.7 |
| 25/08/2022 | 2.5 |
| 25/08/2022 | 2.4 |
| 25/08/2022 | 2.4 |
| 25/08/2022 | 2.6 |
| 25/08/2022 | 2.9 |
| 25/08/2022 | 3.4 |
| 25/08/2022 | 4 |
| 25/08/2022 | 4.4 |
| 25/08/2022 | 4.7 |
| 25/08/2022 | 4.8 |
| 25/08/2022 | 4.9 |
| 25/08/2022 | 4.9 |
| 25/08/2022 | 4.9 |
| 25/08/2022 | 4.8 |
| 25/08/2022 | 4.7 |
| 25/08/2022 | 4.7 |
| 25/08/2022 | 4.7 |
| 25/08/2022 | 4.6 |
| 25/08/2022 | 4.6 |
| 25/08/2022 | 4.4 |
| 25/08/2022 | 4 |
| 25/08/2022 | 3.4 |
| 25/08/2022 | 3 |
| 25/08/2022 | 2.7 |
| 26/08/2022 | 2.5 |
| 26/08/2022 | 2.4 |
| 26/08/2022 | 2.4 |
| 26/08/2022 | 2.6 |
| 26/08/2022 | 2.9 |
| 26/08/2022 | 3.4 |
| 26/08/2022 | 4 |
| 26/08/2022 | 4.4 |
| 26/08/2022 | 4.6 |
| 26/08/2022 | 4.8 |
| 26/08/2022 | 4.9 |
| 26/08/2022 | 4.9 |
| 26/08/2022 | 4.8 |
| 26/08/2022 | 4.7 |
| 26/08/2022 | 4.6 |
| 26/08/2022 | 4.5 |
| 26/08/2022 | 4.5 |
| 26/08/2022 | 4.4 |
| 26/08/2022 | 4.4 |
| 26/08/2022 | 4.2 |
| 26/08/2022 | 3.8 |
| 26/08/2022 | 3.3 |
| 26/08/2022 | 2.9 |
| 26/08/2022 | 2.7 |
| 27/08/2022 | 2.5 |
| 27/08/2022 | 2.4 |
| 27/08/2022 | 2.4 |
| 27/08/2022 | 2.4 |
| 27/08/2022 | 2.4 |
| 27/08/2022 | 2.5 |
| 27/08/2022 | 2.8 |
| 27/08/2022 | 3.2 |
| 27/08/2022 | 3.6 |
| 27/08/2022 | 3.9 |
| 27/08/2022 | 4 |
| 27/08/2022 | 4 |
| 27/08/2022 | 3.9 |
| 27/08/2022 | 3.8 |
| 27/08/2022 | 3.8 |
| 27/08/2022 | 3.7 |
| 27/08/2022 | 3.7 |
| 27/08/2022 | 3.7 |
| 27/08/2022 | 3.8 |
| 27/08/2022 | 3.7 |
| 27/08/2022 | 3.4 |
| 27/08/2022 | 3.1 |
| 27/08/2022 | 2.8 |
| 27/08/2022 | 2.6 |
| 28/08/2022 | 2.4 |
| 28/08/2022 | 2.3 |
| 28/08/2022 | 2.3 |
| 28/08/2022 | 2.3 |
| 28/08/2022 | 2.3 |
| 28/08/2022 | 2.3 |
| 28/08/2022 | 2.4 |
| 28/08/2022 | 2.7 |
| 28/08/2022 | 3.1 |
| 28/08/2022 | 3.3 |
| 28/08/2022 | 3.5 |
| 28/08/2022 | 3.6 |
| 28/08/2022 | 3.6 |
| 28/08/2022 | 3.5 |
| 28/08/2022 | 3.4 |
| 28/08/2022 | 3.4 |
| 28/08/2022 | 3.5 |
| 28/08/2022 | 3.5 |
| 28/08/2022 | 3.6 |
| 28/08/2022 | 3.6 |
| 28/08/2022 | 3.4 |
| 28/08/2022 | 3.1 |
| 28/08/2022 | 2.8 |
| 28/08/2022 | 2.6 |
| 29/08/2022 | 2.4 |
| 29/08/2022 | 2.3 |
| 29/08/2022 | 2.3 |
| 29/08/2022 | 2.5 |
| 29/08/2022 | 2.8 |
| 29/08/2022 | 3.4 |
| 29/08/2022 | 3.9 |
| 29/08/2022 | 4.4 |
| 29/08/2022 | 4.6 |
| 29/08/2022 | 4.8 |
| 29/08/2022 | 4.9 |
| 29/08/2022 | 4.9 |
| 29/08/2022 | 4.9 |
| 29/08/2022 | 4.8 |
| 29/08/2022 | 4.7 |
| 29/08/2022 | 4.6 |
| 29/08/2022 | 4.6 |
| 29/08/2022 | 4.6 |
| 29/08/2022 | 4.6 |
| 29/08/2022 | 4.5 |
| 29/08/2022 | 4 |
| 29/08/2022 | 3.4 |
| 29/08/2022 | 3 |
| 29/08/2022 | 2.7 |
| 30/08/2022 | 2.5 |
| 30/08/2022 | 2.4 |
| 30/08/2022 | 2.4 |
| 30/08/2022 | 2.6 |
| 30/08/2022 | 2.9 |
| 30/08/2022 | 3.5 |
| 30/08/2022 | 4 |
| 30/08/2022 | 4.4 |
| 30/08/2022 | 4.7 |
| 30/08/2022 | 4.8 |
| 30/08/2022 | 4.9 |
| 30/08/2022 | 5 |
| 30/08/2022 | 4.9 |
| 30/08/2022 | 4.8 |
| 30/08/2022 | 4.7 |
| 30/08/2022 | 4.7 |
| 30/08/2022 | 4.7 |
| 30/08/2022 | 4.7 |
| 30/08/2022 | 4.7 |
| 30/08/2022 | 4.5 |
| 30/08/2022 | 4 |
| 30/08/2022 | 3.4 |
| 30/08/2022 | 3 |
| 30/08/2022 | 2.7 |
| 31/08/2022 | 2.5 |
| 31/08/2022 | 2.4 |
| 31/08/2022 | 2.4 |
| 31/08/2022 | 2.6 |
| 31/08/2022 | 2.9 |
| 31/08/2022 | 3.5 |
| 31/08/2022 | 4 |
| 31/08/2022 | 4.4 |
| 31/08/2022 | 4.7 |
| 31/08/2022 | 4.8 |
| 31/08/2022 | 4.9 |
| 31/08/2022 | 4.9 |
| 31/08/2022 | 4.9 |
| 31/08/2022 | 4.8 |
| 31/08/2022 | 4.7 |
| 31/08/2022 | 4.7 |
| 31/08/2022 | 4.7 |
| 31/08/2022 | 4.7 |
| 31/08/2022 | 4.7 |
| 31/08/2022 | 4.5 |
| 31/08/2022 | 4 |
| 31/08/2022 | 3.4 |
| 31/08/2022 | 3 |
| 31/08/2022 | 2.7 |
| 01/09/2022 | 2.5 |
| 01/09/2022 | 2.4 |
| 01/09/2022 | 2.4 |
| 01/09/2022 | 2.6 |
| 01/09/2022 | 2.9 |
| 01/09/2022 | 3.5 |
| 01/09/2022 | 4 |
| 01/09/2022 | 4.4 |
| 01/09/2022 | 4.7 |
| 01/09/2022 | 4.8 |
| 01/09/2022 | 4.9 |
| 01/09/2022 | 5 |
| 01/09/2022 | 4.9 |
| 01/09/2022 | 4.8 |
| 01/09/2022 | 4.8 |
| 01/09/2022 | 4.7 |
| 01/09/2022 | 4.7 |
| 01/09/2022 | 4.6 |
| 01/09/2022 | 4.6 |
| 01/09/2022 | 4.5 |
| 01/09/2022 | 4 |
| 01/09/2022 | 3.4 |
| 01/09/2022 | 3 |
| 01/09/2022 | 2.7 |
| 02/09/2022 | 2.5 |
| 02/09/2022 | 2.4 |
| 02/09/2022 | 2.4 |
| 02/09/2022 | 2.6 |
| 02/09/2022 | 2.9 |
| 02/09/2022 | 3.4 |
| 02/09/2022 | 4 |
| 02/09/2022 | 4.4 |
| 02/09/2022 | 4.7 |
| 02/09/2022 | 4.8 |
| 02/09/2022 | 4.9 |
| 02/09/2022 | 4.9 |
| 02/09/2022 | 4.8 |
| 02/09/2022 | 4.7 |
| 02/09/2022 | 4.6 |
| 02/09/2022 | 4.5 |
| 02/09/2022 | 4.5 |
| 02/09/2022 | 4.4 |
| 02/09/2022 | 4.4 |
| 02/09/2022 | 4.3 |
| 02/09/2022 | 3.8 |
| 02/09/2022 | 3.3 |
| 02/09/2022 | 2.9 |
| 02/09/2022 | 2.7 |
| 03/09/2022 | 2.5 |
| 03/09/2022 | 2.4 |
| 03/09/2022 | 2.4 |
| 03/09/2022 | 2.4 |
| 03/09/2022 | 2.4 |
| 03/09/2022 | 2.6 |
| 03/09/2022 | 2.8 |
| 03/09/2022 | 3.2 |
| 03/09/2022 | 3.6 |
| 03/09/2022 | 3.9 |
| 03/09/2022 | 4 |
| 03/09/2022 | 4 |
| 03/09/2022 | 3.9 |
| 03/09/2022 | 3.8 |
| 03/09/2022 | 3.8 |
| 03/09/2022 | 3.7 |
| 03/09/2022 | 3.7 |
| 03/09/2022 | 3.8 |
| 03/09/2022 | 3.8 |
| 03/09/2022 | 3.8 |
| 03/09/2022 | 3.4 |
| 03/09/2022 | 3.1 |
| 03/09/2022 | 2.8 |
| 03/09/2022 | 2.6 |
| 04/09/2022 | 2.4 |
| 04/09/2022 | 2.3 |
| 04/09/2022 | 2.3 |
| 04/09/2022 | 2.3 |
| 04/09/2022 | 2.3 |
| 04/09/2022 | 2.3 |
| 04/09/2022 | 2.4 |
| 04/09/2022 | 2.8 |
| 04/09/2022 | 3.1 |
| 04/09/2022 | 3.4 |
| 04/09/2022 | 3.5 |
| 04/09/2022 | 3.6 |
| 04/09/2022 | 3.6 |
| 04/09/2022 | 3.5 |
| 04/09/2022 | 3.4 |
| 04/09/2022 | 3.4 |
| 04/09/2022 | 3.5 |
| 04/09/2022 | 3.6 |
| 04/09/2022 | 3.6 |
| 04/09/2022 | 3.6 |
| 04/09/2022 | 3.4 |
| 04/09/2022 | 3.1 |
| 04/09/2022 | 2.8 |
| 04/09/2022 | 2.6 |
| 05/09/2022 | 2.4 |
| 05/09/2022 | 2.3 |
| 05/09/2022 | 2.3 |
| 05/09/2022 | 2.5 |
| 05/09/2022 | 2.8 |
| 05/09/2022 | 3.4 |
| 05/09/2022 | 4 |
| 05/09/2022 | 4.4 |
| 05/09/2022 | 4.6 |
| 05/09/2022 | 4.8 |
| 05/09/2022 | 4.9 |
| 05/09/2022 | 4.9 |
| 05/09/2022 | 4.9 |
| 05/09/2022 | 4.8 |
| 05/09/2022 | 4.7 |
| 05/09/2022 | 4.6 |
| 05/09/2022 | 4.7 |
| 05/09/2022 | 4.7 |
| 05/09/2022 | 4.7 |
| 05/09/2022 | 4.5 |
| 05/09/2022 | 4 |
| 05/09/2022 | 3.4 |
| 05/09/2022 | 3 |
| 05/09/2022 | 2.7 |
| 06/09/2022 | 2.5 |
| 06/09/2022 | 2.4 |
| 06/09/2022 | 2.4 |
| 06/09/2022 | 2.6 |
| 06/09/2022 | 2.9 |
| 06/09/2022 | 3.5 |
| 06/09/2022 | 4 |
| 06/09/2022 | 4.5 |
| 06/09/2022 | 4.7 |
| 06/09/2022 | 4.8 |
| 06/09/2022 | 4.9 |
| 06/09/2022 | 5 |
| 06/09/2022 | 4.9 |
| 06/09/2022 | 4.8 |
| 06/09/2022 | 4.7 |
| 06/09/2022 | 4.7 |
| 06/09/2022 | 4.7 |
| 06/09/2022 | 4.7 |
| 06/09/2022 | 4.7 |
| 06/09/2022 | 4.5 |
| 06/09/2022 | 4 |
| 06/09/2022 | 3.4 |
| 06/09/2022 | 3 |
| 06/09/2022 | 2.7 |
| 07/09/2022 | 2.5 |
| 07/09/2022 | 2.4 |
| 07/09/2022 | 2.4 |
| 07/09/2022 | 2.6 |
| 07/09/2022 | 2.9 |
| 07/09/2022 | 3.5 |
| 07/09/2022 | 4.1 |
| 07/09/2022 | 4.5 |
| 07/09/2022 | 4.7 |
| 07/09/2022 | 4.8 |
| 07/09/2022 | 4.9 |
| 07/09/2022 | 4.9 |
| 07/09/2022 | 4.9 |
| 07/09/2022 | 4.8 |
| 07/09/2022 | 4.7 |
| 07/09/2022 | 4.7 |
| 07/09/2022 | 4.7 |
| 07/09/2022 | 4.7 |
| 07/09/2022 | 4.8 |
| 07/09/2022 | 4.5 |
| 07/09/2022 | 4 |
| 07/09/2022 | 3.4 |
| 07/09/2022 | 3 |
| 07/09/2022 | 2.7 |
| 08/09/2022 | 2.5 |
| 08/09/2022 | 2.4 |
| 08/09/2022 | 2.4 |
| 08/09/2022 | 2.6 |
| 08/09/2022 | 2.9 |
| 08/09/2022 | 3.5 |
| 08/09/2022 | 4.1 |
| 08/09/2022 | 4.5 |
| 08/09/2022 | 4.7 |
| 08/09/2022 | 4.8 |
| 08/09/2022 | 4.9 |
| 08/09/2022 | 4.9 |
| 08/09/2022 | 4.9 |
| 08/09/2022 | 4.8 |
| 08/09/2022 | 4.7 |
| 08/09/2022 | 4.7 |
| 08/09/2022 | 4.7 |
| 08/09/2022 | 4.7 |
| 08/09/2022 | 4.7 |
| 08/09/2022 | 4.5 |
| 08/09/2022 | 4 |
| 08/09/2022 | 3.4 |
| 08/09/2022 | 3 |
| 08/09/2022 | 2.7 |
| 09/09/2022 | 2.5 |
| 09/09/2022 | 2.4 |
| 09/09/2022 | 2.4 |
| 09/09/2022 | 2.5 |
| 09/09/2022 | 2.9 |
| 09/09/2022 | 3.5 |
| 09/09/2022 | 4 |
| 09/09/2022 | 4.4 |
| 09/09/2022 | 4.7 |
| 09/09/2022 | 4.8 |
| 09/09/2022 | 4.9 |
| 09/09/2022 | 4.9 |
| 09/09/2022 | 4.8 |
| 09/09/2022 | 4.7 |
| 09/09/2022 | 4.6 |
| 09/09/2022 | 4.5 |
| 09/09/2022 | 4.5 |
| 09/09/2022 | 4.5 |
| 09/09/2022 | 4.5 |
| 09/09/2022 | 4.3 |
| 09/09/2022 | 3.8 |
| 09/09/2022 | 3.3 |
| 09/09/2022 | 2.9 |
| 09/09/2022 | 2.7 |
| 10/09/2022 | 2.5 |
| 10/09/2022 | 2.4 |
| 10/09/2022 | 2.4 |
| 10/09/2022 | 2.4 |
| 10/09/2022 | 2.4 |
| 10/09/2022 | 2.6 |
| 10/09/2022 | 2.8 |
| 10/09/2022 | 3.2 |
| 10/09/2022 | 3.6 |
| 10/09/2022 | 3.9 |
| 10/09/2022 | 4 |
| 10/09/2022 | 4 |
| 10/09/2022 | 3.9 |
| 10/09/2022 | 3.8 |
| 10/09/2022 | 3.8 |
| 10/09/2022 | 3.7 |
| 10/09/2022 | 3.7 |
| 10/09/2022 | 3.8 |
| 10/09/2022 | 3.9 |
| 10/09/2022 | 3.8 |
| 10/09/2022 | 3.4 |
| 10/09/2022 | 3.1 |
| 10/09/2022 | 2.8 |
| 10/09/2022 | 2.6 |
| 11/09/2022 | 2.4 |
| 11/09/2022 | 2.3 |
| 11/09/2022 | 2.3 |
| 11/09/2022 | 2.3 |
| 11/09/2022 | 2.3 |
| 11/09/2022 | 2.3 |
| 11/09/2022 | 2.5 |
| 11/09/2022 | 2.8 |
| 11/09/2022 | 3.1 |
| 11/09/2022 | 3.4 |
| 11/09/2022 | 3.5 |
| 11/09/2022 | 3.6 |
| 11/09/2022 | 3.6 |
| 11/09/2022 | 3.5 |
| 11/09/2022 | 3.4 |
| 11/09/2022 | 3.4 |
| 11/09/2022 | 3.5 |
| 11/09/2022 | 3.6 |
| 11/09/2022 | 3.7 |
| 11/09/2022 | 3.7 |
| 11/09/2022 | 3.4 |
| 11/09/2022 | 3.1 |
| 11/09/2022 | 2.8 |
| 11/09/2022 | 2.6 |
| 12/09/2022 | 2.4 |
| 12/09/2022 | 2.3 |
| 12/09/2022 | 2.3 |
| 12/09/2022 | 2.5 |
| 12/09/2022 | 2.8 |
| 12/09/2022 | 3.4 |
| 12/09/2022 | 4 |
| 12/09/2022 | 4.4 |
| 12/09/2022 | 4.6 |
| 12/09/2022 | 4.8 |
| 12/09/2022 | 4.9 |
| 12/09/2022 | 4.9 |
| 12/09/2022 | 4.9 |
| 12/09/2022 | 4.8 |
| 12/09/2022 | 4.7 |
| 12/09/2022 | 4.6 |
| 12/09/2022 | 4.7 |
| 12/09/2022 | 4.8 |
| 12/09/2022 | 4.8 |
| 12/09/2022 | 4.5 |
| 12/09/2022 | 4 |
| 12/09/2022 | 3.4 |
| 12/09/2022 | 3 |
| 12/09/2022 | 2.7 |
| 13/09/2022 | 2.5 |
| 13/09/2022 | 2.4 |
| 13/09/2022 | 2.4 |
| 13/09/2022 | 2.6 |
| 13/09/2022 | 2.9 |
| 13/09/2022 | 3.5 |
| 13/09/2022 | 4.1 |
| 13/09/2022 | 4.5 |
| 13/09/2022 | 4.7 |
| 13/09/2022 | 4.9 |
| 13/09/2022 | 4.9 |
| 13/09/2022 | 5 |
| 13/09/2022 | 4.9 |
| 13/09/2022 | 4.8 |
| 13/09/2022 | 4.7 |
| 13/09/2022 | 4.7 |
| 13/09/2022 | 4.7 |
| 13/09/2022 | 4.8 |
| 13/09/2022 | 4.9 |
| 13/09/2022 | 4.6 |
| 13/09/2022 | 4 |
| 13/09/2022 | 3.4 |
| 13/09/2022 | 3 |
| 13/09/2022 | 2.7 |
| 14/09/2022 | 2.5 |
| 14/09/2022 | 2.4 |
| 14/09/2022 | 2.4 |
| 14/09/2022 | 2.6 |
| 14/09/2022 | 2.9 |
| 14/09/2022 | 3.5 |
| 14/09/2022 | 4.1 |
| 14/09/2022 | 4.5 |
| 14/09/2022 | 4.7 |
| 14/09/2022 | 4.9 |
| 14/09/2022 | 4.9 |
| 14/09/2022 | 4.9 |
| 14/09/2022 | 4.9 |
| 14/09/2022 | 4.8 |
| 14/09/2022 | 4.7 |
| 14/09/2022 | 4.7 |
| 14/09/2022 | 4.7 |
| 14/09/2022 | 4.8 |
| 14/09/2022 | 4.9 |
| 14/09/2022 | 4.6 |
| 14/09/2022 | 4 |
| 14/09/2022 | 3.4 |
| 14/09/2022 | 3 |
| 14/09/2022 | 2.7 |
| 15/09/2022 | 2.5 |
| 15/09/2022 | 2.4 |
| 15/09/2022 | 2.4 |
| 15/09/2022 | 2.6 |
| 15/09/2022 | 2.9 |
| 15/09/2022 | 3.5 |
| 15/09/2022 | 4.1 |
| 15/09/2022 | 4.5 |
| 15/09/2022 | 4.7 |
| 15/09/2022 | 4.9 |
| 15/09/2022 | 4.9 |
| 15/09/2022 | 4.9 |
| 15/09/2022 | 4.9 |
| 15/09/2022 | 4.8 |
| 15/09/2022 | 4.7 |
| 15/09/2022 | 4.6 |
| 15/09/2022 | 4.7 |
| 15/09/2022 | 4.8 |
| 15/09/2022 | 4.8 |
| 15/09/2022 | 4.5 |
| 15/09/2022 | 4 |
| 15/09/2022 | 3.4 |
| 15/09/2022 | 3 |
| 15/09/2022 | 2.7 |
| 16/09/2022 | 2.5 |
| 16/09/2022 | 2.4 |
| 16/09/2022 | 2.4 |
| 16/09/2022 | 2.5 |
| 16/09/2022 | 2.9 |
| 16/09/2022 | 3.5 |
| 16/09/2022 | 4.1 |
| 16/09/2022 | 4.5 |
| 16/09/2022 | 4.7 |
| 16/09/2022 | 4.8 |
| 16/09/2022 | 4.9 |
| 16/09/2022 | 4.9 |
| 16/09/2022 | 4.8 |
| 16/09/2022 | 4.7 |
| 16/09/2022 | 4.6 |
| 16/09/2022 | 4.5 |
| 16/09/2022 | 4.5 |
| 16/09/2022 | 4.6 |
| 16/09/2022 | 4.6 |
| 16/09/2022 | 4.3 |
| 16/09/2022 | 3.8 |
| 16/09/2022 | 3.3 |
| 16/09/2022 | 2.9 |
| 16/09/2022 | 2.7 |
| 17/09/2022 | 2.5 |
| 17/09/2022 | 2.4 |
| 17/09/2022 | 2.4 |
| 17/09/2022 | 2.4 |
| 17/09/2022 | 2.4 |
| 17/09/2022 | 2.6 |
| 17/09/2022 | 2.8 |
| 17/09/2022 | 3.3 |
| 17/09/2022 | 3.6 |
| 17/09/2022 | 3.9 |
| 17/09/2022 | 4 |
| 17/09/2022 | 4 |
| 17/09/2022 | 3.9 |
| 17/09/2022 | 3.8 |
| 17/09/2022 | 3.8 |
| 17/09/2022 | 3.7 |
| 17/09/2022 | 3.8 |
| 17/09/2022 | 3.9 |
| 17/09/2022 | 4 |
| 17/09/2022 | 3.8 |
| 17/09/2022 | 3.4 |
| 17/09/2022 | 3.1 |
| 17/09/2022 | 2.8 |
| 17/09/2022 | 2.6 |
| 18/09/2022 | 2.5 |
| 18/09/2022 | 2.3 |
| 18/09/2022 | 2.3 |
| 18/09/2022 | 2.3 |
| 18/09/2022 | 2.3 |
| 18/09/2022 | 2.3 |
| 18/09/2022 | 2.5 |
| 18/09/2022 | 2.8 |
| 18/09/2022 | 3.1 |
| 18/09/2022 | 3.4 |
| 18/09/2022 | 3.5 |
| 18/09/2022 | 3.6 |
| 18/09/2022 | 3.6 |
| 18/09/2022 | 3.5 |
| 18/09/2022 | 3.4 |
| 18/09/2022 | 3.4 |
| 18/09/2022 | 3.5 |
| 18/09/2022 | 3.7 |
| 18/09/2022 | 3.8 |
| 18/09/2022 | 3.7 |
| 18/09/2022 | 3.4 |
| 18/09/2022 | 3.1 |
| 18/09/2022 | 2.8 |
| 18/09/2022 | 2.6 |
| 19/09/2022 | 2.4 |
| 19/09/2022 | 2.3 |
| 19/09/2022 | 2.3 |
| 19/09/2022 | 2.5 |
| 19/09/2022 | 2.8 |
| 19/09/2022 | 3.5 |
| 19/09/2022 | 4 |
| 19/09/2022 | 4.4 |
| 19/09/2022 | 4.7 |
| 19/09/2022 | 4.8 |
| 19/09/2022 | 4.9 |
| 19/09/2022 | 4.9 |
| 19/09/2022 | 4.8 |
| 19/09/2022 | 4.7 |
| 19/09/2022 | 4.7 |
| 19/09/2022 | 4.6 |
| 19/09/2022 | 4.7 |
| 19/09/2022 | 4.8 |
| 19/09/2022 | 4.9 |
| 19/09/2022 | 4.5 |
| 19/09/2022 | 4 |
| 19/09/2022 | 3.4 |
| 19/09/2022 | 3 |
| 19/09/2022 | 2.7 |
| 20/09/2022 | 2.5 |
| 20/09/2022 | 2.4 |
| 20/09/2022 | 2.4 |
| 20/09/2022 | 2.5 |
| 20/09/2022 | 2.9 |
| 20/09/2022 | 3.5 |
| 20/09/2022 | 4.1 |
| 20/09/2022 | 4.5 |
| 20/09/2022 | 4.7 |
| 20/09/2022 | 4.9 |
| 20/09/2022 | 4.9 |
| 20/09/2022 | 4.9 |
| 20/09/2022 | 4.9 |
| 20/09/2022 | 4.8 |
| 20/09/2022 | 4.7 |
| 20/09/2022 | 4.6 |
| 20/09/2022 | 4.7 |
| 20/09/2022 | 4.9 |
| 20/09/2022 | 5 |
| 20/09/2022 | 4.6 |
| 20/09/2022 | 4 |
| 20/09/2022 | 3.4 |
| 20/09/2022 | 3 |
| 20/09/2022 | 2.8 |
| 21/09/2022 | 2.5 |
| 21/09/2022 | 2.4 |
| 21/09/2022 | 2.4 |
| 21/09/2022 | 2.6 |
| 21/09/2022 | 2.9 |
| 21/09/2022 | 3.6 |
| 21/09/2022 | 4.1 |
| 21/09/2022 | 4.5 |
| 21/09/2022 | 4.7 |
| 21/09/2022 | 4.9 |
| 21/09/2022 | 4.9 |
| 21/09/2022 | 4.9 |
| 21/09/2022 | 4.9 |
| 21/09/2022 | 4.8 |
| 21/09/2022 | 4.7 |
| 21/09/2022 | 4.6 |
| 21/09/2022 | 4.7 |
| 21/09/2022 | 4.9 |
| 21/09/2022 | 5 |
| 21/09/2022 | 4.6 |
| 21/09/2022 | 4 |
| 21/09/2022 | 3.4 |
| 21/09/2022 | 3 |
| 21/09/2022 | 2.8 |
| 22/09/2022 | 2.5 |
| 22/09/2022 | 2.4 |
| 22/09/2022 | 2.4 |
| 22/09/2022 | 2.6 |
| 22/09/2022 | 2.9 |
| 22/09/2022 | 3.6 |
| 22/09/2022 | 4.1 |
| 22/09/2022 | 4.5 |
| 22/09/2022 | 4.7 |
| 22/09/2022 | 4.9 |
| 22/09/2022 | 4.9 |
| 22/09/2022 | 4.9 |
| 22/09/2022 | 4.9 |
| 22/09/2022 | 4.8 |
| 22/09/2022 | 4.7 |
| 22/09/2022 | 4.6 |
| 22/09/2022 | 4.7 |
| 22/09/2022 | 4.9 |
| 22/09/2022 | 4.9 |
| 22/09/2022 | 4.6 |
| 22/09/2022 | 4 |
| 22/09/2022 | 3.4 |
| 22/09/2022 | 3 |
| 22/09/2022 | 2.8 |
| 23/09/2022 | 2.5 |
| 23/09/2022 | 2.4 |
| 23/09/2022 | 2.4 |
| 23/09/2022 | 2.5 |
| 23/09/2022 | 2.9 |
| 23/09/2022 | 3.5 |
| 23/09/2022 | 4.1 |
| 23/09/2022 | 4.5 |
| 23/09/2022 | 4.7 |
| 23/09/2022 | 4.9 |
| 23/09/2022 | 4.9 |
| 23/09/2022 | 4.9 |
| 23/09/2022 | 4.8 |
| 23/09/2022 | 4.7 |
| 23/09/2022 | 4.6 |
| 23/09/2022 | 4.5 |
| 23/09/2022 | 4.5 |
| 23/09/2022 | 4.7 |
| 23/09/2022 | 4.7 |
| 23/09/2022 | 4.3 |
| 23/09/2022 | 3.8 |
| 23/09/2022 | 3.3 |
| 23/09/2022 | 2.9 |
| 23/09/2022 | 2.7 |
| 24/09/2022 | 2.6 |
| 24/09/2022 | 2.4 |
| 24/09/2022 | 2.4 |
| 24/09/2022 | 2.4 |
| 24/09/2022 | 2.4 |
| 24/09/2022 | 2.6 |
| 24/09/2022 | 2.9 |
| 24/09/2022 | 3.3 |
| 24/09/2022 | 3.7 |
| 24/09/2022 | 3.9 |
| 24/09/2022 | 4 |
| 24/09/2022 | 4 |
| 24/09/2022 | 3.9 |
| 24/09/2022 | 3.8 |
| 24/09/2022 | 3.7 |
| 24/09/2022 | 3.7 |
| 24/09/2022 | 3.8 |
| 24/09/2022 | 4 |
| 24/09/2022 | 4.1 |
| 24/09/2022 | 3.8 |
| 24/09/2022 | 3.4 |
| 24/09/2022 | 3 |
| 24/09/2022 | 2.8 |
| 24/09/2022 | 2.6 |
| 25/09/2022 | 2.5 |
| 25/09/2022 | 2.3 |
| 25/09/2022 | 2.3 |
| 25/09/2022 | 2.3 |
| 25/09/2022 | 2.3 |
| 25/09/2022 | 2.4 |
| 25/09/2022 | 2.5 |
| 25/09/2022 | 2.8 |
| 25/09/2022 | 3.1 |
| 25/09/2022 | 3.4 |
| 25/09/2022 | 3.5 |
| 25/09/2022 | 3.6 |
| 25/09/2022 | 3.5 |
| 25/09/2022 | 3.5 |
| 25/09/2022 | 3.4 |
| 25/09/2022 | 3.4 |
| 25/09/2022 | 3.5 |
| 25/09/2022 | 3.8 |
| 25/09/2022 | 3.9 |
| 25/09/2022 | 3.7 |
| 25/09/2022 | 3.4 |
| 25/09/2022 | 3.1 |
| 25/09/2022 | 2.8 |
| 25/09/2022 | 2.6 |
| 26/09/2022 | 2.4 |
| 26/09/2022 | 2.3 |
| 26/09/2022 | 2.3 |
| 26/09/2022 | 2.5 |
| 26/09/2022 | 2.8 |
| 26/09/2022 | 3.5 |
| 26/09/2022 | 4.1 |
| 26/09/2022 | 4.5 |
| 26/09/2022 | 4.7 |
| 26/09/2022 | 4.8 |
| 26/09/2022 | 4.8 |
| 26/09/2022 | 4.9 |
| 26/09/2022 | 4.8 |
| 26/09/2022 | 4.7 |
| 26/09/2022 | 4.6 |
| 26/09/2022 | 4.6 |
| 26/09/2022 | 4.7 |
| 26/09/2022 | 4.9 |
| 26/09/2022 | 5 |
| 26/09/2022 | 4.6 |
| 26/09/2022 | 4 |
| 26/09/2022 | 3.4 |
| 26/09/2022 | 3 |
| 26/09/2022 | 2.7 |
| 27/09/2022 | 2.5 |
| 27/09/2022 | 2.4 |
| 27/09/2022 | 2.4 |
| 27/09/2022 | 2.5 |
| 27/09/2022 | 2.9 |
| 27/09/2022 | 3.6 |
| 27/09/2022 | 4.2 |
| 27/09/2022 | 4.6 |
| 27/09/2022 | 4.7 |
| 27/09/2022 | 4.9 |
| 27/09/2022 | 4.9 |
| 27/09/2022 | 4.9 |
| 27/09/2022 | 4.9 |
| 27/09/2022 | 4.8 |
| 27/09/2022 | 4.7 |
| 27/09/2022 | 4.6 |
| 27/09/2022 | 4.7 |
| 27/09/2022 | 5 |
| 27/09/2022 | 5.1 |
| 27/09/2022 | 4.6 |
| 27/09/2022 | 4 |
| 27/09/2022 | 3.4 |
| 27/09/2022 | 3 |
| 27/09/2022 | 2.8 |
| 28/09/2022 | 2.5 |
| 28/09/2022 | 2.4 |
| 28/09/2022 | 2.4 |
| 28/09/2022 | 2.6 |
| 28/09/2022 | 2.9 |
| 28/09/2022 | 3.6 |
| 28/09/2022 | 4.2 |
| 28/09/2022 | 4.6 |
| 28/09/2022 | 4.7 |
| 28/09/2022 | 4.9 |
| 28/09/2022 | 4.9 |
| 28/09/2022 | 4.9 |
| 28/09/2022 | 4.8 |
| 28/09/2022 | 4.7 |
| 28/09/2022 | 4.7 |
| 28/09/2022 | 4.6 |
| 28/09/2022 | 4.7 |
| 28/09/2022 | 5 |
| 28/09/2022 | 5.1 |
| 28/09/2022 | 4.6 |
| 28/09/2022 | 4 |
| 28/09/2022 | 3.4 |
| 28/09/2022 | 3 |
| 28/09/2022 | 2.8 |
| 29/09/2022 | 2.5 |
| 29/09/2022 | 2.4 |
| 29/09/2022 | 2.4 |
| 29/09/2022 | 2.6 |
| 29/09/2022 | 2.9 |
| 29/09/2022 | 3.6 |
| 29/09/2022 | 4.2 |
| 29/09/2022 | 4.6 |
| 29/09/2022 | 4.7 |
| 29/09/2022 | 4.9 |
| 29/09/2022 | 4.9 |
| 29/09/2022 | 4.9 |
| 29/09/2022 | 4.9 |
| 29/09/2022 | 4.8 |
| 29/09/2022 | 4.7 |
| 29/09/2022 | 4.6 |
| 29/09/2022 | 4.7 |
| 29/09/2022 | 4.9 |
| 29/09/2022 | 5.1 |
| 29/09/2022 | 4.6 |
| 29/09/2022 | 4 |
| 29/09/2022 | 3.4 |
| 29/09/2022 | 3 |
| 29/09/2022 | 2.8 |
| 30/09/2022 | 2.5 |
| 30/09/2022 | 2.4 |
| 30/09/2022 | 2.4 |
| 30/09/2022 | 2.5 |
| 30/09/2022 | 2.9 |
| 30/09/2022 | 3.6 |
| 30/09/2022 | 4.1 |
| 30/09/2022 | 4.5 |
| 30/09/2022 | 4.7 |
| 30/09/2022 | 4.9 |
| 30/09/2022 | 4.9 |
| 30/09/2022 | 4.9 |
| 30/09/2022 | 4.8 |
| 30/09/2022 | 4.6 |
| 30/09/2022 | 4.5 |
| 30/09/2022 | 4.5 |
| 30/09/2022 | 4.5 |
| 30/09/2022 | 4.7 |
| 30/09/2022 | 4.8 |
| 30/09/2022 | 4.3 |
| 30/09/2022 | 3.8 |
| 30/09/2022 | 3.3 |
| 30/09/2022 | 3 |
| 30/09/2022 | 2.7 |
| 01/10/2022 | 2.6 |
| 01/10/2022 | 2.4 |
| 01/10/2022 | 2.4 |
| 01/10/2022 | 2.4 |
| 01/10/2022 | 2.5 |
| 01/10/2022 | 2.7 |
| 01/10/2022 | 2.9 |
| 01/10/2022 | 3.3 |
| 01/10/2022 | 3.7 |
| 01/10/2022 | 3.9 |
| 01/10/2022 | 4 |
| 01/10/2022 | 4 |
| 01/10/2022 | 3.9 |
| 01/10/2022 | 3.8 |
| 01/10/2022 | 3.7 |
| 01/10/2022 | 3.7 |
| 01/10/2022 | 3.8 |
| 01/10/2022 | 4 |
| 01/10/2022 | 4.2 |
| 01/10/2022 | 3.9 |
| 01/10/2022 | 3.4 |
| 01/10/2022 | 3 |
| 01/10/2022 | 2.8 |
| 01/10/2022 | 2.6 |
| 02/10/2022 | 2.5 |
| 02/10/2022 | 2.3 |
| 02/10/2022 | 2.3 |
| 02/10/2022 | 2.3 |
| 02/10/2022 | 2.3 |
| 02/10/2022 | 2.4 |
| 02/10/2022 | 2.5 |
| 02/10/2022 | 2.8 |
| 02/10/2022 | 3.2 |
| 02/10/2022 | 3.4 |
| 02/10/2022 | 3.5 |
| 02/10/2022 | 3.6 |
| 02/10/2022 | 3.5 |
| 02/10/2022 | 3.4 |
| 02/10/2022 | 3.4 |
| 02/10/2022 | 3.4 |
| 02/10/2022 | 3.5 |
| 02/10/2022 | 3.8 |
| 02/10/2022 | 4 |
| 02/10/2022 | 3.7 |
| 02/10/2022 | 3.4 |
| 02/10/2022 | 3.1 |
| 02/10/2022 | 2.8 |
| 02/10/2022 | 2.7 |
| 03/10/2022 | 2.5 |
| 03/10/2022 | 2.4 |
| 03/10/2022 | 2.3 |
| 03/10/2022 | 2.3 |
| 03/10/2022 | 2.4 |
| 03/10/2022 | 2.5 |
| 03/10/2022 | 2.7 |
| 03/10/2022 | 3 |
| 03/10/2022 | 3.4 |
| 03/10/2022 | 3.6 |
| 03/10/2022 | 3.7 |
| 03/10/2022 | 3.7 |
| 03/10/2022 | 3.6 |
| 03/10/2022 | 3.5 |
| 03/10/2022 | 3.4 |
| 03/10/2022 | 3.3 |
| 03/10/2022 | 3.4 |
| 03/10/2022 | 3.7 |
| 03/10/2022 | 3.9 |
| 03/10/2022 | 3.6 |
| 03/10/2022 | 3.3 |
| 03/10/2022 | 3 |
| 03/10/2022 | 2.8 |
| 03/10/2022 | 2.8 |
| 04/10/2022 | 2.5 |
| 04/10/2022 | 2.4 |
| 04/10/2022 | 2.4 |
| 04/10/2022 | 2.5 |
| 04/10/2022 | 2.9 |
| 04/10/2022 | 3.6 |
| 04/10/2022 | 4.2 |
| 04/10/2022 | 4.6 |
| 04/10/2022 | 4.8 |
| 04/10/2022 | 4.9 |
| 04/10/2022 | 4.9 |
| 04/10/2022 | 4.9 |
| 04/10/2022 | 4.8 |
| 04/10/2022 | 4.7 |
| 04/10/2022 | 4.7 |
| 04/10/2022 | 4.6 |
| 04/10/2022 | 4.7 |
| 04/10/2022 | 5 |
| 04/10/2022 | 5.2 |
| 04/10/2022 | 4.6 |
| 04/10/2022 | 4 |
| 04/10/2022 | 3.4 |
| 04/10/2022 | 3.1 |
| 04/10/2022 | 2.8 |
| 05/10/2022 | 2.5 |
| 05/10/2022 | 2.4 |
| 05/10/2022 | 2.4 |
| 05/10/2022 | 2.6 |
| 05/10/2022 | 2.9 |
| 05/10/2022 | 3.6 |
| 05/10/2022 | 4.2 |
| 05/10/2022 | 4.6 |
| 05/10/2022 | 4.8 |
| 05/10/2022 | 4.9 |
| 05/10/2022 | 4.9 |
| 05/10/2022 | 4.9 |
| 05/10/2022 | 4.8 |
| 05/10/2022 | 4.7 |
| 05/10/2022 | 4.6 |
| 05/10/2022 | 4.6 |
| 05/10/2022 | 4.7 |
| 05/10/2022 | 5.1 |
| 05/10/2022 | 5.2 |
| 05/10/2022 | 4.6 |
| 05/10/2022 | 4 |
| 05/10/2022 | 3.4 |
| 05/10/2022 | 3.1 |
| 05/10/2022 | 2.8 |
| 06/10/2022 | 2.6 |
| 06/10/2022 | 2.4 |
| 06/10/2022 | 2.4 |
| 06/10/2022 | 2.6 |
| 06/10/2022 | 2.9 |
| 06/10/2022 | 3.6 |
| 06/10/2022 | 4.2 |
| 06/10/2022 | 4.6 |
| 06/10/2022 | 4.8 |
| 06/10/2022 | 4.9 |
| 06/10/2022 | 4.9 |
| 06/10/2022 | 4.9 |
| 06/10/2022 | 4.8 |
| 06/10/2022 | 4.7 |
| 06/10/2022 | 4.6 |
| 06/10/2022 | 4.6 |
| 06/10/2022 | 4.7 |
| 06/10/2022 | 5 |
| 06/10/2022 | 5.2 |
| 06/10/2022 | 4.6 |
| 06/10/2022 | 4 |
| 06/10/2022 | 3.4 |
| 06/10/2022 | 3.1 |
| 06/10/2022 | 2.8 |
| 07/10/2022 | 2.6 |
| 07/10/2022 | 2.4 |
| 07/10/2022 | 2.4 |
| 07/10/2022 | 2.5 |
| 07/10/2022 | 2.9 |
| 07/10/2022 | 3.6 |
| 07/10/2022 | 4.2 |
| 07/10/2022 | 4.6 |
| 07/10/2022 | 4.8 |
| 07/10/2022 | 4.9 |
| 07/10/2022 | 4.9 |
| 07/10/2022 | 4.9 |
| 07/10/2022 | 4.7 |
| 07/10/2022 | 4.6 |
| 07/10/2022 | 4.5 |
| 07/10/2022 | 4.4 |
| 07/10/2022 | 4.5 |
| 07/10/2022 | 4.8 |
| 07/10/2022 | 4.9 |
| 07/10/2022 | 4.4 |
| 07/10/2022 | 3.8 |
| 07/10/2022 | 3.3 |
| 07/10/2022 | 3 |
| 07/10/2022 | 2.8 |
| 08/10/2022 | 2.6 |
| 08/10/2022 | 2.4 |
| 08/10/2022 | 2.4 |
| 08/10/2022 | 2.4 |
| 08/10/2022 | 2.5 |
| 08/10/2022 | 2.7 |
| 08/10/2022 | 2.9 |
| 08/10/2022 | 3.3 |
| 08/10/2022 | 3.7 |
| 08/10/2022 | 3.9 |
| 08/10/2022 | 4 |
| 08/10/2022 | 4 |
| 08/10/2022 | 3.9 |
| 08/10/2022 | 3.8 |
| 08/10/2022 | 3.7 |
| 08/10/2022 | 3.7 |
| 08/10/2022 | 3.8 |
| 08/10/2022 | 4.1 |
| 08/10/2022 | 4.3 |
| 08/10/2022 | 3.9 |
| 08/10/2022 | 3.4 |
| 08/10/2022 | 3 |
| 08/10/2022 | 2.8 |
| 08/10/2022 | 2.6 |
| 09/10/2022 | 2.5 |
| 09/10/2022 | 2.3 |
| 09/10/2022 | 2.3 |
| 09/10/2022 | 2.3 |
| 09/10/2022 | 2.3 |
| 09/10/2022 | 2.4 |
| 09/10/2022 | 2.6 |
| 09/10/2022 | 2.9 |
| 09/10/2022 | 3.2 |
| 09/10/2022 | 3.4 |
| 09/10/2022 | 3.5 |
| 09/10/2022 | 3.6 |
| 09/10/2022 | 3.5 |
| 09/10/2022 | 3.4 |
| 09/10/2022 | 3.4 |
| 09/10/2022 | 3.3 |
| 09/10/2022 | 3.5 |
| 09/10/2022 | 3.9 |
| 09/10/2022 | 4 |
| 09/10/2022 | 3.7 |
| 09/10/2022 | 3.4 |
| 09/10/2022 | 3.1 |
| 09/10/2022 | 2.9 |
| 09/10/2022 | 2.6 |
| 10/10/2022 | 2.4 |
| 10/10/2022 | 2.3 |
| 10/10/2022 | 2.3 |
| 10/10/2022 | 2.5 |
| 10/10/2022 | 2.8 |
| 10/10/2022 | 3.6 |
| 10/10/2022 | 4.2 |
| 10/10/2022 | 4.5 |
| 10/10/2022 | 4.7 |
| 10/10/2022 | 4.8 |
| 10/10/2022 | 4.8 |
| 10/10/2022 | 4.9 |
| 10/10/2022 | 4.8 |
| 10/10/2022 | 4.7 |
| 10/10/2022 | 4.6 |
| 10/10/2022 | 4.5 |
| 10/10/2022 | 4.7 |
| 10/10/2022 | 5.1 |
| 10/10/2022 | 5.2 |
| 10/10/2022 | 4.6 |
| 10/10/2022 | 3.9 |
| 10/10/2022 | 3.4 |
| 10/10/2022 | 3 |
| 10/10/2022 | 2.8 |
| 11/10/2022 | 2.5 |
| 11/10/2022 | 2.4 |
| 11/10/2022 | 2.4 |
| 11/10/2022 | 2.5 |
| 11/10/2022 | 2.9 |
| 11/10/2022 | 3.6 |
| 11/10/2022 | 4.3 |
| 11/10/2022 | 4.6 |
| 11/10/2022 | 4.8 |
| 11/10/2022 | 4.9 |
| 11/10/2022 | 4.9 |
| 11/10/2022 | 4.9 |
| 11/10/2022 | 4.8 |
| 11/10/2022 | 4.7 |
| 11/10/2022 | 4.6 |
| 11/10/2022 | 4.6 |
| 11/10/2022 | 4.7 |
| 11/10/2022 | 5.1 |
| 11/10/2022 | 5.3 |
| 11/10/2022 | 4.6 |
| 11/10/2022 | 4 |
| 11/10/2022 | 3.4 |
| 11/10/2022 | 3.1 |
| 11/10/2022 | 2.8 |
| 12/10/2022 | 2.6 |
| 12/10/2022 | 2.4 |
| 12/10/2022 | 2.4 |
| 12/10/2022 | 2.6 |
| 12/10/2022 | 2.9 |
| 12/10/2022 | 3.7 |
| 12/10/2022 | 4.3 |
| 12/10/2022 | 4.6 |
| 12/10/2022 | 4.8 |
| 12/10/2022 | 4.9 |
| 12/10/2022 | 4.9 |
| 12/10/2022 | 4.9 |
| 12/10/2022 | 4.8 |
| 12/10/2022 | 4.7 |
| 12/10/2022 | 4.6 |
| 12/10/2022 | 4.6 |
| 12/10/2022 | 4.7 |
| 12/10/2022 | 5.1 |
| 12/10/2022 | 5.3 |
| 12/10/2022 | 4.6 |
| 12/10/2022 | 4 |
| 12/10/2022 | 3.4 |
| 12/10/2022 | 3.1 |
| 12/10/2022 | 2.8 |
| 13/10/2022 | 2.6 |
| 13/10/2022 | 2.4 |
| 13/10/2022 | 2.4 |
| 13/10/2022 | 2.6 |
| 13/10/2022 | 2.9 |
| 13/10/2022 | 3.7 |
| 13/10/2022 | 4.3 |
| 13/10/2022 | 4.6 |
| 13/10/2022 | 4.8 |
| 13/10/2022 | 4.9 |
| 13/10/2022 | 4.9 |
| 13/10/2022 | 4.9 |
| 13/10/2022 | 4.8 |
| 13/10/2022 | 4.7 |
| 13/10/2022 | 4.7 |
| 13/10/2022 | 4.6 |
| 13/10/2022 | 4.7 |
| 13/10/2022 | 5.1 |
| 13/10/2022 | 5.3 |
| 13/10/2022 | 4.6 |
| 13/10/2022 | 4 |
| 13/10/2022 | 3.4 |
| 13/10/2022 | 3.1 |
| 13/10/2022 | 2.8 |
| 14/10/2022 | 2.6 |
| 14/10/2022 | 2.4 |
| 14/10/2022 | 2.4 |
| 14/10/2022 | 2.6 |
| 14/10/2022 | 2.9 |
| 14/10/2022 | 3.6 |
| 14/10/2022 | 4.2 |
| 14/10/2022 | 4.6 |
| 14/10/2022 | 4.8 |
| 14/10/2022 | 4.9 |
| 14/10/2022 | 4.9 |
| 14/10/2022 | 4.9 |
| 14/10/2022 | 4.8 |
| 14/10/2022 | 4.6 |
| 14/10/2022 | 4.5 |
| 14/10/2022 | 4.5 |
| 14/10/2022 | 4.6 |
| 14/10/2022 | 4.9 |
| 14/10/2022 | 5 |
| 14/10/2022 | 4.4 |
| 14/10/2022 | 3.8 |
| 14/10/2022 | 3.3 |
| 14/10/2022 | 3 |
| 14/10/2022 | 2.8 |
| 15/10/2022 | 2.6 |
| 15/10/2022 | 2.4 |
| 15/10/2022 | 2.4 |
| 15/10/2022 | 2.4 |
| 15/10/2022 | 2.5 |
| 15/10/2022 | 2.7 |
| 15/10/2022 | 3 |
| 15/10/2022 | 3.4 |
| 15/10/2022 | 3.7 |
| 15/10/2022 | 4 |
| 15/10/2022 | 4.1 |
| 15/10/2022 | 4 |
| 15/10/2022 | 3.9 |
| 15/10/2022 | 3.8 |
| 15/10/2022 | 3.7 |
| 15/10/2022 | 3.7 |
| 15/10/2022 | 3.8 |
| 15/10/2022 | 4.2 |
| 15/10/2022 | 4.3 |
| 15/10/2022 | 3.9 |
| 15/10/2022 | 3.5 |
| 15/10/2022 | 3.1 |
| 15/10/2022 | 2.9 |
| 15/10/2022 | 2.7 |
| 16/10/2022 | 2.5 |
| 16/10/2022 | 2.4 |
| 16/10/2022 | 2.3 |
| 16/10/2022 | 2.3 |
| 16/10/2022 | 2.3 |
| 16/10/2022 | 2.4 |
| 16/10/2022 | 2.6 |
| 16/10/2022 | 2.9 |
| 16/10/2022 | 3.2 |
| 16/10/2022 | 3.4 |
| 16/10/2022 | 3.6 |
| 16/10/2022 | 3.7 |
| 16/10/2022 | 3.6 |
| 16/10/2022 | 3.5 |
| 16/10/2022 | 3.4 |
| 16/10/2022 | 3.4 |
| 16/10/2022 | 3.6 |
| 16/10/2022 | 4 |
| 16/10/2022 | 4.1 |
| 16/10/2022 | 3.8 |
| 16/10/2022 | 3.4 |
| 16/10/2022 | 3.1 |
| 16/10/2022 | 2.9 |
| 16/10/2022 | 2.7 |
| 17/10/2022 | 2.5 |
| 17/10/2022 | 2.4 |
| 17/10/2022 | 2.3 |
| 17/10/2022 | 2.5 |
| 17/10/2022 | 2.8 |
| 17/10/2022 | 3.6 |
| 17/10/2022 | 4.2 |
| 17/10/2022 | 4.6 |
| 17/10/2022 | 4.8 |
| 17/10/2022 | 4.9 |
| 17/10/2022 | 4.9 |
| 17/10/2022 | 5 |
| 17/10/2022 | 4.9 |
| 17/10/2022 | 4.8 |
| 17/10/2022 | 4.7 |
| 17/10/2022 | 4.7 |
| 17/10/2022 | 4.8 |
| 17/10/2022 | 5.2 |
| 17/10/2022 | 5.3 |
| 17/10/2022 | 4.7 |
| 17/10/2022 | 4 |
| 17/10/2022 | 3.5 |
| 17/10/2022 | 3.1 |
| 17/10/2022 | 2.8 |
| 18/10/2022 | 2.6 |
| 18/10/2022 | 2.5 |
| 18/10/2022 | 2.4 |
| 18/10/2022 | 2.6 |
| 18/10/2022 | 2.9 |
| 18/10/2022 | 3.7 |
| 18/10/2022 | 4.3 |
| 18/10/2022 | 4.7 |
| 18/10/2022 | 4.9 |
| 18/10/2022 | 5 |
| 18/10/2022 | 5 |
| 18/10/2022 | 5 |
| 18/10/2022 | 4.9 |
| 18/10/2022 | 4.8 |
| 18/10/2022 | 4.8 |
| 18/10/2022 | 4.7 |
| 18/10/2022 | 4.9 |
| 18/10/2022 | 5.2 |
| 18/10/2022 | 5.3 |
| 18/10/2022 | 4.7 |
| 18/10/2022 | 4.1 |
| 18/10/2022 | 3.5 |
| 18/10/2022 | 3.2 |
| 18/10/2022 | 2.9 |
| 19/10/2022 | 2.6 |
| 19/10/2022 | 2.5 |
| 19/10/2022 | 2.4 |
| 19/10/2022 | 2.6 |
| 19/10/2022 | 3 |
| 19/10/2022 | 3.7 |
| 19/10/2022 | 4.4 |
| 19/10/2022 | 4.7 |
| 19/10/2022 | 4.9 |
| 19/10/2022 | 5 |
| 19/10/2022 | 5 |
| 19/10/2022 | 5 |
| 19/10/2022 | 4.9 |
| 19/10/2022 | 4.8 |
| 19/10/2022 | 4.8 |
| 19/10/2022 | 4.8 |
| 19/10/2022 | 4.9 |
| 19/10/2022 | 5.2 |
| 19/10/2022 | 5.3 |
| 19/10/2022 | 4.8 |
| 19/10/2022 | 4.1 |
| 19/10/2022 | 3.5 |
| 19/10/2022 | 3.2 |
| 19/10/2022 | 2.9 |
| 20/10/2022 | 2.6 |
| 20/10/2022 | 2.5 |
| 20/10/2022 | 2.5 |
| 20/10/2022 | 2.6 |
| 20/10/2022 | 3 |
| 20/10/2022 | 3.7 |
| 20/10/2022 | 4.4 |
| 20/10/2022 | 4.7 |
| 20/10/2022 | 4.9 |
| 20/10/2022 | 5 |
| 20/10/2022 | 5 |
| 20/10/2022 | 5.1 |
| 20/10/2022 | 5 |
| 20/10/2022 | 4.9 |
| 20/10/2022 | 4.8 |
| 20/10/2022 | 4.8 |
| 20/10/2022 | 4.9 |
| 20/10/2022 | 5.2 |
| 20/10/2022 | 5.3 |
| 20/10/2022 | 4.7 |
| 20/10/2022 | 4.1 |
| 20/10/2022 | 3.5 |
| 20/10/2022 | 3.2 |
| 20/10/2022 | 2.9 |
| 21/10/2022 | 2.6 |
| 21/10/2022 | 2.5 |
| 21/10/2022 | 2.5 |
| 21/10/2022 | 2.6 |
| 21/10/2022 | 2.9 |
| 21/10/2022 | 3.7 |
| 21/10/2022 | 4.3 |
| 21/10/2022 | 4.7 |
| 21/10/2022 | 4.9 |
| 21/10/2022 | 5 |
| 21/10/2022 | 5 |
| 21/10/2022 | 5 |
| 21/10/2022 | 4.9 |
| 21/10/2022 | 4.8 |
| 21/10/2022 | 4.7 |
| 21/10/2022 | 4.7 |
| 21/10/2022 | 4.8 |
| 21/10/2022 | 5 |
| 21/10/2022 | 5 |
| 21/10/2022 | 4.5 |
| 21/10/2022 | 3.9 |
| 21/10/2022 | 3.4 |
| 21/10/2022 | 3.1 |
| 21/10/2022 | 2.8 |
| 22/10/2022 | 2.6 |
| 22/10/2022 | 2.5 |
| 22/10/2022 | 2.4 |
| 22/10/2022 | 2.4 |
| 22/10/2022 | 2.5 |
| 22/10/2022 | 2.8 |
| 22/10/2022 | 3.1 |
| 22/10/2022 | 3.5 |
| 22/10/2022 | 3.8 |
| 22/10/2022 | 4.1 |
| 22/10/2022 | 4.2 |
| 22/10/2022 | 4.2 |
| 22/10/2022 | 4 |
| 22/10/2022 | 3.9 |
| 22/10/2022 | 3.9 |
| 22/10/2022 | 3.9 |
| 22/10/2022 | 4 |
| 22/10/2022 | 4.3 |
| 22/10/2022 | 4.4 |
| 22/10/2022 | 4 |
| 22/10/2022 | 3.6 |
| 22/10/2022 | 3.2 |
| 22/10/2022 | 3 |
| 22/10/2022 | 2.7 |
| 23/10/2022 | 2.6 |
| 23/10/2022 | 2.4 |
| 23/10/2022 | 2.3 |
| 23/10/2022 | 2.3 |
| 23/10/2022 | 2.4 |
| 23/10/2022 | 2.5 |
| 23/10/2022 | 2.7 |
| 23/10/2022 | 3 |
| 23/10/2022 | 3.3 |
| 23/10/2022 | 3.5 |
| 23/10/2022 | 3.7 |
| 23/10/2022 | 3.8 |
| 23/10/2022 | 3.7 |
| 23/10/2022 | 3.6 |
| 23/10/2022 | 3.5 |
| 23/10/2022 | 3.6 |
| 23/10/2022 | 3.7 |
| 23/10/2022 | 4 |
| 23/10/2022 | 4.1 |
| 23/10/2022 | 3.9 |
| 23/10/2022 | 3.5 |
| 23/10/2022 | 3.2 |
| 23/10/2022 | 3 |
| 23/10/2022 | 2.7 |
| 24/10/2022 | 2.5 |
| 24/10/2022 | 2.4 |
| 24/10/2022 | 2.4 |
| 24/10/2022 | 2.5 |
| 24/10/2022 | 2.9 |
| 24/10/2022 | 3.5 |
| 24/10/2022 | 4.1 |
| 24/10/2022 | 4.5 |
| 24/10/2022 | 4.8 |
| 24/10/2022 | 4.9 |
| 24/10/2022 | 5 |
| 24/10/2022 | 5 |
| 24/10/2022 | 4.9 |
| 24/10/2022 | 4.8 |
| 24/10/2022 | 4.7 |
| 24/10/2022 | 4.7 |
| 24/10/2022 | 4.9 |
| 24/10/2022 | 5.1 |
| 24/10/2022 | 5.1 |
| 24/10/2022 | 4.7 |
| 24/10/2022 | 4 |
| 24/10/2022 | 3.5 |
| 24/10/2022 | 3.2 |
| 24/10/2022 | 2.9 |
| 25/10/2022 | 2.6 |
| 25/10/2022 | 2.5 |
| 25/10/2022 | 2.5 |
| 25/10/2022 | 2.6 |
| 25/10/2022 | 2.9 |
| 25/10/2022 | 3.6 |
| 25/10/2022 | 4.2 |
| 25/10/2022 | 4.6 |
| 25/10/2022 | 4.8 |
| 25/10/2022 | 5 |
| 25/10/2022 | 5 |
| 25/10/2022 | 5.1 |
| 25/10/2022 | 5 |
| 25/10/2022 | 4.8 |
| 25/10/2022 | 4.8 |
| 25/10/2022 | 4.8 |
| 25/10/2022 | 4.9 |
| 25/10/2022 | 5.1 |
| 25/10/2022 | 5.1 |
| 25/10/2022 | 4.7 |
| 25/10/2022 | 4.1 |
| 25/10/2022 | 3.6 |
| 25/10/2022 | 3.2 |
| 25/10/2022 | 2.9 |
| 26/10/2022 | 2.6 |
| 26/10/2022 | 2.5 |
| 26/10/2022 | 2.5 |
| 26/10/2022 | 2.6 |
| 26/10/2022 | 3 |
| 26/10/2022 | 3.6 |
| 26/10/2022 | 4.3 |
| 26/10/2022 | 4.6 |
| 26/10/2022 | 4.9 |
| 26/10/2022 | 5 |
| 26/10/2022 | 5 |
| 26/10/2022 | 5.1 |
| 26/10/2022 | 5 |
| 26/10/2022 | 4.8 |
| 26/10/2022 | 4.8 |
| 26/10/2022 | 4.8 |
| 26/10/2022 | 5 |
| 26/10/2022 | 5.2 |
| 26/10/2022 | 5.2 |
| 26/10/2022 | 4.7 |
| 26/10/2022 | 4.1 |
| 26/10/2022 | 3.6 |
| 26/10/2022 | 3.2 |
| 26/10/2022 | 2.9 |
| 27/10/2022 | 2.6 |
| 27/10/2022 | 2.5 |
| 27/10/2022 | 2.5 |
| 27/10/2022 | 2.6 |
| 27/10/2022 | 3 |
| 27/10/2022 | 3.6 |
| 27/10/2022 | 4.3 |
| 27/10/2022 | 4.7 |
| 27/10/2022 | 4.9 |
| 27/10/2022 | 5 |
| 27/10/2022 | 5.1 |
| 27/10/2022 | 5.1 |
| 27/10/2022 | 5 |
| 27/10/2022 | 4.9 |
| 27/10/2022 | 4.8 |
| 27/10/2022 | 4.8 |
| 27/10/2022 | 5 |
| 27/10/2022 | 5.1 |
| 27/10/2022 | 5.1 |
| 27/10/2022 | 4.7 |
| 27/10/2022 | 4.1 |
| 27/10/2022 | 3.6 |
| 27/10/2022 | 3.2 |
| 27/10/2022 | 2.9 |
| 28/10/2022 | 2.6 |
| 28/10/2022 | 2.5 |
| 28/10/2022 | 2.5 |
| 28/10/2022 | 2.6 |
| 28/10/2022 | 2.9 |
| 28/10/2022 | 3.6 |
| 28/10/2022 | 4.2 |
| 28/10/2022 | 4.6 |
| 28/10/2022 | 4.9 |
| 28/10/2022 | 5 |
| 28/10/2022 | 5.1 |
| 28/10/2022 | 5.1 |
| 28/10/2022 | 4.9 |
| 28/10/2022 | 4.8 |
| 28/10/2022 | 4.7 |
| 28/10/2022 | 4.7 |
| 28/10/2022 | 4.8 |
| 28/10/2022 | 4.9 |
| 28/10/2022 | 4.9 |
| 28/10/2022 | 4.5 |
| 28/10/2022 | 3.9 |
| 28/10/2022 | 3.5 |
| 28/10/2022 | 3.2 |
| 28/10/2022 | 2.9 |
| 29/10/2022 | 2.7 |
| 29/10/2022 | 2.5 |
| 29/10/2022 | 2.4 |
| 29/10/2022 | 2.4 |
| 29/10/2022 | 2.5 |
| 29/10/2022 | 2.7 |
| 29/10/2022 | 3 |
| 29/10/2022 | 3.4 |
| 29/10/2022 | 3.8 |
| 29/10/2022 | 4.1 |
| 29/10/2022 | 4.2 |
| 29/10/2022 | 4.2 |
| 29/10/2022 | 4 |
| 29/10/2022 | 3.9 |
| 29/10/2022 | 3.9 |
| 29/10/2022 | 3.9 |
| 29/10/2022 | 4 |
| 29/10/2022 | 4.2 |
| 29/10/2022 | 4.2 |
| 29/10/2022 | 4 |
| 29/10/2022 | 3.5 |
| 29/10/2022 | 3.2 |
| 29/10/2022 | 3 |
| 29/10/2022 | 2.8 |
| 30/10/2022 | 2.5 |
| 30/10/2022 | 2.4 |
| 30/10/2022 | 2.4 |
| 30/10/2022 | 2.3 |
| 30/10/2022 | 2.3 |
| 30/10/2022 | 2.3 |
| 30/10/2022 | 2.4 |
| 30/10/2022 | 2.6 |
| 30/10/2022 | 2.9 |
| 30/10/2022 | 3.2 |
| 30/10/2022 | 3.5 |
| 30/10/2022 | 3.6 |
| 30/10/2022 | 3.7 |
| 30/10/2022 | 3.6 |
| 30/10/2022 | 3.5 |
| 30/10/2022 | 3.5 |
| 30/10/2022 | 3.7 |
| 30/10/2022 | 4 |
| 30/10/2022 | 4.2 |
| 30/10/2022 | 4.1 |
| 30/10/2022 | 3.7 |
| 30/10/2022 | 3.4 |
| 30/10/2022 | 3.2 |
| 30/10/2022 | 3 |
| 30/10/2022 | 2.8 |
| 31/10/2022 | 2.5 |
| 31/10/2022 | 2.4 |
| 31/10/2022 | 2.4 |
| 31/10/2022 | 2.5 |
| 31/10/2022 | 2.8 |
| 31/10/2022 | 3.5 |
| 31/10/2022 | 4.1 |
| 31/10/2022 | 4.6 |
| 31/10/2022 | 4.8 |
| 31/10/2022 | 4.9 |
| 31/10/2022 | 5 |
| 31/10/2022 | 5 |
| 31/10/2022 | 4.9 |
| 31/10/2022 | 4.9 |
| 31/10/2022 | 4.8 |
| 31/10/2022 | 5 |
| 31/10/2022 | 5.4 |
| 31/10/2022 | 5.5 |
| 31/10/2022 | 5.3 |
| 31/10/2022 | 4.6 |
| 31/10/2022 | 4 |
| 31/10/2022 | 3.5 |
| 31/10/2022 | 3.2 |
| 31/10/2022 | 2.9 |
| 01/11/2022 | 2.6 |
| 01/11/2022 | 2.5 |
| 01/11/2022 | 2.5 |
| 01/11/2022 | 2.6 |
| 01/11/2022 | 2.9 |
| 01/11/2022 | 3.6 |
| 01/11/2022 | 4.2 |
| 01/11/2022 | 4.7 |
| 01/11/2022 | 4.9 |
| 01/11/2022 | 5 |
| 01/11/2022 | 5.1 |
| 01/11/2022 | 5.1 |
| 01/11/2022 | 5 |
| 01/11/2022 | 4.9 |
| 01/11/2022 | 4.9 |
| 01/11/2022 | 5.1 |
| 01/11/2022 | 5.4 |
| 01/11/2022 | 5.6 |
| 01/11/2022 | 5.4 |
| 01/11/2022 | 4.7 |
| 01/11/2022 | 4 |
| 01/11/2022 | 3.6 |
| 01/11/2022 | 3.2 |
| 01/11/2022 | 2.9 |
| 02/11/2022 | 2.6 |
| 02/11/2022 | 2.5 |
| 02/11/2022 | 2.5 |
| 02/11/2022 | 2.6 |
| 02/11/2022 | 2.9 |
| 02/11/2022 | 3.6 |
| 02/11/2022 | 4.3 |
| 02/11/2022 | 4.7 |
| 02/11/2022 | 4.9 |
| 02/11/2022 | 5 |
| 02/11/2022 | 5.1 |
| 02/11/2022 | 5.1 |
| 02/11/2022 | 5 |
| 02/11/2022 | 4.9 |
| 02/11/2022 | 4.9 |
| 02/11/2022 | 5.1 |
| 02/11/2022 | 5.5 |
| 02/11/2022 | 5.6 |
| 02/11/2022 | 5.4 |
| 02/11/2022 | 4.7 |
| 02/11/2022 | 4 |
| 02/11/2022 | 3.6 |
| 02/11/2022 | 3.2 |
| 02/11/2022 | 2.9 |
| 03/11/2022 | 2.6 |
| 03/11/2022 | 2.5 |
| 03/11/2022 | 2.5 |
| 03/11/2022 | 2.6 |
| 03/11/2022 | 3 |
| 03/11/2022 | 3.6 |
| 03/11/2022 | 4.3 |
| 03/11/2022 | 4.7 |
| 03/11/2022 | 4.9 |
| 03/11/2022 | 5 |
| 03/11/2022 | 5.1 |
| 03/11/2022 | 5.1 |
| 03/11/2022 | 5 |
| 03/11/2022 | 5 |
| 03/11/2022 | 4.9 |
| 03/11/2022 | 5.1 |
| 03/11/2022 | 5.5 |
| 03/11/2022 | 5.6 |
| 03/11/2022 | 5.3 |
| 03/11/2022 | 4.6 |
| 03/11/2022 | 4 |
| 03/11/2022 | 3.6 |
| 03/11/2022 | 3.2 |
| 03/11/2022 | 3 |
| 04/11/2022 | 2.6 |
| 04/11/2022 | 2.5 |
| 04/11/2022 | 2.5 |
| 04/11/2022 | 2.6 |
| 04/11/2022 | 2.9 |
| 04/11/2022 | 3.6 |
| 04/11/2022 | 4.2 |
| 04/11/2022 | 4.7 |
| 04/11/2022 | 4.9 |
| 04/11/2022 | 5.1 |
| 04/11/2022 | 5.1 |
| 04/11/2022 | 5.1 |
| 04/11/2022 | 5 |
| 04/11/2022 | 4.9 |
| 04/11/2022 | 4.8 |
| 04/11/2022 | 5 |
| 04/11/2022 | 5.3 |
| 04/11/2022 | 5.3 |
| 04/11/2022 | 5.1 |
| 04/11/2022 | 4.4 |
| 04/11/2022 | 3.9 |
| 04/11/2022 | 3.5 |
| 04/11/2022 | 3.2 |
| 04/11/2022 | 2.9 |
| 05/11/2022 | 2.7 |
| 05/11/2022 | 2.5 |
| 05/11/2022 | 2.5 |
| 05/11/2022 | 2.5 |
| 05/11/2022 | 2.6 |
| 05/11/2022 | 2.8 |
| 05/11/2022 | 3.1 |
| 05/11/2022 | 3.6 |
| 05/11/2022 | 4 |
| 05/11/2022 | 4.2 |
| 05/11/2022 | 4.3 |
| 05/11/2022 | 4.3 |
| 05/11/2022 | 4.2 |
| 05/11/2022 | 4.1 |
| 05/11/2022 | 4.1 |
| 05/11/2022 | 4.3 |
| 05/11/2022 | 4.6 |
| 05/11/2022 | 4.7 |
| 05/11/2022 | 4.6 |
| 05/11/2022 | 4.1 |
| 05/11/2022 | 3.6 |
| 05/11/2022 | 3.3 |
| 05/11/2022 | 3 |
| 05/11/2022 | 2.8 |
| 06/11/2022 | 2.6 |
| 06/11/2022 | 2.4 |
| 06/11/2022 | 2.4 |
| 06/11/2022 | 2.4 |
| 06/11/2022 | 2.4 |
| 06/11/2022 | 2.5 |
| 06/11/2022 | 2.7 |
| 06/11/2022 | 3.1 |
| 06/11/2022 | 3.4 |
| 06/11/2022 | 3.6 |
| 06/11/2022 | 3.8 |
| 06/11/2022 | 3.9 |
| 06/11/2022 | 3.8 |
| 06/11/2022 | 3.8 |
| 06/11/2022 | 3.8 |
| 06/11/2022 | 4 |
| 06/11/2022 | 4.3 |
| 06/11/2022 | 4.5 |
| 06/11/2022 | 4.3 |
| 06/11/2022 | 3.9 |
| 06/11/2022 | 3.6 |
| 06/11/2022 | 3.4 |
| 06/11/2022 | 3.1 |
| 06/11/2022 | 2.8 |
| 07/11/2022 | 2.6 |
| 07/11/2022 | 2.4 |
| 07/11/2022 | 2.4 |
| 07/11/2022 | 2.6 |
| 07/11/2022 | 2.9 |
| 07/11/2022 | 3.7 |
| 07/11/2022 | 4.4 |
| 07/11/2022 | 4.9 |
| 07/11/2022 | 5.1 |
| 07/11/2022 | 5.2 |
| 07/11/2022 | 5.2 |
| 07/11/2022 | 5.3 |
| 07/11/2022 | 5.2 |
| 07/11/2022 | 5.1 |
| 07/11/2022 | 5.1 |
| 07/11/2022 | 5.4 |
| 07/11/2022 | 5.7 |
| 07/11/2022 | 5.8 |
| 07/11/2022 | 5.6 |
| 07/11/2022 | 4.8 |
| 07/11/2022 | 4.2 |
| 07/11/2022 | 3.7 |
| 07/11/2022 | 3.3 |
| 07/11/2022 | 3 |
| 08/11/2022 | 2.7 |
| 08/11/2022 | 2.5 |
| 08/11/2022 | 2.5 |
| 08/11/2022 | 2.7 |
| 08/11/2022 | 3 |
| 08/11/2022 | 3.8 |
| 08/11/2022 | 4.5 |
| 08/11/2022 | 5 |
| 08/11/2022 | 5.1 |
| 08/11/2022 | 5.3 |
| 08/11/2022 | 5.3 |
| 08/11/2022 | 5.3 |
| 08/11/2022 | 5.3 |
| 08/11/2022 | 5.2 |
| 08/11/2022 | 5.2 |
| 08/11/2022 | 5.5 |
| 08/11/2022 | 5.8 |
| 08/11/2022 | 5.9 |
| 08/11/2022 | 5.6 |
| 08/11/2022 | 4.9 |
| 08/11/2022 | 4.2 |
| 08/11/2022 | 3.8 |
| 08/11/2022 | 3.4 |
| 08/11/2022 | 3 |
| 09/11/2022 | 2.7 |
| 09/11/2022 | 2.6 |
| 09/11/2022 | 2.5 |
| 09/11/2022 | 2.7 |
| 09/11/2022 | 3.1 |
| 09/11/2022 | 3.8 |
| 09/11/2022 | 4.6 |
| 09/11/2022 | 5 |
| 09/11/2022 | 5.2 |
| 09/11/2022 | 5.3 |
| 09/11/2022 | 5.3 |
| 09/11/2022 | 5.3 |
| 09/11/2022 | 5.3 |
| 09/11/2022 | 5.2 |
| 09/11/2022 | 5.2 |
| 09/11/2022 | 5.5 |
| 09/11/2022 | 5.8 |
| 09/11/2022 | 5.9 |
| 09/11/2022 | 5.6 |
| 09/11/2022 | 4.9 |
| 09/11/2022 | 4.2 |
| 09/11/2022 | 3.8 |
| 09/11/2022 | 3.4 |
| 09/11/2022 | 3 |
| 10/11/2022 | 2.7 |
| 10/11/2022 | 2.6 |
| 10/11/2022 | 2.5 |
| 10/11/2022 | 2.7 |
| 10/11/2022 | 3.1 |
| 10/11/2022 | 3.8 |
| 10/11/2022 | 4.6 |
| 10/11/2022 | 5 |
| 10/11/2022 | 5.2 |
| 10/11/2022 | 5.3 |
| 10/11/2022 | 5.3 |
| 10/11/2022 | 5.3 |
| 10/11/2022 | 5.3 |
| 10/11/2022 | 5.2 |
| 10/11/2022 | 5.2 |
| 10/11/2022 | 5.5 |
| 10/11/2022 | 5.8 |
| 10/11/2022 | 5.9 |
| 10/11/2022 | 5.6 |
| 10/11/2022 | 4.9 |
| 10/11/2022 | 4.2 |
| 10/11/2022 | 3.8 |
| 10/11/2022 | 3.4 |
| 10/11/2022 | 3 |
| 11/11/2022 | 2.7 |
| 11/11/2022 | 2.6 |
| 11/11/2022 | 2.5 |
| 11/11/2022 | 2.7 |
| 11/11/2022 | 3 |
| 11/11/2022 | 3.8 |
| 11/11/2022 | 4.5 |
| 11/11/2022 | 5 |
| 11/11/2022 | 5.2 |
| 11/11/2022 | 5.3 |
| 11/11/2022 | 5.3 |
| 11/11/2022 | 5.3 |
| 11/11/2022 | 5.2 |
| 11/11/2022 | 5.1 |
| 11/11/2022 | 5.1 |
| 11/11/2022 | 5.4 |
| 11/11/2022 | 5.6 |
| 11/11/2022 | 5.6 |
| 11/11/2022 | 5.3 |
| 11/11/2022 | 4.7 |
| 11/11/2022 | 4.1 |
| 11/11/2022 | 3.6 |
| 11/11/2022 | 3.3 |
| 11/11/2022 | 3 |
| 12/11/2022 | 2.7 |
| 12/11/2022 | 2.6 |
| 12/11/2022 | 2.5 |
| 12/11/2022 | 2.5 |
| 12/11/2022 | 2.6 |
| 12/11/2022 | 2.9 |
| 12/11/2022 | 3.2 |
| 12/11/2022 | 3.6 |
| 12/11/2022 | 4.1 |
| 12/11/2022 | 4.3 |
| 12/11/2022 | 4.4 |
| 12/11/2022 | 4.4 |
| 12/11/2022 | 4.3 |
| 12/11/2022 | 4.2 |
| 12/11/2022 | 4.2 |
| 12/11/2022 | 4.5 |
| 12/11/2022 | 4.8 |
| 12/11/2022 | 4.8 |
| 12/11/2022 | 4.6 |
| 12/11/2022 | 4.2 |
| 12/11/2022 | 3.7 |
| 12/11/2022 | 3.4 |
| 12/11/2022 | 3.1 |
| 12/11/2022 | 2.9 |
| 13/11/2022 | 2.6 |
| 13/11/2022 | 2.5 |
| 13/11/2022 | 2.4 |
| 13/11/2022 | 2.4 |
| 13/11/2022 | 2.4 |
| 13/11/2022 | 2.6 |
| 13/11/2022 | 2.8 |
| 13/11/2022 | 3.1 |
| 13/11/2022 | 3.5 |
| 13/11/2022 | 3.7 |
| 13/11/2022 | 3.9 |
| 13/11/2022 | 4 |
| 13/11/2022 | 3.9 |
| 13/11/2022 | 3.9 |
| 13/11/2022 | 3.9 |
| 13/11/2022 | 4.2 |
| 13/11/2022 | 4.5 |
| 13/11/2022 | 4.6 |
| 13/11/2022 | 4.4 |
| 13/11/2022 | 4 |
| 13/11/2022 | 3.7 |
| 13/11/2022 | 3.5 |
| 13/11/2022 | 3.2 |
| 13/11/2022 | 2.9 |
| 14/11/2022 | 2.6 |
| 14/11/2022 | 2.5 |
| 14/11/2022 | 2.5 |
| 14/11/2022 | 2.6 |
| 14/11/2022 | 3 |
| 14/11/2022 | 3.8 |
| 14/11/2022 | 4.5 |
| 14/11/2022 | 5 |
| 14/11/2022 | 5.2 |
| 14/11/2022 | 5.3 |
| 14/11/2022 | 5.4 |
| 14/11/2022 | 5.4 |
| 14/11/2022 | 5.3 |
| 14/11/2022 | 5.3 |
| 14/11/2022 | 5.3 |
| 14/11/2022 | 5.6 |
| 14/11/2022 | 5.9 |
| 14/11/2022 | 5.9 |
| 14/11/2022 | 5.6 |
| 14/11/2022 | 5 |
| 14/11/2022 | 4.3 |
| 14/11/2022 | 3.8 |
| 14/11/2022 | 3.4 |
| 14/11/2022 | 3 |
| 15/11/2022 | 2.7 |
| 15/11/2022 | 2.6 |
| 15/11/2022 | 2.6 |
| 15/11/2022 | 2.7 |
| 15/11/2022 | 3.1 |
| 15/11/2022 | 3.9 |
| 15/11/2022 | 4.6 |
| 15/11/2022 | 5.1 |
| 15/11/2022 | 5.3 |
| 15/11/2022 | 5.4 |
| 15/11/2022 | 5.5 |
| 15/11/2022 | 5.5 |
| 15/11/2022 | 5.4 |
| 15/11/2022 | 5.3 |
| 15/11/2022 | 5.3 |
| 15/11/2022 | 5.7 |
| 15/11/2022 | 6 |
| 15/11/2022 | 6 |
| 15/11/2022 | 5.7 |
| 15/11/2022 | 5 |
| 15/11/2022 | 4.3 |
| 15/11/2022 | 3.9 |
| 15/11/2022 | 3.5 |
| 15/11/2022 | 3.1 |
| 16/11/2022 | 2.7 |
| 16/11/2022 | 2.6 |
| 16/11/2022 | 2.6 |
| 16/11/2022 | 2.7 |
| 16/11/2022 | 3.1 |
| 16/11/2022 | 3.9 |
| 16/11/2022 | 4.7 |
| 16/11/2022 | 5.1 |
| 16/11/2022 | 5.3 |
| 16/11/2022 | 5.4 |
| 16/11/2022 | 5.5 |
| 16/11/2022 | 5.5 |
| 16/11/2022 | 5.4 |
| 16/11/2022 | 5.3 |
| 16/11/2022 | 5.3 |
| 16/11/2022 | 5.7 |
| 16/11/2022 | 6 |
| 16/11/2022 | 6 |
| 16/11/2022 | 5.7 |
| 16/11/2022 | 5 |
| 16/11/2022 | 4.4 |
| 16/11/2022 | 3.9 |
| 16/11/2022 | 3.5 |
| 16/11/2022 | 3.1 |
| 17/11/2022 | 2.7 |
| 17/11/2022 | 2.6 |
| 17/11/2022 | 2.6 |
| 17/11/2022 | 2.7 |
| 17/11/2022 | 3.1 |
| 17/11/2022 | 3.9 |
| 17/11/2022 | 4.7 |
| 17/11/2022 | 5.1 |
| 17/11/2022 | 5.3 |
| 17/11/2022 | 5.4 |
| 17/11/2022 | 5.5 |
| 17/11/2022 | 5.5 |
| 17/11/2022 | 5.4 |
| 17/11/2022 | 5.4 |
| 17/11/2022 | 5.4 |
| 17/11/2022 | 5.7 |
| 17/11/2022 | 6 |
| 17/11/2022 | 6 |
| 17/11/2022 | 5.6 |
| 17/11/2022 | 5 |
| 17/11/2022 | 4.3 |
| 17/11/2022 | 3.9 |
| 17/11/2022 | 3.5 |
| 17/11/2022 | 3.1 |
| 18/11/2022 | 2.8 |
| 18/11/2022 | 2.6 |
| 18/11/2022 | 2.6 |
| 18/11/2022 | 2.7 |
| 18/11/2022 | 3.1 |
| 18/11/2022 | 3.9 |
| 18/11/2022 | 4.6 |
| 18/11/2022 | 5.1 |
| 18/11/2022 | 5.3 |
| 18/11/2022 | 5.4 |
| 18/11/2022 | 5.5 |
| 18/11/2022 | 5.5 |
| 18/11/2022 | 5.3 |
| 18/11/2022 | 5.3 |
| 18/11/2022 | 5.3 |
| 18/11/2022 | 5.6 |
| 18/11/2022 | 5.8 |
| 18/11/2022 | 5.7 |
| 18/11/2022 | 5.4 |
| 18/11/2022 | 4.8 |
| 18/11/2022 | 4.2 |
| 18/11/2022 | 3.7 |
| 18/11/2022 | 3.4 |
| 18/11/2022 | 3.1 |
| 19/11/2022 | 2.8 |
| 19/11/2022 | 2.6 |
| 19/11/2022 | 2.6 |
| 19/11/2022 | 2.5 |
| 19/11/2022 | 2.6 |
| 19/11/2022 | 2.9 |
| 19/11/2022 | 3.3 |
| 19/11/2022 | 3.7 |
| 19/11/2022 | 4.2 |
| 19/11/2022 | 4.4 |
| 19/11/2022 | 4.6 |
| 19/11/2022 | 4.5 |
| 19/11/2022 | 4.4 |
| 19/11/2022 | 4.3 |
| 19/11/2022 | 4.4 |
| 19/11/2022 | 4.7 |
| 19/11/2022 | 4.9 |
| 19/11/2022 | 4.9 |
| 19/11/2022 | 4.7 |
| 19/11/2022 | 4.2 |
| 19/11/2022 | 3.8 |
| 19/11/2022 | 3.5 |
| 19/11/2022 | 3.2 |
| 19/11/2022 | 3 |
| 20/11/2022 | 2.7 |
| 20/11/2022 | 2.5 |
| 20/11/2022 | 2.5 |
| 20/11/2022 | 2.4 |
| 20/11/2022 | 2.5 |
| 20/11/2022 | 2.6 |
| 20/11/2022 | 2.9 |
| 20/11/2022 | 3.2 |
| 20/11/2022 | 3.6 |
| 20/11/2022 | 3.8 |
| 20/11/2022 | 4 |
| 20/11/2022 | 4.1 |
| 20/11/2022 | 4 |
| 20/11/2022 | 4 |
| 20/11/2022 | 4 |
| 20/11/2022 | 4.3 |
| 20/11/2022 | 4.7 |
| 20/11/2022 | 4.7 |
| 20/11/2022 | 4.4 |
| 20/11/2022 | 4.1 |
| 20/11/2022 | 3.8 |
| 20/11/2022 | 3.6 |
| 20/11/2022 | 3.3 |
| 20/11/2022 | 3 |
| 21/11/2022 | 2.6 |
| 21/11/2022 | 2.5 |
| 21/11/2022 | 2.5 |
| 21/11/2022 | 2.7 |
| 21/11/2022 | 3.1 |
| 21/11/2022 | 3.9 |
| 21/11/2022 | 4.6 |
| 21/11/2022 | 5.1 |
| 21/11/2022 | 5.3 |
| 21/11/2022 | 5.5 |
| 21/11/2022 | 5.5 |
| 21/11/2022 | 5.5 |
| 21/11/2022 | 5.5 |
| 21/11/2022 | 5.4 |
| 21/11/2022 | 5.4 |
| 21/11/2022 | 5.8 |
| 21/11/2022 | 6.1 |
| 21/11/2022 | 6 |
| 21/11/2022 | 5.7 |
| 21/11/2022 | 5.1 |
| 21/11/2022 | 4.4 |
| 21/11/2022 | 3.9 |
| 21/11/2022 | 3.5 |
| 21/11/2022 | 3.1 |
| 22/11/2022 | 2.8 |
| 22/11/2022 | 2.6 |
| 22/11/2022 | 2.6 |
| 22/11/2022 | 2.8 |
| 22/11/2022 | 3.1 |
| 22/11/2022 | 3.9 |
| 22/11/2022 | 4.7 |
| 22/11/2022 | 5.2 |
| 22/11/2022 | 5.4 |
| 22/11/2022 | 5.5 |
| 22/11/2022 | 5.6 |
| 22/11/2022 | 5.6 |
| 22/11/2022 | 5.5 |
| 22/11/2022 | 5.5 |
| 22/11/2022 | 5.5 |
| 22/11/2022 | 5.9 |
| 22/11/2022 | 6.2 |
| 22/11/2022 | 6.1 |
| 22/11/2022 | 5.7 |
| 22/11/2022 | 5.1 |
| 22/11/2022 | 4.4 |
| 22/11/2022 | 4 |
| 22/11/2022 | 3.6 |
| 22/11/2022 | 3.1 |
| 23/11/2022 | 2.8 |
| 23/11/2022 | 2.6 |
| 23/11/2022 | 2.6 |
| 23/11/2022 | 2.8 |
| 23/11/2022 | 3.1 |
| 23/11/2022 | 4 |
| 23/11/2022 | 4.7 |
| 23/11/2022 | 5.2 |
| 23/11/2022 | 5.4 |
| 23/11/2022 | 5.5 |
| 23/11/2022 | 5.6 |
| 23/11/2022 | 5.6 |
| 23/11/2022 | 5.5 |
| 23/11/2022 | 5.4 |
| 23/11/2022 | 5.5 |
| 23/11/2022 | 5.9 |
| 23/11/2022 | 6.2 |
| 23/11/2022 | 6.1 |
| 23/11/2022 | 5.7 |
| 23/11/2022 | 5.1 |
| 23/11/2022 | 4.4 |
| 23/11/2022 | 4 |
| 23/11/2022 | 3.6 |
| 23/11/2022 | 3.1 |
| 24/11/2022 | 2.8 |
| 24/11/2022 | 2.6 |
| 24/11/2022 | 2.6 |
| 24/11/2022 | 2.8 |
| 24/11/2022 | 3.1 |
| 24/11/2022 | 3.9 |
| 24/11/2022 | 4.7 |
| 24/11/2022 | 5.2 |
| 24/11/2022 | 5.4 |
| 24/11/2022 | 5.5 |
| 24/11/2022 | 5.6 |
| 24/11/2022 | 5.6 |
| 24/11/2022 | 5.5 |
| 24/11/2022 | 5.5 |
| 24/11/2022 | 5.5 |
| 24/11/2022 | 5.9 |
| 24/11/2022 | 6.1 |
| 24/11/2022 | 6 |
| 24/11/2022 | 5.7 |
| 24/11/2022 | 5.1 |
| 24/11/2022 | 4.4 |
| 24/11/2022 | 4 |
| 24/11/2022 | 3.6 |
| 24/11/2022 | 3.1 |
| 25/11/2022 | 2.8 |
| 25/11/2022 | 2.6 |
| 25/11/2022 | 2.6 |
| 25/11/2022 | 2.8 |
| 25/11/2022 | 3.1 |
| 25/11/2022 | 3.9 |
| 25/11/2022 | 4.7 |
| 25/11/2022 | 5.1 |
| 25/11/2022 | 5.3 |
| 25/11/2022 | 5.5 |
| 25/11/2022 | 5.5 |
| 25/11/2022 | 5.5 |
| 25/11/2022 | 5.4 |
| 25/11/2022 | 5.3 |
| 25/11/2022 | 5.3 |
| 25/11/2022 | 5.7 |
| 25/11/2022 | 5.9 |
| 25/11/2022 | 5.8 |
| 25/11/2022 | 5.4 |
| 25/11/2022 | 4.8 |
| 25/11/2022 | 4.2 |
| 25/11/2022 | 3.8 |
| 25/11/2022 | 3.5 |
| 25/11/2022 | 3.1 |
| 26/11/2022 | 2.8 |
| 26/11/2022 | 2.6 |
| 26/11/2022 | 2.6 |
| 26/11/2022 | 2.5 |
| 26/11/2022 | 2.7 |
| 26/11/2022 | 2.9 |
| 26/11/2022 | 3.3 |
| 26/11/2022 | 3.7 |
| 26/11/2022 | 4.2 |
| 26/11/2022 | 4.5 |
| 26/11/2022 | 4.6 |
| 26/11/2022 | 4.6 |
| 26/11/2022 | 4.5 |
| 26/11/2022 | 4.4 |
| 26/11/2022 | 4.4 |
| 26/11/2022 | 4.7 |
| 26/11/2022 | 5 |
| 26/11/2022 | 4.9 |
| 26/11/2022 | 4.7 |
| 26/11/2022 | 4.3 |
| 26/11/2022 | 3.8 |
| 26/11/2022 | 3.5 |
| 26/11/2022 | 3.3 |
| 26/11/2022 | 3 |
| 27/11/2022 | 2.7 |
| 27/11/2022 | 2.5 |
| 27/11/2022 | 2.5 |
| 27/11/2022 | 2.4 |
| 27/11/2022 | 2.5 |
| 27/11/2022 | 2.6 |
| 27/11/2022 | 2.9 |
| 27/11/2022 | 3.2 |
| 27/11/2022 | 3.6 |
| 27/11/2022 | 3.9 |
| 27/11/2022 | 4.1 |
| 27/11/2022 | 4.1 |
| 27/11/2022 | 4.1 |
| 27/11/2022 | 4 |
| 27/11/2022 | 4 |
| 27/11/2022 | 4.4 |
| 27/11/2022 | 4.7 |
| 27/11/2022 | 4.7 |
| 27/11/2022 | 4.4 |
| 27/11/2022 | 4.1 |
| 27/11/2022 | 3.8 |
| 27/11/2022 | 3.6 |
| 27/11/2022 | 3.3 |
| 27/11/2022 | 3 |
| 28/11/2022 | 2.6 |
| 28/11/2022 | 2.5 |
| 28/11/2022 | 2.5 |
| 28/11/2022 | 2.7 |
| 28/11/2022 | 3 |
| 28/11/2022 | 3.8 |
| 28/11/2022 | 4.6 |
| 28/11/2022 | 5.1 |
| 28/11/2022 | 5.3 |
| 28/11/2022 | 5.4 |
| 28/11/2022 | 5.5 |
| 28/11/2022 | 5.5 |
| 28/11/2022 | 5.5 |
| 28/11/2022 | 5.4 |
| 28/11/2022 | 5.4 |
| 28/11/2022 | 5.8 |
| 28/11/2022 | 6.1 |
| 28/11/2022 | 6 |
| 28/11/2022 | 5.7 |
| 28/11/2022 | 5.1 |
| 28/11/2022 | 4.4 |
| 28/11/2022 | 4 |
| 28/11/2022 | 3.5 |
| 28/11/2022 | 3.1 |
| 29/11/2022 | 2.8 |
| 29/11/2022 | 2.6 |
| 29/11/2022 | 2.6 |
| 29/11/2022 | 2.8 |
| 29/11/2022 | 3.1 |
| 29/11/2022 | 3.9 |
| 29/11/2022 | 4.7 |
| 29/11/2022 | 5.1 |
| 29/11/2022 | 5.3 |
| 29/11/2022 | 5.5 |
| 29/11/2022 | 5.6 |
| 29/11/2022 | 5.6 |
| 29/11/2022 | 5.5 |
| 29/11/2022 | 5.5 |
| 29/11/2022 | 5.5 |
| 29/11/2022 | 5.9 |
| 29/11/2022 | 6.1 |
| 29/11/2022 | 6 |
| 29/11/2022 | 5.7 |
| 29/11/2022 | 5.1 |
| 29/11/2022 | 4.4 |
| 29/11/2022 | 4 |
| 29/11/2022 | 3.6 |
| 29/11/2022 | 3.1 |
| 30/11/2022 | 2.8 |
| 30/11/2022 | 2.6 |
| 30/11/2022 | 2.6 |
| 30/11/2022 | 2.8 |
| 30/11/2022 | 3.1 |
| 30/11/2022 | 3.9 |
| 30/11/2022 | 4.7 |
| 30/11/2022 | 5.1 |
| 30/11/2022 | 5.3 |
| 30/11/2022 | 5.5 |
| 30/11/2022 | 5.6 |
| 30/11/2022 | 5.6 |
| 30/11/2022 | 5.5 |
| 30/11/2022 | 5.4 |
| 30/11/2022 | 5.5 |
| 30/11/2022 | 5.9 |
| 30/11/2022 | 6.1 |
| 30/11/2022 | 6 |
| 30/11/2022 | 5.7 |
| 30/11/2022 | 5.1 |
| 30/11/2022 | 4.4 |
| 30/11/2022 | 4 |
| 30/11/2022 | 3.6 |
| 30/11/2022 | 3.1 |
| 01/12/2022 | 2.8 |
| 01/12/2022 | 2.6 |
| 01/12/2022 | 2.6 |
| 01/12/2022 | 2.8 |
| 01/12/2022 | 3.1 |
| 01/12/2022 | 3.9 |
| 01/12/2022 | 4.7 |
| 01/12/2022 | 5.1 |
| 01/12/2022 | 5.3 |
| 01/12/2022 | 5.5 |
| 01/12/2022 | 5.6 |
| 01/12/2022 | 5.6 |
| 01/12/2022 | 5.5 |
| 01/12/2022 | 5.5 |
| 01/12/2022 | 5.5 |
| 01/12/2022 | 5.9 |
| 01/12/2022 | 6.1 |
| 01/12/2022 | 6 |
| 01/12/2022 | 5.6 |
| 01/12/2022 | 5 |
| 01/12/2022 | 4.4 |
| 01/12/2022 | 3.9 |
| 01/12/2022 | 3.5 |
| 01/12/2022 | 3.1 |
| 02/12/2022 | 2.8 |
| 02/12/2022 | 2.6 |
| 02/12/2022 | 2.6 |
| 02/12/2022 | 2.7 |
| 02/12/2022 | 3.1 |
| 02/12/2022 | 3.9 |
| 02/12/2022 | 4.6 |
| 02/12/2022 | 5.1 |
| 02/12/2022 | 5.3 |
| 02/12/2022 | 5.5 |
| 02/12/2022 | 5.5 |
| 02/12/2022 | 5.5 |
| 02/12/2022 | 5.4 |
| 02/12/2022 | 5.3 |
| 02/12/2022 | 5.4 |
| 02/12/2022 | 5.7 |
| 02/12/2022 | 5.9 |
| 02/12/2022 | 5.7 |
| 02/12/2022 | 5.4 |
| 02/12/2022 | 4.8 |
| 02/12/2022 | 4.2 |
| 02/12/2022 | 3.8 |
| 02/12/2022 | 3.5 |
| 02/12/2022 | 3.1 |
| 03/12/2022 | 2.8 |
| 03/12/2022 | 2.6 |
| 03/12/2022 | 2.6 |
| 03/12/2022 | 2.5 |
| 03/12/2022 | 2.6 |
| 03/12/2022 | 2.9 |
| 03/12/2022 | 3.3 |
| 03/12/2022 | 3.7 |
| 03/12/2022 | 4.1 |
| 03/12/2022 | 4.4 |
| 03/12/2022 | 4.6 |
| 03/12/2022 | 4.6 |
| 03/12/2022 | 4.5 |
| 03/12/2022 | 4.4 |
| 03/12/2022 | 4.4 |
| 03/12/2022 | 4.7 |
| 03/12/2022 | 4.9 |
| 03/12/2022 | 4.9 |
| 03/12/2022 | 4.7 |
| 03/12/2022 | 4.3 |
| 03/12/2022 | 3.8 |
| 03/12/2022 | 3.5 |
| 03/12/2022 | 3.3 |
| 03/12/2022 | 3 |
| 04/12/2022 | 2.7 |
| 04/12/2022 | 2.5 |
| 04/12/2022 | 2.5 |
| 04/12/2022 | 2.4 |
| 04/12/2022 | 2.5 |
| 04/12/2022 | 2.6 |
| 04/12/2022 | 2.9 |
| 04/12/2022 | 3.2 |
| 04/12/2022 | 3.6 |
| 04/12/2022 | 3.8 |
| 04/12/2022 | 4 |
| 04/12/2022 | 4.1 |
| 04/12/2022 | 4.1 |
| 04/12/2022 | 4 |
| 04/12/2022 | 4 |
| 04/12/2022 | 4.4 |
| 04/12/2022 | 4.6 |
| 04/12/2022 | 4.6 |
| 04/12/2022 | 4.4 |
| 04/12/2022 | 4.1 |
| 04/12/2022 | 3.8 |
| 04/12/2022 | 3.6 |
| 04/12/2022 | 3.3 |
| 04/12/2022 | 3 |
| 05/12/2022 | 2.6 |
| 05/12/2022 | 2.5 |
| 05/12/2022 | 2.5 |
| 05/12/2022 | 2.7 |
| 05/12/2022 | 3 |
| 05/12/2022 | 3.8 |
| 05/12/2022 | 4.6 |
| 05/12/2022 | 5 |
| 05/12/2022 | 5.2 |
| 05/12/2022 | 5.4 |
| 05/12/2022 | 5.5 |
| 05/12/2022 | 5.5 |
| 05/12/2022 | 5.5 |
| 05/12/2022 | 5.4 |
| 05/12/2022 | 5.5 |
| 05/12/2022 | 5.8 |
| 05/12/2022 | 6 |
| 05/12/2022 | 6 |
| 05/12/2022 | 5.7 |
| 05/12/2022 | 5 |
| 05/12/2022 | 4.4 |
| 05/12/2022 | 3.9 |
| 05/12/2022 | 3.5 |
| 05/12/2022 | 3.1 |
| 06/12/2022 | 2.8 |
| 06/12/2022 | 2.6 |
| 06/12/2022 | 2.6 |
| 06/12/2022 | 2.7 |
| 06/12/2022 | 3.1 |
| 06/12/2022 | 3.9 |
| 06/12/2022 | 4.7 |
| 06/12/2022 | 5.1 |
| 06/12/2022 | 5.3 |
| 06/12/2022 | 5.5 |
| 06/12/2022 | 5.5 |
| 06/12/2022 | 5.6 |
| 06/12/2022 | 5.5 |
| 06/12/2022 | 5.5 |
| 06/12/2022 | 5.5 |
| 06/12/2022 | 5.9 |
| 06/12/2022 | 6.1 |
| 06/12/2022 | 6 |
| 06/12/2022 | 5.7 |
| 06/12/2022 | 5.1 |
| 06/12/2022 | 4.4 |
| 06/12/2022 | 4 |
| 06/12/2022 | 3.6 |
| 06/12/2022 | 3.1 |
| 07/12/2022 | 2.8 |
| 07/12/2022 | 2.6 |
| 07/12/2022 | 2.6 |
| 07/12/2022 | 2.7 |
| 07/12/2022 | 3.1 |
| 07/12/2022 | 3.9 |
| 07/12/2022 | 4.7 |
| 07/12/2022 | 5.1 |
| 07/12/2022 | 5.3 |
| 07/12/2022 | 5.5 |
| 07/12/2022 | 5.5 |
| 07/12/2022 | 5.5 |
| 07/12/2022 | 5.5 |
| 07/12/2022 | 5.5 |
| 07/12/2022 | 5.5 |
| 07/12/2022 | 5.9 |
| 07/12/2022 | 6.1 |
| 07/12/2022 | 6 |
| 07/12/2022 | 5.7 |
| 07/12/2022 | 5.1 |
| 07/12/2022 | 4.4 |
| 07/12/2022 | 4 |
| 07/12/2022 | 3.6 |
| 07/12/2022 | 3.2 |
| 08/12/2022 | 2.8 |
| 08/12/2022 | 2.6 |
| 08/12/2022 | 2.6 |
| 08/12/2022 | 2.7 |
| 08/12/2022 | 3.1 |
| 08/12/2022 | 3.9 |
| 08/12/2022 | 4.7 |
| 08/12/2022 | 5.1 |
| 08/12/2022 | 5.3 |
| 08/12/2022 | 5.5 |
| 08/12/2022 | 5.5 |
| 08/12/2022 | 5.6 |
| 08/12/2022 | 5.5 |
| 08/12/2022 | 5.5 |
| 08/12/2022 | 5.5 |
| 08/12/2022 | 5.9 |
| 08/12/2022 | 6 |
| 08/12/2022 | 5.9 |
| 08/12/2022 | 5.6 |
| 08/12/2022 | 5 |
| 08/12/2022 | 4.4 |
| 08/12/2022 | 3.9 |
| 08/12/2022 | 3.5 |
| 08/12/2022 | 3.2 |
| 09/12/2022 | 2.8 |
| 09/12/2022 | 2.6 |
| 09/12/2022 | 2.6 |
| 09/12/2022 | 2.7 |
| 09/12/2022 | 3.1 |
| 09/12/2022 | 3.8 |
| 09/12/2022 | 4.6 |
| 09/12/2022 | 5 |
| 09/12/2022 | 5.3 |
| 09/12/2022 | 5.4 |
| 09/12/2022 | 5.5 |
| 09/12/2022 | 5.5 |
| 09/12/2022 | 5.4 |
| 09/12/2022 | 5.3 |
| 09/12/2022 | 5.4 |
| 09/12/2022 | 5.7 |
| 09/12/2022 | 5.8 |
| 09/12/2022 | 5.7 |
| 09/12/2022 | 5.4 |
| 09/12/2022 | 4.8 |
| 09/12/2022 | 4.2 |
| 09/12/2022 | 3.8 |
| 09/12/2022 | 3.4 |
| 09/12/2022 | 3.1 |
| 10/12/2022 | 2.8 |
| 10/12/2022 | 2.6 |
| 10/12/2022 | 2.5 |
| 10/12/2022 | 2.5 |
| 10/12/2022 | 2.6 |
| 10/12/2022 | 2.9 |
| 10/12/2022 | 3.2 |
| 10/12/2022 | 3.7 |
| 10/12/2022 | 4.1 |
| 10/12/2022 | 4.4 |
| 10/12/2022 | 4.6 |
| 10/12/2022 | 4.6 |
| 10/12/2022 | 4.4 |
| 10/12/2022 | 4.4 |
| 10/12/2022 | 4.4 |
| 10/12/2022 | 4.7 |
| 10/12/2022 | 4.9 |
| 10/12/2022 | 4.9 |
| 10/12/2022 | 4.7 |
| 10/12/2022 | 4.2 |
| 10/12/2022 | 3.8 |
| 10/12/2022 | 3.5 |
| 10/12/2022 | 3.3 |
| 10/12/2022 | 3 |
| 11/12/2022 | 2.7 |
| 11/12/2022 | 2.5 |
| 11/12/2022 | 2.4 |
| 11/12/2022 | 2.4 |
| 11/12/2022 | 2.4 |
| 11/12/2022 | 2.6 |
| 11/12/2022 | 2.8 |
| 11/12/2022 | 3.2 |
| 11/12/2022 | 3.5 |
| 11/12/2022 | 3.8 |
| 11/12/2022 | 4 |
| 11/12/2022 | 4.1 |
| 11/12/2022 | 4.1 |
| 11/12/2022 | 4 |
| 11/12/2022 | 4.1 |
| 11/12/2022 | 4.4 |
| 11/12/2022 | 4.6 |
| 11/12/2022 | 4.6 |
| 11/12/2022 | 4.4 |
| 11/12/2022 | 4.1 |
| 11/12/2022 | 3.8 |
| 11/12/2022 | 3.6 |
| 11/12/2022 | 3.3 |
| 11/12/2022 | 3 |
| 12/12/2022 | 2.6 |
| 12/12/2022 | 2.5 |
| 12/12/2022 | 2.5 |
| 12/12/2022 | 2.6 |
| 12/12/2022 | 3 |
| 12/12/2022 | 3.8 |
| 12/12/2022 | 4.5 |
| 12/12/2022 | 5 |
| 12/12/2022 | 5.2 |
| 12/12/2022 | 5.4 |
| 12/12/2022 | 5.5 |
| 12/12/2022 | 5.5 |
| 12/12/2022 | 5.5 |
| 12/12/2022 | 5.4 |
| 12/12/2022 | 5.5 |
| 12/12/2022 | 5.8 |
| 12/12/2022 | 6 |
| 12/12/2022 | 5.9 |
| 12/12/2022 | 5.6 |
| 12/12/2022 | 5 |
| 12/12/2022 | 4.4 |
| 12/12/2022 | 3.9 |
| 12/12/2022 | 3.5 |
| 12/12/2022 | 3.1 |
| 13/12/2022 | 2.8 |
| 13/12/2022 | 2.6 |
| 13/12/2022 | 2.6 |
| 13/12/2022 | 2.7 |
| 13/12/2022 | 3.1 |
| 13/12/2022 | 3.9 |
| 13/12/2022 | 4.6 |
| 13/12/2022 | 5.1 |
| 13/12/2022 | 5.3 |
| 13/12/2022 | 5.4 |
| 13/12/2022 | 5.5 |
| 13/12/2022 | 5.6 |
| 13/12/2022 | 5.5 |
| 13/12/2022 | 5.5 |
| 13/12/2022 | 5.5 |
| 13/12/2022 | 5.9 |
| 13/12/2022 | 6 |
| 13/12/2022 | 5.9 |
| 13/12/2022 | 5.7 |
| 13/12/2022 | 5.1 |
| 13/12/2022 | 4.4 |
| 13/12/2022 | 4 |
| 13/12/2022 | 3.6 |
| 13/12/2022 | 3.2 |
| 14/12/2022 | 2.8 |
| 14/12/2022 | 2.6 |
| 14/12/2022 | 2.6 |
| 14/12/2022 | 2.7 |
| 14/12/2022 | 3.1 |
| 14/12/2022 | 3.9 |
| 14/12/2022 | 4.6 |
| 14/12/2022 | 5.1 |
| 14/12/2022 | 5.3 |
| 14/12/2022 | 5.4 |
| 14/12/2022 | 5.5 |
| 14/12/2022 | 5.5 |
| 14/12/2022 | 5.5 |
| 14/12/2022 | 5.5 |
| 14/12/2022 | 5.5 |
| 14/12/2022 | 5.9 |
| 14/12/2022 | 6 |
| 14/12/2022 | 6 |
| 14/12/2022 | 5.7 |
| 14/12/2022 | 5.1 |
| 14/12/2022 | 4.4 |
| 14/12/2022 | 4 |
| 14/12/2022 | 3.6 |
| 14/12/2022 | 3.2 |
| 15/12/2022 | 2.8 |
| 15/12/2022 | 2.6 |
| 15/12/2022 | 2.6 |
| 15/12/2022 | 2.7 |
| 15/12/2022 | 3.1 |
| 15/12/2022 | 3.8 |
| 15/12/2022 | 4.6 |
| 15/12/2022 | 5 |
| 15/12/2022 | 5.3 |
| 15/12/2022 | 5.4 |
| 15/12/2022 | 5.5 |
| 15/12/2022 | 5.5 |
| 15/12/2022 | 5.5 |
| 15/12/2022 | 5.5 |
| 15/12/2022 | 5.5 |
| 15/12/2022 | 5.9 |
| 15/12/2022 | 6 |
| 15/12/2022 | 5.9 |
| 15/12/2022 | 5.6 |
| 15/12/2022 | 5 |
| 15/12/2022 | 4.4 |
| 15/12/2022 | 3.9 |
| 15/12/2022 | 3.5 |
| 15/12/2022 | 3.2 |
| 16/12/2022 | 2.8 |
| 16/12/2022 | 2.6 |
| 16/12/2022 | 2.6 |
| 16/12/2022 | 2.7 |
| 16/12/2022 | 3.1 |
| 16/12/2022 | 3.8 |
| 16/12/2022 | 4.6 |
| 16/12/2022 | 5 |
| 16/12/2022 | 5.2 |
| 16/12/2022 | 5.4 |
| 16/12/2022 | 5.5 |
| 16/12/2022 | 5.5 |
| 16/12/2022 | 5.4 |
| 16/12/2022 | 5.3 |
| 16/12/2022 | 5.4 |
| 16/12/2022 | 5.7 |
| 16/12/2022 | 5.8 |
| 16/12/2022 | 5.7 |
| 16/12/2022 | 5.4 |
| 16/12/2022 | 4.8 |
| 16/12/2022 | 4.2 |
| 16/12/2022 | 3.8 |
| 16/12/2022 | 3.4 |
| 16/12/2022 | 3.1 |
| 17/12/2022 | 2.8 |
| 17/12/2022 | 2.6 |
| 17/12/2022 | 2.5 |
| 17/12/2022 | 2.5 |
| 17/12/2022 | 2.6 |
| 17/12/2022 | 2.8 |
| 17/12/2022 | 3.2 |
| 17/12/2022 | 3.7 |
| 17/12/2022 | 4.1 |
| 17/12/2022 | 4.4 |
| 17/12/2022 | 4.5 |
| 17/12/2022 | 4.5 |
| 17/12/2022 | 4.4 |
| 17/12/2022 | 4.4 |
| 17/12/2022 | 4.5 |
| 17/12/2022 | 4.7 |
| 17/12/2022 | 4.8 |
| 17/12/2022 | 4.8 |
| 17/12/2022 | 4.7 |
| 17/12/2022 | 4.2 |
| 17/12/2022 | 3.8 |
| 17/12/2022 | 3.5 |
| 17/12/2022 | 3.3 |
| 17/12/2022 | 3 |
| 18/12/2022 | 2.7 |
| 18/12/2022 | 2.5 |
| 18/12/2022 | 2.4 |
| 18/12/2022 | 2.4 |
| 18/12/2022 | 2.4 |
| 18/12/2022 | 2.5 |
| 18/12/2022 | 2.8 |
| 18/12/2022 | 3.1 |
| 18/12/2022 | 3.5 |
| 18/12/2022 | 3.8 |
| 18/12/2022 | 4 |
| 18/12/2022 | 4.1 |
| 18/12/2022 | 4 |
| 18/12/2022 | 4 |
| 18/12/2022 | 4.1 |
| 18/12/2022 | 4.4 |
| 18/12/2022 | 4.5 |
| 18/12/2022 | 4.6 |
| 18/12/2022 | 4.4 |
| 18/12/2022 | 4.1 |
| 18/12/2022 | 3.8 |
| 18/12/2022 | 3.6 |
| 18/12/2022 | 3.3 |
| 18/12/2022 | 3 |
| 19/12/2022 | 2.6 |
| 19/12/2022 | 2.5 |
| 19/12/2022 | 2.5 |
| 19/12/2022 | 2.6 |
| 19/12/2022 | 3 |
| 19/12/2022 | 3.8 |
| 19/12/2022 | 4.5 |
| 19/12/2022 | 4.9 |
| 19/12/2022 | 5.2 |
| 19/12/2022 | 5.4 |
| 19/12/2022 | 5.5 |
| 19/12/2022 | 5.5 |
| 19/12/2022 | 5.5 |
| 19/12/2022 | 5.4 |
| 19/12/2022 | 5.5 |
| 19/12/2022 | 5.8 |
| 19/12/2022 | 5.9 |
| 19/12/2022 | 5.9 |
| 19/12/2022 | 5.6 |
| 19/12/2022 | 5 |
| 19/12/2022 | 4.4 |
| 19/12/2022 | 3.9 |
| 19/12/2022 | 3.5 |
| 19/12/2022 | 3.1 |
| 20/12/2022 | 2.8 |
| 20/12/2022 | 2.6 |
| 20/12/2022 | 2.6 |
| 20/12/2022 | 2.7 |
| 20/12/2022 | 3.1 |
| 20/12/2022 | 3.8 |
| 20/12/2022 | 4.6 |
| 20/12/2022 | 5 |
| 20/12/2022 | 5.2 |
| 20/12/2022 | 5.4 |
| 20/12/2022 | 5.5 |
| 20/12/2022 | 5.5 |
| 20/12/2022 | 5.5 |
| 20/12/2022 | 5.5 |
| 20/12/2022 | 5.5 |
| 20/12/2022 | 5.9 |
| 20/12/2022 | 6 |
| 20/12/2022 | 5.9 |
| 20/12/2022 | 5.7 |
| 20/12/2022 | 5 |
| 20/12/2022 | 4.4 |
| 20/12/2022 | 4 |
| 20/12/2022 | 3.5 |
| 20/12/2022 | 3.2 |
| 21/12/2022 | 2.8 |
| 21/12/2022 | 2.6 |
| 21/12/2022 | 2.6 |
| 21/12/2022 | 2.7 |
| 21/12/2022 | 3.1 |
| 21/12/2022 | 3.8 |
| 21/12/2022 | 4.6 |
| 21/12/2022 | 5 |
| 21/12/2022 | 5.2 |
| 21/12/2022 | 5.4 |
| 21/12/2022 | 5.5 |
| 21/12/2022 | 5.5 |
| 21/12/2022 | 5.5 |
| 21/12/2022 | 5.5 |
| 21/12/2022 | 5.5 |
| 21/12/2022 | 5.9 |
| 21/12/2022 | 6 |
| 21/12/2022 | 5.9 |
| 21/12/2022 | 5.7 |
| 21/12/2022 | 5 |
| 21/12/2022 | 4.4 |
| 21/12/2022 | 4 |
| 21/12/2022 | 3.5 |
| 21/12/2022 | 3.2 |
| 22/12/2022 | 2.8 |
| 22/12/2022 | 2.6 |
| 22/12/2022 | 2.6 |
| 22/12/2022 | 2.7 |
| 22/12/2022 | 3 |
| 22/12/2022 | 3.7 |
| 22/12/2022 | 4.4 |
| 22/12/2022 | 4.8 |
| 22/12/2022 | 5.1 |
| 22/12/2022 | 5.3 |
| 22/12/2022 | 5.4 |
| 22/12/2022 | 5.4 |
| 22/12/2022 | 5.4 |
| 22/12/2022 | 5.3 |
| 22/12/2022 | 5.4 |
| 22/12/2022 | 5.7 |
| 22/12/2022 | 5.8 |
| 22/12/2022 | 5.7 |
| 22/12/2022 | 5.4 |
| 22/12/2022 | 4.9 |
| 22/12/2022 | 4.3 |
| 22/12/2022 | 3.9 |
| 22/12/2022 | 3.5 |
| 22/12/2022 | 3.2 |
| 23/12/2022 | 2.8 |
| 23/12/2022 | 2.6 |
| 23/12/2022 | 2.6 |
| 23/12/2022 | 2.7 |
| 23/12/2022 | 3 |
| 23/12/2022 | 3.6 |
| 23/12/2022 | 4.3 |
| 23/12/2022 | 4.8 |
| 23/12/2022 | 5.1 |
| 23/12/2022 | 5.3 |
| 23/12/2022 | 5.4 |
| 23/12/2022 | 5.4 |
| 23/12/2022 | 5.3 |
| 23/12/2022 | 5.2 |
| 23/12/2022 | 5.3 |
| 23/12/2022 | 5.5 |
| 23/12/2022 | 5.6 |
| 23/12/2022 | 5.4 |
| 23/12/2022 | 5.1 |
| 23/12/2022 | 4.6 |
| 23/12/2022 | 4.1 |
| 23/12/2022 | 3.7 |
| 23/12/2022 | 3.4 |
| 23/12/2022 | 2.9 |
| 24/12/2022 | 2.6 |
| 24/12/2022 | 2.5 |
| 24/12/2022 | 2.4 |
| 24/12/2022 | 2.4 |
| 24/12/2022 | 2.5 |
| 24/12/2022 | 2.8 |
| 24/12/2022 | 3.1 |
| 24/12/2022 | 3.6 |
| 24/12/2022 | 4 |
| 24/12/2022 | 4.3 |
| 24/12/2022 | 4.5 |
| 24/12/2022 | 4.5 |
| 24/12/2022 | 4.4 |
| 24/12/2022 | 4.1 |
| 24/12/2022 | 4 |
| 24/12/2022 | 4 |
| 24/12/2022 | 4 |
| 24/12/2022 | 3.9 |
| 24/12/2022 | 3.7 |
| 24/12/2022 | 3.5 |
| 24/12/2022 | 3.3 |
| 24/12/2022 | 3.1 |
| 24/12/2022 | 3.1 |
| 24/12/2022 | 2.9 |
| 25/12/2022 | 2.6 |
| 25/12/2022 | 2.4 |
| 25/12/2022 | 2.3 |
| 25/12/2022 | 2.3 |
| 25/12/2022 | 2.3 |
| 25/12/2022 | 2.4 |
| 25/12/2022 | 2.6 |
| 25/12/2022 | 2.9 |
| 25/12/2022 | 3.3 |
| 25/12/2022 | 3.6 |
| 25/12/2022 | 3.8 |
| 25/12/2022 | 3.9 |
| 25/12/2022 | 3.8 |
| 25/12/2022 | 3.7 |
| 25/12/2022 | 3.7 |
| 25/12/2022 | 3.8 |
| 25/12/2022 | 3.9 |
| 25/12/2022 | 3.9 |
| 25/12/2022 | 3.8 |
| 25/12/2022 | 3.6 |
| 25/12/2022 | 3.3 |
| 25/12/2022 | 3.2 |
| 25/12/2022 | 3 |
| 25/12/2022 | 2.9 |
| 26/12/2022 | 2.6 |
| 26/12/2022 | 2.4 |
| 26/12/2022 | 2.3 |
| 26/12/2022 | 2.3 |
| 26/12/2022 | 2.3 |
| 26/12/2022 | 2.4 |
| 26/12/2022 | 2.6 |
| 26/12/2022 | 2.9 |
| 26/12/2022 | 3.2 |
| 26/12/2022 | 3.6 |
| 26/12/2022 | 3.8 |
| 26/12/2022 | 3.9 |
| 26/12/2022 | 3.8 |
| 26/12/2022 | 3.7 |
| 26/12/2022 | 3.7 |
| 26/12/2022 | 3.8 |
| 26/12/2022 | 3.9 |
| 26/12/2022 | 3.9 |
| 26/12/2022 | 3.8 |
| 26/12/2022 | 3.6 |
| 26/12/2022 | 3.3 |
| 26/12/2022 | 3.2 |
| 26/12/2022 | 3 |
| 26/12/2022 | 2.9 |
| 27/12/2022 | 2.6 |
| 27/12/2022 | 2.4 |
| 27/12/2022 | 2.3 |
| 27/12/2022 | 2.4 |
| 27/12/2022 | 2.6 |
| 27/12/2022 | 2.9 |
| 27/12/2022 | 3.3 |
| 27/12/2022 | 3.6 |
| 27/12/2022 | 4 |
| 27/12/2022 | 4.3 |
| 27/12/2022 | 4.4 |
| 27/12/2022 | 4.5 |
| 27/12/2022 | 4.4 |
| 27/12/2022 | 4.4 |
| 27/12/2022 | 4.4 |
| 27/12/2022 | 4.7 |
| 27/12/2022 | 4.8 |
| 27/12/2022 | 4.8 |
| 27/12/2022 | 4.6 |
| 27/12/2022 | 4.2 |
| 27/12/2022 | 3.8 |
| 27/12/2022 | 3.4 |
| 27/12/2022 | 3.2 |
| 27/12/2022 | 2.9 |
| 28/12/2022 | 2.6 |
| 28/12/2022 | 2.4 |
| 28/12/2022 | 2.3 |
| 28/12/2022 | 2.4 |
| 28/12/2022 | 2.6 |
| 28/12/2022 | 2.9 |
| 28/12/2022 | 3.3 |
| 28/12/2022 | 3.6 |
| 28/12/2022 | 4 |
| 28/12/2022 | 4.3 |
| 28/12/2022 | 4.4 |
| 28/12/2022 | 4.5 |
| 28/12/2022 | 4.4 |
| 28/12/2022 | 4.4 |
| 28/12/2022 | 4.4 |
| 28/12/2022 | 4.7 |
| 28/12/2022 | 4.8 |
| 28/12/2022 | 4.8 |
| 28/12/2022 | 4.6 |
| 28/12/2022 | 4.2 |
| 28/12/2022 | 3.8 |
| 28/12/2022 | 3.4 |
| 28/12/2022 | 3.2 |
| 28/12/2022 | 2.9 |
| 29/12/2022 | 2.6 |
| 29/12/2022 | 2.4 |
| 29/12/2022 | 2.3 |
| 29/12/2022 | 2.4 |
| 29/12/2022 | 2.6 |
| 29/12/2022 | 2.9 |
| 29/12/2022 | 3.3 |
| 29/12/2022 | 3.6 |
| 29/12/2022 | 4 |
| 29/12/2022 | 4.3 |
| 29/12/2022 | 4.4 |
| 29/12/2022 | 4.5 |
| 29/12/2022 | 4.4 |
| 29/12/2022 | 4.4 |
| 29/12/2022 | 4.5 |
| 29/12/2022 | 4.7 |
| 29/12/2022 | 4.8 |
| 29/12/2022 | 4.8 |
| 29/12/2022 | 4.6 |
| 29/12/2022 | 4.2 |
| 29/12/2022 | 3.8 |
| 29/12/2022 | 3.4 |
| 29/12/2022 | 3.2 |
| 29/12/2022 | 2.9 |
| 30/12/2022 | 2.6 |
| 30/12/2022 | 2.4 |
| 30/12/2022 | 2.3 |
| 30/12/2022 | 2.4 |
| 30/12/2022 | 2.6 |
| 30/12/2022 | 2.9 |
| 30/12/2022 | 3.3 |
| 30/12/2022 | 3.6 |
| 30/12/2022 | 4 |
| 30/12/2022 | 4.3 |
| 30/12/2022 | 4.4 |
| 30/12/2022 | 4.5 |
| 30/12/2022 | 4.4 |
| 30/12/2022 | 4.4 |
| 30/12/2022 | 4.5 |
| 30/12/2022 | 4.7 |
| 30/12/2022 | 4.7 |
| 30/12/2022 | 4.8 |
| 30/12/2022 | 4.6 |
| 30/12/2022 | 4.2 |
| 30/12/2022 | 3.8 |
| 30/12/2022 | 3.4 |
| 30/12/2022 | 3.2 |
| 30/12/2022 | 2.9 |
| 31/12/2022 | 2.7 |
| 31/12/2022 | 2.4 |
| 31/12/2022 | 2.4 |
| 31/12/2022 | 2.4 |
| 31/12/2022 | 2.5 |
| 31/12/2022 | 2.8 |
| 31/12/2022 | 3.1 |
| 31/12/2022 | 3.4 |
| 31/12/2022 | 3.8 |
| 31/12/2022 | 4 |
| 31/12/2022 | 4.2 |
| 31/12/2022 | 4.2 |
| 31/12/2022 | 4.2 |
| 31/12/2022 | 4.1 |
| 31/12/2022 | 4.2 |
| 31/12/2022 | 4.6 |
| 31/12/2022 | 4.6 |
| 31/12/2022 | 4.5 |
| 31/12/2022 | 4.3 |
| 31/12/2022 | 3.8 |
| 31/12/2022 | 3.5 |
| 31/12/2022 | 3.2 |
| 31/12/2022 | 3.1 |